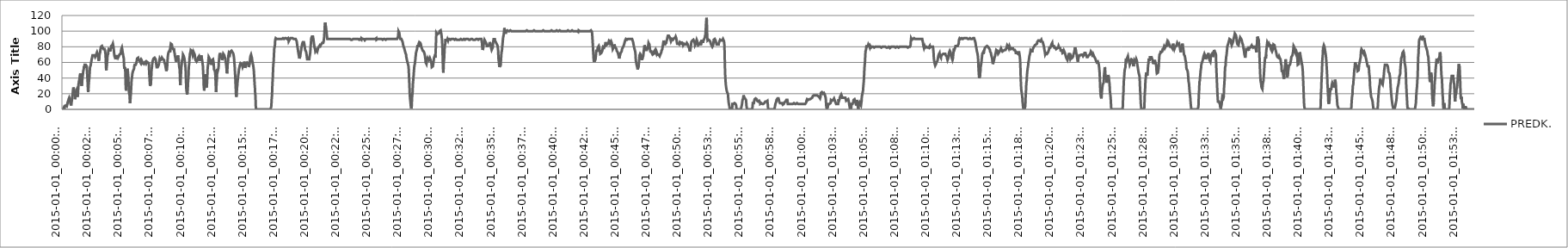
| Category | PREDK. |
|---|---|
| 2015-01-01_00:00:09 | 0 |
| 2015-01-01_00:00:10 | 0 |
| 2015-01-01_00:00:11 | 0 |
| 2015-01-01_00:00:12 | 0 |
| 2015-01-01_00:00:13 | 2 |
| 2015-01-01_00:00:14 | 2 |
| 2015-01-01_00:00:15 | 0 |
| 2015-01-01_00:00:16 | 0 |
| 2015-01-01_00:00:17 | 2 |
| 2015-01-01_00:00:18 | 4 |
| 2015-01-01_00:00:19 | 5 |
| 2015-01-01_00:00:20 | 5 |
| 2015-01-01_00:00:21 | 5 |
| 2015-01-01_00:00:22 | 5 |
| 2015-01-01_00:00:23 | 5 |
| 2015-01-01_00:00:24 | 6 |
| 2015-01-01_00:00:25 | 5 |
| 2015-01-01_00:00:26 | 6 |
| 2015-01-01_00:00:27 | 4 |
| 2015-01-01_00:00:28 | 4 |
| 2015-01-01_00:00:29 | 4 |
| 2015-01-01_00:00:30 | 4 |
| 2015-01-01_00:00:31 | 7 |
| 2015-01-01_00:00:32 | 9 |
| 2015-01-01_00:00:33 | 9 |
| 2015-01-01_00:00:34 | 10 |
| 2015-01-01_00:00:35 | 11 |
| 2015-01-01_00:00:36 | 11 |
| 2015-01-01_00:00:37 | 13 |
| 2015-01-01_00:00:38 | 13 |
| 2015-01-01_00:00:39 | 14 |
| 2015-01-01_00:00:40 | 15 |
| 2015-01-01_00:00:41 | 15 |
| 2015-01-01_00:00:42 | 14 |
| 2015-01-01_00:00:43 | 13 |
| 2015-01-01_00:00:44 | 10 |
| 2015-01-01_00:00:45 | 8 |
| 2015-01-01_00:00:46 | 9 |
| 2015-01-01_00:00:47 | 7 |
| 2015-01-01_00:00:48 | 7 |
| 2015-01-01_00:00:49 | 5 |
| 2015-01-01_00:00:50 | 7 |
| 2015-01-01_00:00:51 | 7 |
| 2015-01-01_00:00:52 | 8 |
| 2015-01-01_00:00:53 | 12 |
| 2015-01-01_00:00:54 | 15 |
| 2015-01-01_00:00:55 | 15 |
| 2015-01-01_00:00:56 | 16 |
| 2015-01-01_00:00:57 | 21 |
| 2015-01-01_00:00:58 | 24 |
| 2015-01-01_00:00:59 | 26 |
| 2015-01-01_00:01:00 | 28 |
| 2015-01-01_00:01:01 | 28 |
| 2015-01-01_00:01:02 | 27 |
| 2015-01-01_00:01:03 | 25 |
| 2015-01-01_00:01:04 | 24 |
| 2015-01-01_00:01:05 | 23 |
| 2015-01-01_00:01:06 | 19 |
| 2015-01-01_00:01:07 | 15 |
| 2015-01-01_00:01:08 | 13 |
| 2015-01-01_00:01:09 | 13 |
| 2015-01-01_00:01:10 | 16 |
| 2015-01-01_00:01:11 | 20 |
| 2015-01-01_00:01:12 | 21 |
| 2015-01-01_00:01:13 | 23 |
| 2015-01-01_00:01:14 | 23 |
| 2015-01-01_00:01:15 | 24 |
| 2015-01-01_00:01:16 | 25 |
| 2015-01-01_00:01:17 | 25 |
| 2015-01-01_00:01:18 | 24 |
| 2015-01-01_00:01:19 | 22 |
| 2015-01-01_00:01:20 | 18 |
| 2015-01-01_00:01:21 | 16 |
| 2015-01-01_00:01:22 | 20 |
| 2015-01-01_00:01:23 | 24 |
| 2015-01-01_00:01:24 | 28 |
| 2015-01-01_00:01:25 | 32 |
| 2015-01-01_00:01:26 | 33 |
| 2015-01-01_00:01:27 | 33 |
| 2015-01-01_00:01:28 | 37 |
| 2015-01-01_00:01:29 | 37 |
| 2015-01-01_00:01:30 | 39 |
| 2015-01-01_00:01:31 | 42 |
| 2015-01-01_00:01:32 | 44 |
| 2015-01-01_00:01:33 | 45 |
| 2015-01-01_00:01:34 | 46 |
| 2015-01-01_00:01:35 | 45 |
| 2015-01-01_00:01:36 | 42 |
| 2015-01-01_00:01:37 | 40 |
| 2015-01-01_00:01:38 | 37 |
| 2015-01-01_00:01:39 | 32 |
| 2015-01-01_00:01:40 | 30 |
| 2015-01-01_00:01:41 | 30 |
| 2015-01-01_00:01:42 | 33 |
| 2015-01-01_00:01:43 | 37 |
| 2015-01-01_00:01:44 | 39 |
| 2015-01-01_00:01:45 | 42 |
| 2015-01-01_00:01:46 | 44 |
| 2015-01-01_00:01:47 | 46 |
| 2015-01-01_00:01:48 | 49 |
| 2015-01-01_00:01:49 | 50 |
| 2015-01-01_00:01:50 | 51 |
| 2015-01-01_00:01:51 | 53 |
| 2015-01-01_00:01:52 | 55 |
| 2015-01-01_00:01:53 | 53 |
| 2015-01-01_00:01:54 | 54 |
| 2015-01-01_00:01:55 | 57 |
| 2015-01-01_00:01:56 | 56 |
| 2015-01-01_00:01:57 | 57 |
| 2015-01-01_00:01:58 | 56 |
| 2015-01-01_00:01:59 | 57 |
| 2015-01-01_00:02:00 | 57 |
| 2015-01-01_00:02:01 | 57 |
| 2015-01-01_00:02:02 | 57 |
| 2015-01-01_00:02:03 | 58 |
| 2015-01-01_00:02:04 | 56 |
| 2015-01-01_00:02:05 | 55 |
| 2015-01-01_00:02:06 | 51 |
| 2015-01-01_00:02:07 | 46 |
| 2015-01-01_00:02:08 | 41 |
| 2015-01-01_00:02:09 | 37 |
| 2015-01-01_00:02:10 | 30 |
| 2015-01-01_00:02:11 | 25 |
| 2015-01-01_00:02:12 | 22 |
| 2015-01-01_00:02:13 | 25 |
| 2015-01-01_00:02:14 | 29 |
| 2015-01-01_00:02:15 | 34 |
| 2015-01-01_00:02:16 | 34 |
| 2015-01-01_00:02:17 | 39 |
| 2015-01-01_00:02:18 | 42 |
| 2015-01-01_00:02:19 | 47 |
| 2015-01-01_00:02:20 | 51 |
| 2015-01-01_00:02:21 | 54 |
| 2015-01-01_00:02:22 | 54 |
| 2015-01-01_00:02:23 | 54 |
| 2015-01-01_00:02:24 | 56 |
| 2015-01-01_00:02:25 | 58 |
| 2015-01-01_00:02:26 | 58 |
| 2015-01-01_00:02:27 | 61 |
| 2015-01-01_00:02:28 | 61 |
| 2015-01-01_00:02:29 | 64 |
| 2015-01-01_00:02:30 | 65 |
| 2015-01-01_00:02:31 | 66 |
| 2015-01-01_00:02:32 | 67 |
| 2015-01-01_00:02:33 | 69 |
| 2015-01-01_00:02:34 | 69 |
| 2015-01-01_00:02:35 | 70 |
| 2015-01-01_00:02:36 | 70 |
| 2015-01-01_00:02:37 | 70 |
| 2015-01-01_00:02:38 | 69 |
| 2015-01-01_00:02:39 | 69 |
| 2015-01-01_00:02:40 | 69 |
| 2015-01-01_00:02:41 | 70 |
| 2015-01-01_00:02:42 | 69 |
| 2015-01-01_00:02:43 | 69 |
| 2015-01-01_00:02:44 | 68 |
| 2015-01-01_00:02:45 | 68 |
| 2015-01-01_00:02:46 | 67 |
| 2015-01-01_00:02:47 | 68 |
| 2015-01-01_00:02:48 | 68 |
| 2015-01-01_00:02:49 | 68 |
| 2015-01-01_00:02:50 | 69 |
| 2015-01-01_00:02:51 | 69 |
| 2015-01-01_00:02:52 | 71 |
| 2015-01-01_00:02:53 | 71 |
| 2015-01-01_00:02:54 | 72 |
| 2015-01-01_00:02:55 | 73 |
| 2015-01-01_00:02:56 | 73 |
| 2015-01-01_00:02:57 | 73 |
| 2015-01-01_00:02:58 | 72 |
| 2015-01-01_00:02:59 | 70 |
| 2015-01-01_00:03:00 | 68 |
| 2015-01-01_00:03:01 | 66 |
| 2015-01-01_00:03:02 | 65 |
| 2015-01-01_00:03:03 | 62 |
| 2015-01-01_00:03:04 | 61 |
| 2015-01-01_00:03:05 | 63 |
| 2015-01-01_00:03:06 | 66 |
| 2015-01-01_00:03:07 | 70 |
| 2015-01-01_00:03:08 | 71 |
| 2015-01-01_00:03:09 | 71 |
| 2015-01-01_00:03:10 | 73 |
| 2015-01-01_00:03:11 | 74 |
| 2015-01-01_00:03:12 | 77 |
| 2015-01-01_00:03:13 | 78 |
| 2015-01-01_00:03:14 | 80 |
| 2015-01-01_00:03:15 | 80 |
| 2015-01-01_00:03:16 | 81 |
| 2015-01-01_00:03:17 | 81 |
| 2015-01-01_00:03:18 | 80 |
| 2015-01-01_00:03:19 | 81 |
| 2015-01-01_00:03:20 | 80 |
| 2015-01-01_00:03:21 | 80 |
| 2015-01-01_00:03:22 | 79 |
| 2015-01-01_00:03:23 | 78 |
| 2015-01-01_00:03:24 | 78 |
| 2015-01-01_00:03:25 | 78 |
| 2015-01-01_00:03:26 | 78 |
| 2015-01-01_00:03:27 | 77 |
| 2015-01-01_00:03:28 | 77 |
| 2015-01-01_00:03:29 | 77 |
| 2015-01-01_00:03:30 | 76 |
| 2015-01-01_00:03:31 | 77 |
| 2015-01-01_00:03:32 | 77 |
| 2015-01-01_00:03:33 | 76 |
| 2015-01-01_00:03:34 | 75 |
| 2015-01-01_00:03:35 | 73 |
| 2015-01-01_00:03:36 | 71 |
| 2015-01-01_00:03:37 | 67 |
| 2015-01-01_00:03:38 | 59 |
| 2015-01-01_00:03:39 | 53 |
| 2015-01-01_00:03:40 | 50 |
| 2015-01-01_00:03:41 | 52 |
| 2015-01-01_00:03:42 | 54 |
| 2015-01-01_00:03:43 | 58 |
| 2015-01-01_00:03:44 | 60 |
| 2015-01-01_00:03:45 | 65 |
| 2015-01-01_00:03:46 | 69 |
| 2015-01-01_00:03:47 | 69 |
| 2015-01-01_00:03:48 | 70 |
| 2015-01-01_00:03:49 | 71 |
| 2015-01-01_00:03:50 | 75 |
| 2015-01-01_00:03:51 | 75 |
| 2015-01-01_00:03:52 | 77 |
| 2015-01-01_00:03:53 | 78 |
| 2015-01-01_00:03:54 | 77 |
| 2015-01-01_00:03:55 | 76 |
| 2015-01-01_00:03:56 | 76 |
| 2015-01-01_00:03:57 | 76 |
| 2015-01-01_00:03:58 | 74 |
| 2015-01-01_00:03:59 | 75 |
| 2015-01-01_00:04:00 | 75 |
| 2015-01-01_00:04:01 | 77 |
| 2015-01-01_00:04:02 | 78 |
| 2015-01-01_00:04:03 | 79 |
| 2015-01-01_00:04:04 | 81 |
| 2015-01-01_00:04:05 | 81 |
| 2015-01-01_00:04:06 | 82 |
| 2015-01-01_00:04:07 | 82 |
| 2015-01-01_00:04:08 | 81 |
| 2015-01-01_00:04:09 | 82 |
| 2015-01-01_00:04:10 | 83 |
| 2015-01-01_00:04:11 | 83 |
| 2015-01-01_00:04:12 | 84 |
| 2015-01-01_00:04:13 | 85 |
| 2015-01-01_00:04:14 | 83 |
| 2015-01-01_00:04:15 | 80 |
| 2015-01-01_00:04:16 | 77 |
| 2015-01-01_00:04:17 | 75 |
| 2015-01-01_00:04:18 | 72 |
| 2015-01-01_00:04:19 | 70 |
| 2015-01-01_00:04:20 | 68 |
| 2015-01-01_00:04:21 | 68 |
| 2015-01-01_00:04:22 | 67 |
| 2015-01-01_00:04:23 | 66 |
| 2015-01-01_00:04:24 | 65 |
| 2015-01-01_00:04:25 | 64 |
| 2015-01-01_00:04:26 | 65 |
| 2015-01-01_00:04:27 | 66 |
| 2015-01-01_00:04:28 | 67 |
| 2015-01-01_00:04:29 | 68 |
| 2015-01-01_00:04:30 | 68 |
| 2015-01-01_00:04:31 | 68 |
| 2015-01-01_00:04:32 | 69 |
| 2015-01-01_00:04:33 | 69 |
| 2015-01-01_00:04:34 | 68 |
| 2015-01-01_00:04:35 | 68 |
| 2015-01-01_00:04:36 | 67 |
| 2015-01-01_00:04:37 | 66 |
| 2015-01-01_00:04:38 | 66 |
| 2015-01-01_00:04:39 | 66 |
| 2015-01-01_00:04:40 | 67 |
| 2015-01-01_00:04:41 | 68 |
| 2015-01-01_00:04:42 | 68 |
| 2015-01-01_00:04:43 | 69 |
| 2015-01-01_00:04:44 | 70 |
| 2015-01-01_00:04:45 | 70 |
| 2015-01-01_00:04:46 | 71 |
| 2015-01-01_00:04:47 | 71 |
| 2015-01-01_00:04:48 | 71 |
| 2015-01-01_00:04:49 | 71 |
| 2015-01-01_00:04:50 | 72 |
| 2015-01-01_00:04:51 | 73 |
| 2015-01-01_00:04:52 | 74 |
| 2015-01-01_00:04:53 | 77 |
| 2015-01-01_00:04:54 | 78 |
| 2015-01-01_00:04:55 | 78 |
| 2015-01-01_00:04:56 | 79 |
| 2015-01-01_00:04:57 | 78 |
| 2015-01-01_00:04:58 | 76 |
| 2015-01-01_00:04:59 | 74 |
| 2015-01-01_00:05:00 | 73 |
| 2015-01-01_00:05:01 | 71 |
| 2015-01-01_00:05:02 | 71 |
| 2015-01-01_00:05:03 | 68 |
| 2015-01-01_00:05:04 | 68 |
| 2015-01-01_00:05:05 | 65 |
| 2015-01-01_00:05:06 | 60 |
| 2015-01-01_00:05:07 | 55 |
| 2015-01-01_00:05:08 | 52 |
| 2015-01-01_00:05:09 | 52 |
| 2015-01-01_00:05:10 | 54 |
| 2015-01-01_00:05:11 | 52 |
| 2015-01-01_00:05:12 | 50 |
| 2015-01-01_00:05:13 | 45 |
| 2015-01-01_00:05:14 | 33 |
| 2015-01-01_00:05:15 | 27 |
| 2015-01-01_00:05:16 | 24 |
| 2015-01-01_00:05:17 | 27 |
| 2015-01-01_00:05:18 | 34 |
| 2015-01-01_00:05:19 | 39 |
| 2015-01-01_00:05:20 | 42 |
| 2015-01-01_00:05:21 | 48 |
| 2015-01-01_00:05:22 | 52 |
| 2015-01-01_00:05:23 | 52 |
| 2015-01-01_00:05:24 | 51 |
| 2015-01-01_00:05:25 | 48 |
| 2015-01-01_00:05:26 | 45 |
| 2015-01-01_00:05:27 | 42 |
| 2015-01-01_00:05:28 | 35 |
| 2015-01-01_00:05:29 | 29 |
| 2015-01-01_00:05:30 | 23 |
| 2015-01-01_00:05:31 | 21 |
| 2015-01-01_00:05:32 | 20 |
| 2015-01-01_00:05:33 | 19 |
| 2015-01-01_00:05:34 | 14 |
| 2015-01-01_00:05:35 | 8 |
| 2015-01-01_00:05:36 | 7 |
| 2015-01-01_00:05:37 | 11 |
| 2015-01-01_00:05:38 | 16 |
| 2015-01-01_00:05:39 | 17 |
| 2015-01-01_00:05:40 | 21 |
| 2015-01-01_00:05:41 | 28 |
| 2015-01-01_00:05:42 | 32 |
| 2015-01-01_00:05:43 | 38 |
| 2015-01-01_00:05:44 | 38 |
| 2015-01-01_00:05:45 | 40 |
| 2015-01-01_00:05:46 | 44 |
| 2015-01-01_00:05:47 | 46 |
| 2015-01-01_00:05:48 | 45 |
| 2015-01-01_00:05:49 | 47 |
| 2015-01-01_00:05:50 | 49 |
| 2015-01-01_00:05:51 | 49 |
| 2015-01-01_00:05:52 | 49 |
| 2015-01-01_00:05:53 | 48 |
| 2015-01-01_00:05:54 | 50 |
| 2015-01-01_00:05:55 | 52 |
| 2015-01-01_00:05:56 | 55 |
| 2015-01-01_00:05:57 | 56 |
| 2015-01-01_00:05:58 | 57 |
| 2015-01-01_00:05:59 | 57 |
| 2015-01-01_00:06:00 | 58 |
| 2015-01-01_00:06:01 | 57 |
| 2015-01-01_00:06:02 | 56 |
| 2015-01-01_00:06:03 | 57 |
| 2015-01-01_00:06:04 | 57 |
| 2015-01-01_00:06:05 | 58 |
| 2015-01-01_00:06:06 | 59 |
| 2015-01-01_00:06:07 | 60 |
| 2015-01-01_00:06:08 | 62 |
| 2015-01-01_00:06:09 | 63 |
| 2015-01-01_00:06:10 | 65 |
| 2015-01-01_00:06:11 | 64 |
| 2015-01-01_00:06:12 | 65 |
| 2015-01-01_00:06:13 | 65 |
| 2015-01-01_00:06:14 | 66 |
| 2015-01-01_00:06:15 | 66 |
| 2015-01-01_00:06:16 | 67 |
| 2015-01-01_00:06:17 | 64 |
| 2015-01-01_00:06:18 | 65 |
| 2015-01-01_00:06:19 | 63 |
| 2015-01-01_00:06:20 | 63 |
| 2015-01-01_00:06:21 | 63 |
| 2015-01-01_00:06:22 | 62 |
| 2015-01-01_00:06:23 | 62 |
| 2015-01-01_00:06:24 | 62 |
| 2015-01-01_00:06:25 | 62 |
| 2015-01-01_00:06:26 | 60 |
| 2015-01-01_00:06:27 | 61 |
| 2015-01-01_00:06:28 | 62 |
| 2015-01-01_00:06:29 | 62 |
| 2015-01-01_00:06:30 | 62 |
| 2015-01-01_00:06:31 | 60 |
| 2015-01-01_00:06:32 | 61 |
| 2015-01-01_00:06:33 | 62 |
| 2015-01-01_00:06:34 | 61 |
| 2015-01-01_00:06:35 | 62 |
| 2015-01-01_00:06:36 | 61 |
| 2015-01-01_00:06:37 | 61 |
| 2015-01-01_00:06:38 | 59 |
| 2015-01-01_00:06:39 | 60 |
| 2015-01-01_00:06:40 | 59 |
| 2015-01-01_00:06:41 | 59 |
| 2015-01-01_00:06:42 | 59 |
| 2015-01-01_00:06:43 | 58 |
| 2015-01-01_00:06:44 | 58 |
| 2015-01-01_00:06:45 | 59 |
| 2015-01-01_00:06:46 | 60 |
| 2015-01-01_00:06:47 | 59 |
| 2015-01-01_00:06:48 | 59 |
| 2015-01-01_00:06:49 | 61 |
| 2015-01-01_00:06:50 | 60 |
| 2015-01-01_00:06:51 | 61 |
| 2015-01-01_00:06:52 | 60 |
| 2015-01-01_00:06:53 | 60 |
| 2015-01-01_00:06:54 | 59 |
| 2015-01-01_00:06:55 | 60 |
| 2015-01-01_00:06:56 | 60 |
| 2015-01-01_00:06:57 | 61 |
| 2015-01-01_00:06:58 | 61 |
| 2015-01-01_00:06:59 | 62 |
| 2015-01-01_00:07:00 | 62 |
| 2015-01-01_00:07:01 | 62 |
| 2015-01-01_00:07:02 | 60 |
| 2015-01-01_00:07:03 | 60 |
| 2015-01-01_00:07:04 | 61 |
| 2015-01-01_00:07:05 | 61 |
| 2015-01-01_00:07:06 | 60 |
| 2015-01-01_00:07:07 | 59 |
| 2015-01-01_00:07:08 | 53 |
| 2015-01-01_00:07:09 | 45 |
| 2015-01-01_00:07:10 | 43 |
| 2015-01-01_00:07:11 | 38 |
| 2015-01-01_00:07:12 | 33 |
| 2015-01-01_00:07:13 | 30 |
| 2015-01-01_00:07:14 | 30 |
| 2015-01-01_00:07:15 | 31 |
| 2015-01-01_00:07:16 | 30 |
| 2015-01-01_00:07:17 | 33 |
| 2015-01-01_00:07:18 | 38 |
| 2015-01-01_00:07:19 | 44 |
| 2015-01-01_00:07:20 | 50 |
| 2015-01-01_00:07:21 | 51 |
| 2015-01-01_00:07:22 | 54 |
| 2015-01-01_00:07:23 | 57 |
| 2015-01-01_00:07:24 | 59 |
| 2015-01-01_00:07:25 | 61 |
| 2015-01-01_00:07:26 | 62 |
| 2015-01-01_00:07:27 | 63 |
| 2015-01-01_00:07:28 | 63 |
| 2015-01-01_00:07:29 | 64 |
| 2015-01-01_00:07:30 | 65 |
| 2015-01-01_00:07:31 | 66 |
| 2015-01-01_00:07:32 | 65 |
| 2015-01-01_00:07:33 | 66 |
| 2015-01-01_00:07:34 | 66 |
| 2015-01-01_00:07:35 | 66 |
| 2015-01-01_00:07:36 | 67 |
| 2015-01-01_00:07:37 | 65 |
| 2015-01-01_00:07:38 | 66 |
| 2015-01-01_00:07:39 | 66 |
| 2015-01-01_00:07:40 | 64 |
| 2015-01-01_00:07:41 | 63 |
| 2015-01-01_00:07:42 | 60 |
| 2015-01-01_00:07:43 | 58 |
| 2015-01-01_00:07:44 | 56 |
| 2015-01-01_00:07:45 | 54 |
| 2015-01-01_00:07:46 | 53 |
| 2015-01-01_00:07:47 | 53 |
| 2015-01-01_00:07:48 | 53 |
| 2015-01-01_00:07:49 | 53 |
| 2015-01-01_00:07:50 | 54 |
| 2015-01-01_00:07:51 | 55 |
| 2015-01-01_00:07:52 | 55 |
| 2015-01-01_00:07:53 | 55 |
| 2015-01-01_00:07:54 | 56 |
| 2015-01-01_00:07:55 | 56 |
| 2015-01-01_00:07:56 | 58 |
| 2015-01-01_00:07:57 | 59 |
| 2015-01-01_00:07:58 | 62 |
| 2015-01-01_00:07:59 | 63 |
| 2015-01-01_00:08:00 | 65 |
| 2015-01-01_00:08:01 | 65 |
| 2015-01-01_00:08:02 | 65 |
| 2015-01-01_00:08:03 | 64 |
| 2015-01-01_00:08:04 | 63 |
| 2015-01-01_00:08:05 | 63 |
| 2015-01-01_00:08:06 | 62 |
| 2015-01-01_00:08:07 | 63 |
| 2015-01-01_00:08:08 | 63 |
| 2015-01-01_00:08:09 | 64 |
| 2015-01-01_00:08:10 | 64 |
| 2015-01-01_00:08:11 | 66 |
| 2015-01-01_00:08:12 | 66 |
| 2015-01-01_00:08:13 | 67 |
| 2015-01-01_00:08:14 | 66 |
| 2015-01-01_00:08:15 | 65 |
| 2015-01-01_00:08:16 | 64 |
| 2015-01-01_00:08:17 | 64 |
| 2015-01-01_00:08:18 | 63 |
| 2015-01-01_00:08:19 | 63 |
| 2015-01-01_00:08:20 | 63 |
| 2015-01-01_00:08:21 | 63 |
| 2015-01-01_00:08:22 | 61 |
| 2015-01-01_00:08:23 | 61 |
| 2015-01-01_00:08:24 | 59 |
| 2015-01-01_00:08:25 | 58 |
| 2015-01-01_00:08:26 | 58 |
| 2015-01-01_00:08:27 | 57 |
| 2015-01-01_00:08:28 | 55 |
| 2015-01-01_00:08:29 | 54 |
| 2015-01-01_00:08:30 | 52 |
| 2015-01-01_00:08:31 | 51 |
| 2015-01-01_00:08:32 | 49 |
| 2015-01-01_00:08:33 | 49 |
| 2015-01-01_00:08:34 | 50 |
| 2015-01-01_00:08:35 | 52 |
| 2015-01-01_00:08:36 | 54 |
| 2015-01-01_00:08:37 | 59 |
| 2015-01-01_00:08:38 | 63 |
| 2015-01-01_00:08:39 | 67 |
| 2015-01-01_00:08:40 | 69 |
| 2015-01-01_00:08:41 | 71 |
| 2015-01-01_00:08:42 | 71 |
| 2015-01-01_00:08:43 | 73 |
| 2015-01-01_00:08:44 | 72 |
| 2015-01-01_00:08:45 | 73 |
| 2015-01-01_00:08:46 | 73 |
| 2015-01-01_00:08:47 | 75 |
| 2015-01-01_00:08:48 | 74 |
| 2015-01-01_00:08:49 | 74 |
| 2015-01-01_00:08:50 | 73 |
| 2015-01-01_00:08:51 | 76 |
| 2015-01-01_00:08:52 | 80 |
| 2015-01-01_00:08:53 | 82 |
| 2015-01-01_00:08:54 | 84 |
| 2015-01-01_00:08:55 | 83 |
| 2015-01-01_00:08:56 | 83 |
| 2015-01-01_00:08:57 | 84 |
| 2015-01-01_00:08:58 | 83 |
| 2015-01-01_00:08:59 | 83 |
| 2015-01-01_00:09:00 | 80 |
| 2015-01-01_00:09:01 | 80 |
| 2015-01-01_00:09:02 | 79 |
| 2015-01-01_00:09:03 | 78 |
| 2015-01-01_00:09:04 | 78 |
| 2015-01-01_00:09:05 | 77 |
| 2015-01-01_00:09:06 | 76 |
| 2015-01-01_00:09:07 | 78 |
| 2015-01-01_00:09:08 | 77 |
| 2015-01-01_00:09:09 | 77 |
| 2015-01-01_00:09:10 | 76 |
| 2015-01-01_00:09:11 | 73 |
| 2015-01-01_00:09:12 | 72 |
| 2015-01-01_00:09:13 | 71 |
| 2015-01-01_00:09:14 | 68 |
| 2015-01-01_00:09:15 | 67 |
| 2015-01-01_00:09:16 | 66 |
| 2015-01-01_00:09:17 | 64 |
| 2015-01-01_00:09:18 | 63 |
| 2015-01-01_00:09:19 | 61 |
| 2015-01-01_00:09:20 | 61 |
| 2015-01-01_00:09:21 | 63 |
| 2015-01-01_00:09:22 | 64 |
| 2015-01-01_00:09:23 | 63 |
| 2015-01-01_00:09:24 | 64 |
| 2015-01-01_00:09:25 | 63 |
| 2015-01-01_00:09:26 | 65 |
| 2015-01-01_00:09:27 | 67 |
| 2015-01-01_00:09:28 | 68 |
| 2015-01-01_00:09:29 | 69 |
| 2015-01-01_00:09:30 | 67 |
| 2015-01-01_00:09:31 | 65 |
| 2015-01-01_00:09:32 | 63 |
| 2015-01-01_00:09:33 | 59 |
| 2015-01-01_00:09:34 | 58 |
| 2015-01-01_00:09:35 | 54 |
| 2015-01-01_00:09:36 | 53 |
| 2015-01-01_00:09:37 | 51 |
| 2015-01-01_00:09:38 | 45 |
| 2015-01-01_00:09:39 | 35 |
| 2015-01-01_00:09:40 | 31 |
| 2015-01-01_00:09:41 | 34 |
| 2015-01-01_00:09:42 | 39 |
| 2015-01-01_00:09:43 | 45 |
| 2015-01-01_00:09:44 | 50 |
| 2015-01-01_00:09:45 | 54 |
| 2015-01-01_00:09:46 | 54 |
| 2015-01-01_00:09:47 | 58 |
| 2015-01-01_00:09:48 | 62 |
| 2015-01-01_00:09:49 | 63 |
| 2015-01-01_00:09:50 | 64 |
| 2015-01-01_00:09:51 | 65 |
| 2015-01-01_00:09:52 | 67 |
| 2015-01-01_00:09:53 | 70 |
| 2015-01-01_00:09:54 | 70 |
| 2015-01-01_00:09:55 | 69 |
| 2015-01-01_00:09:56 | 70 |
| 2015-01-01_00:09:57 | 68 |
| 2015-01-01_00:09:58 | 69 |
| 2015-01-01_00:09:59 | 67 |
| 2015-01-01_00:10:00 | 65 |
| 2015-01-01_00:10:01 | 63 |
| 2015-01-01_00:10:02 | 61 |
| 2015-01-01_00:10:03 | 59 |
| 2015-01-01_00:10:04 | 57 |
| 2015-01-01_00:10:05 | 54 |
| 2015-01-01_00:10:06 | 50 |
| 2015-01-01_00:10:07 | 42 |
| 2015-01-01_00:10:08 | 35 |
| 2015-01-01_00:10:09 | 27 |
| 2015-01-01_00:10:10 | 24 |
| 2015-01-01_00:10:11 | 23 |
| 2015-01-01_00:10:12 | 21 |
| 2015-01-01_00:10:13 | 19 |
| 2015-01-01_00:10:14 | 20 |
| 2015-01-01_00:10:15 | 22 |
| 2015-01-01_00:10:16 | 25 |
| 2015-01-01_00:10:17 | 31 |
| 2015-01-01_00:10:18 | 37 |
| 2015-01-01_00:10:19 | 39 |
| 2015-01-01_00:10:20 | 45 |
| 2015-01-01_00:10:21 | 53 |
| 2015-01-01_00:10:22 | 56 |
| 2015-01-01_00:10:23 | 58 |
| 2015-01-01_00:10:24 | 62 |
| 2015-01-01_00:10:25 | 66 |
| 2015-01-01_00:10:26 | 68 |
| 2015-01-01_00:10:27 | 71 |
| 2015-01-01_00:10:28 | 71 |
| 2015-01-01_00:10:29 | 72 |
| 2015-01-01_00:10:30 | 74 |
| 2015-01-01_00:10:31 | 76 |
| 2015-01-01_00:10:32 | 77 |
| 2015-01-01_00:10:33 | 77 |
| 2015-01-01_00:10:34 | 77 |
| 2015-01-01_00:10:35 | 75 |
| 2015-01-01_00:10:36 | 75 |
| 2015-01-01_00:10:37 | 74 |
| 2015-01-01_00:10:38 | 74 |
| 2015-01-01_00:10:39 | 72 |
| 2015-01-01_00:10:40 | 71 |
| 2015-01-01_00:10:41 | 69 |
| 2015-01-01_00:10:42 | 69 |
| 2015-01-01_00:10:43 | 70 |
| 2015-01-01_00:10:44 | 71 |
| 2015-01-01_00:10:45 | 73 |
| 2015-01-01_00:10:46 | 74 |
| 2015-01-01_00:10:47 | 73 |
| 2015-01-01_00:10:48 | 73 |
| 2015-01-01_00:10:49 | 72 |
| 2015-01-01_00:10:50 | 70 |
| 2015-01-01_00:10:51 | 68 |
| 2015-01-01_00:10:52 | 65 |
| 2015-01-01_00:10:53 | 65 |
| 2015-01-01_00:10:54 | 63 |
| 2015-01-01_00:10:55 | 64 |
| 2015-01-01_00:10:56 | 63 |
| 2015-01-01_00:10:57 | 62 |
| 2015-01-01_00:10:58 | 62 |
| 2015-01-01_00:10:59 | 61 |
| 2015-01-01_00:11:00 | 60 |
| 2015-01-01_00:11:01 | 60 |
| 2015-01-01_00:11:02 | 61 |
| 2015-01-01_00:11:03 | 60 |
| 2015-01-01_00:11:04 | 63 |
| 2015-01-01_00:11:05 | 64 |
| 2015-01-01_00:11:06 | 66 |
| 2015-01-01_00:11:07 | 67 |
| 2015-01-01_00:11:08 | 67 |
| 2015-01-01_00:11:09 | 67 |
| 2015-01-01_00:11:10 | 66 |
| 2015-01-01_00:11:11 | 68 |
| 2015-01-01_00:11:12 | 67 |
| 2015-01-01_00:11:13 | 66 |
| 2015-01-01_00:11:14 | 64 |
| 2015-01-01_00:11:15 | 63 |
| 2015-01-01_00:11:16 | 63 |
| 2015-01-01_00:11:17 | 62 |
| 2015-01-01_00:11:18 | 64 |
| 2015-01-01_00:11:19 | 64 |
| 2015-01-01_00:11:20 | 67 |
| 2015-01-01_00:11:21 | 68 |
| 2015-01-01_00:11:22 | 69 |
| 2015-01-01_00:11:23 | 68 |
| 2015-01-01_00:11:24 | 66 |
| 2015-01-01_00:11:25 | 65 |
| 2015-01-01_00:11:26 | 63 |
| 2015-01-01_00:11:27 | 61 |
| 2015-01-01_00:11:28 | 61 |
| 2015-01-01_00:11:29 | 60 |
| 2015-01-01_00:11:30 | 55 |
| 2015-01-01_00:11:31 | 49 |
| 2015-01-01_00:11:32 | 44 |
| 2015-01-01_00:11:33 | 38 |
| 2015-01-01_00:11:34 | 30 |
| 2015-01-01_00:11:35 | 27 |
| 2015-01-01_00:11:36 | 24 |
| 2015-01-01_00:11:37 | 25 |
| 2015-01-01_00:11:38 | 29 |
| 2015-01-01_00:11:39 | 36 |
| 2015-01-01_00:11:40 | 37 |
| 2015-01-01_00:11:41 | 38 |
| 2015-01-01_00:11:42 | 43 |
| 2015-01-01_00:11:43 | 45 |
| 2015-01-01_00:11:44 | 44 |
| 2015-01-01_00:11:45 | 41 |
| 2015-01-01_00:11:46 | 34 |
| 2015-01-01_00:11:47 | 28 |
| 2015-01-01_00:11:48 | 27 |
| 2015-01-01_00:11:49 | 30 |
| 2015-01-01_00:11:50 | 34 |
| 2015-01-01_00:11:51 | 40 |
| 2015-01-01_00:11:52 | 46 |
| 2015-01-01_00:11:53 | 53 |
| 2015-01-01_00:11:54 | 55 |
| 2015-01-01_00:11:55 | 56 |
| 2015-01-01_00:11:56 | 60 |
| 2015-01-01_00:11:57 | 64 |
| 2015-01-01_00:11:58 | 67 |
| 2015-01-01_00:11:59 | 67 |
| 2015-01-01_00:12:00 | 67 |
| 2015-01-01_00:12:01 | 66 |
| 2015-01-01_00:12:02 | 65 |
| 2015-01-01_00:12:03 | 63 |
| 2015-01-01_00:12:04 | 62 |
| 2015-01-01_00:12:05 | 62 |
| 2015-01-01_00:12:06 | 62 |
| 2015-01-01_00:12:07 | 60 |
| 2015-01-01_00:12:08 | 60 |
| 2015-01-01_00:12:09 | 59 |
| 2015-01-01_00:12:10 | 57 |
| 2015-01-01_00:12:11 | 58 |
| 2015-01-01_00:12:12 | 59 |
| 2015-01-01_00:12:13 | 61 |
| 2015-01-01_00:12:14 | 63 |
| 2015-01-01_00:12:15 | 64 |
| 2015-01-01_00:12:16 | 64 |
| 2015-01-01_00:12:17 | 64 |
| 2015-01-01_00:12:18 | 63 |
| 2015-01-01_00:12:19 | 64 |
| 2015-01-01_00:12:20 | 63 |
| 2015-01-01_00:12:21 | 61 |
| 2015-01-01_00:12:22 | 59 |
| 2015-01-01_00:12:23 | 55 |
| 2015-01-01_00:12:24 | 51 |
| 2015-01-01_00:12:25 | 51 |
| 2015-01-01_00:12:26 | 51 |
| 2015-01-01_00:12:27 | 51 |
| 2015-01-01_00:12:28 | 49 |
| 2015-01-01_00:12:29 | 48 |
| 2015-01-01_00:12:30 | 46 |
| 2015-01-01_00:12:31 | 41 |
| 2015-01-01_00:12:32 | 33 |
| 2015-01-01_00:12:33 | 27 |
| 2015-01-01_00:12:34 | 22 |
| 2015-01-01_00:12:35 | 25 |
| 2015-01-01_00:12:36 | 33 |
| 2015-01-01_00:12:37 | 36 |
| 2015-01-01_00:12:38 | 39 |
| 2015-01-01_00:12:39 | 47 |
| 2015-01-01_00:12:40 | 52 |
| 2015-01-01_00:12:41 | 53 |
| 2015-01-01_00:12:42 | 52 |
| 2015-01-01_00:12:43 | 50 |
| 2015-01-01_00:12:44 | 51 |
| 2015-01-01_00:12:45 | 52 |
| 2015-01-01_00:12:46 | 54 |
| 2015-01-01_00:12:47 | 60 |
| 2015-01-01_00:12:48 | 61 |
| 2015-01-01_00:12:49 | 65 |
| 2015-01-01_00:12:50 | 68 |
| 2015-01-01_00:12:51 | 70 |
| 2015-01-01_00:12:52 | 71 |
| 2015-01-01_00:12:53 | 72 |
| 2015-01-01_00:12:54 | 72 |
| 2015-01-01_00:12:55 | 70 |
| 2015-01-01_00:12:56 | 69 |
| 2015-01-01_00:12:57 | 69 |
| 2015-01-01_00:12:58 | 68 |
| 2015-01-01_00:12:59 | 68 |
| 2015-01-01_00:13:00 | 65 |
| 2015-01-01_00:13:01 | 67 |
| 2015-01-01_00:13:02 | 65 |
| 2015-01-01_00:13:03 | 63 |
| 2015-01-01_00:13:04 | 62 |
| 2015-01-01_00:13:05 | 63 |
| 2015-01-01_00:13:06 | 65 |
| 2015-01-01_00:13:07 | 68 |
| 2015-01-01_00:13:08 | 69 |
| 2015-01-01_00:13:09 | 71 |
| 2015-01-01_00:13:10 | 71 |
| 2015-01-01_00:13:11 | 72 |
| 2015-01-01_00:13:12 | 70 |
| 2015-01-01_00:13:13 | 70 |
| 2015-01-01_00:13:14 | 69 |
| 2015-01-01_00:13:15 | 68 |
| 2015-01-01_00:13:16 | 67 |
| 2015-01-01_00:13:17 | 67 |
| 2015-01-01_00:13:18 | 66 |
| 2015-01-01_00:13:19 | 65 |
| 2015-01-01_00:13:20 | 62 |
| 2015-01-01_00:13:21 | 61 |
| 2015-01-01_00:13:22 | 59 |
| 2015-01-01_00:13:23 | 58 |
| 2015-01-01_00:13:24 | 55 |
| 2015-01-01_00:13:25 | 52 |
| 2015-01-01_00:13:26 | 48 |
| 2015-01-01_00:13:27 | 46 |
| 2015-01-01_00:13:28 | 48 |
| 2015-01-01_00:13:29 | 52 |
| 2015-01-01_00:13:30 | 57 |
| 2015-01-01_00:13:31 | 59 |
| 2015-01-01_00:13:32 | 61 |
| 2015-01-01_00:13:33 | 65 |
| 2015-01-01_00:13:34 | 69 |
| 2015-01-01_00:13:35 | 70 |
| 2015-01-01_00:13:36 | 72 |
| 2015-01-01_00:13:37 | 71 |
| 2015-01-01_00:13:38 | 71 |
| 2015-01-01_00:13:39 | 71 |
| 2015-01-01_00:13:40 | 71 |
| 2015-01-01_00:13:41 | 70 |
| 2015-01-01_00:13:42 | 72 |
| 2015-01-01_00:13:43 | 72 |
| 2015-01-01_00:13:44 | 74 |
| 2015-01-01_00:13:45 | 75 |
| 2015-01-01_00:13:46 | 75 |
| 2015-01-01_00:13:47 | 74 |
| 2015-01-01_00:13:48 | 74 |
| 2015-01-01_00:13:49 | 75 |
| 2015-01-01_00:13:50 | 74 |
| 2015-01-01_00:13:51 | 75 |
| 2015-01-01_00:13:52 | 74 |
| 2015-01-01_00:13:53 | 74 |
| 2015-01-01_00:13:54 | 73 |
| 2015-01-01_00:13:55 | 73 |
| 2015-01-01_00:13:56 | 72 |
| 2015-01-01_00:13:57 | 72 |
| 2015-01-01_00:13:58 | 71 |
| 2015-01-01_00:13:59 | 70 |
| 2015-01-01_00:14:00 | 68 |
| 2015-01-01_00:14:01 | 66 |
| 2015-01-01_00:14:02 | 63 |
| 2015-01-01_00:14:03 | 59 |
| 2015-01-01_00:14:04 | 57 |
| 2015-01-01_00:14:05 | 52 |
| 2015-01-01_00:14:06 | 47 |
| 2015-01-01_00:14:07 | 43 |
| 2015-01-01_00:14:08 | 37 |
| 2015-01-01_00:14:09 | 31 |
| 2015-01-01_00:14:10 | 25 |
| 2015-01-01_00:14:11 | 18 |
| 2015-01-01_00:14:12 | 16 |
| 2015-01-01_00:14:13 | 16 |
| 2015-01-01_00:14:14 | 19 |
| 2015-01-01_00:14:15 | 24 |
| 2015-01-01_00:14:16 | 28 |
| 2015-01-01_00:14:17 | 30 |
| 2015-01-01_00:14:18 | 34 |
| 2015-01-01_00:14:19 | 37 |
| 2015-01-01_00:14:20 | 39 |
| 2015-01-01_00:14:21 | 42 |
| 2015-01-01_00:14:22 | 43 |
| 2015-01-01_00:14:23 | 46 |
| 2015-01-01_00:14:24 | 48 |
| 2015-01-01_00:14:25 | 51 |
| 2015-01-01_00:14:26 | 50 |
| 2015-01-01_00:14:27 | 53 |
| 2015-01-01_00:14:28 | 53 |
| 2015-01-01_00:14:29 | 56 |
| 2015-01-01_00:14:30 | 55 |
| 2015-01-01_00:14:31 | 55 |
| 2015-01-01_00:14:32 | 57 |
| 2015-01-01_00:14:33 | 59 |
| 2015-01-01_00:14:34 | 59 |
| 2015-01-01_00:14:35 | 58 |
| 2015-01-01_00:14:36 | 59 |
| 2015-01-01_00:14:37 | 58 |
| 2015-01-01_00:14:38 | 58 |
| 2015-01-01_00:14:39 | 57 |
| 2015-01-01_00:14:40 | 57 |
| 2015-01-01_00:14:41 | 56 |
| 2015-01-01_00:14:42 | 56 |
| 2015-01-01_00:14:43 | 54 |
| 2015-01-01_00:14:44 | 55 |
| 2015-01-01_00:14:45 | 55 |
| 2015-01-01_00:14:46 | 56 |
| 2015-01-01_00:14:47 | 55 |
| 2015-01-01_00:14:48 | 56 |
| 2015-01-01_00:14:49 | 56 |
| 2015-01-01_00:14:50 | 58 |
| 2015-01-01_00:14:51 | 61 |
| 2015-01-01_00:14:52 | 61 |
| 2015-01-01_00:14:53 | 58 |
| 2015-01-01_00:14:54 | 56 |
| 2015-01-01_00:14:55 | 53 |
| 2015-01-01_00:14:56 | 52 |
| 2015-01-01_00:14:57 | 52 |
| 2015-01-01_00:14:58 | 53 |
| 2015-01-01_00:14:59 | 57 |
| 2015-01-01_00:15:00 | 59 |
| 2015-01-01_00:15:01 | 60 |
| 2015-01-01_00:15:02 | 60 |
| 2015-01-01_00:15:03 | 59 |
| 2015-01-01_00:15:04 | 60 |
| 2015-01-01_00:15:05 | 60 |
| 2015-01-01_00:15:06 | 59 |
| 2015-01-01_00:15:07 | 60 |
| 2015-01-01_00:15:08 | 60 |
| 2015-01-01_00:15:09 | 60 |
| 2015-01-01_00:15:10 | 59 |
| 2015-01-01_00:15:11 | 58 |
| 2015-01-01_00:15:12 | 56 |
| 2015-01-01_00:15:13 | 54 |
| 2015-01-01_00:15:14 | 54 |
| 2015-01-01_00:15:15 | 55 |
| 2015-01-01_00:15:16 | 55 |
| 2015-01-01_00:15:17 | 59 |
| 2015-01-01_00:15:18 | 61 |
| 2015-01-01_00:15:19 | 64 |
| 2015-01-01_00:15:20 | 66 |
| 2015-01-01_00:15:21 | 68 |
| 2015-01-01_00:15:22 | 69 |
| 2015-01-01_00:15:23 | 68 |
| 2015-01-01_00:15:24 | 70 |
| 2015-01-01_00:15:25 | 69 |
| 2015-01-01_00:15:26 | 68 |
| 2015-01-01_00:15:27 | 68 |
| 2015-01-01_00:15:28 | 66 |
| 2015-01-01_00:15:29 | 65 |
| 2015-01-01_00:15:30 | 62 |
| 2015-01-01_00:15:31 | 62 |
| 2015-01-01_00:15:32 | 59 |
| 2015-01-01_00:15:33 | 59 |
| 2015-01-01_00:15:34 | 57 |
| 2015-01-01_00:15:35 | 56 |
| 2015-01-01_00:15:36 | 53 |
| 2015-01-01_00:15:37 | 51 |
| 2015-01-01_00:15:38 | 48 |
| 2015-01-01_00:15:39 | 43 |
| 2015-01-01_00:15:40 | 39 |
| 2015-01-01_00:15:41 | 34 |
| 2015-01-01_00:15:42 | 30 |
| 2015-01-01_00:15:43 | 27 |
| 2015-01-01_00:15:44 | 21 |
| 2015-01-01_00:15:45 | 18 |
| 2015-01-01_00:15:46 | 12 |
| 2015-01-01_00:15:47 | 4 |
| 2015-01-01_00:15:48 | 1 |
| 2015-01-01_00:15:49 | 0 |
| 2015-01-01_00:15:50 | 0 |
| 2015-01-01_00:15:51 | 0 |
| 2015-01-01_00:15:52 | 0 |
| 2015-01-01_00:15:53 | 0 |
| 2015-01-01_00:15:54 | 0 |
| 2015-01-01_00:15:55 | 0 |
| 2015-01-01_00:15:56 | 0 |
| 2015-01-01_00:15:57 | 0 |
| 2015-01-01_00:15:58 | 0 |
| 2015-01-01_00:15:59 | 0 |
| 2015-01-01_00:16:00 | 0 |
| 2015-01-01_00:16:01 | 0 |
| 2015-01-01_00:16:02 | 0 |
| 2015-01-01_00:16:03 | 0 |
| 2015-01-01_00:16:04 | 0 |
| 2015-01-01_00:16:05 | 0 |
| 2015-01-01_00:16:06 | 0 |
| 2015-01-01_00:16:07 | 0 |
| 2015-01-01_00:16:08 | 0 |
| 2015-01-01_00:16:09 | 0 |
| 2015-01-01_00:16:10 | 0 |
| 2015-01-01_00:16:11 | 0 |
| 2015-01-01_00:16:12 | 0 |
| 2015-01-01_00:16:13 | 0 |
| 2015-01-01_00:16:14 | 0 |
| 2015-01-01_00:16:15 | 0 |
| 2015-01-01_00:16:16 | 0 |
| 2015-01-01_00:16:17 | 0 |
| 2015-01-01_00:16:18 | 0 |
| 2015-01-01_00:16:19 | 0 |
| 2015-01-01_00:16:20 | 0 |
| 2015-01-01_00:16:21 | 0 |
| 2015-01-01_00:16:22 | 0 |
| 2015-01-01_00:16:23 | 0 |
| 2015-01-01_00:16:24 | 0 |
| 2015-01-01_00:16:25 | 0 |
| 2015-01-01_00:16:26 | 0 |
| 2015-01-01_00:16:27 | 0 |
| 2015-01-01_00:16:28 | 0 |
| 2015-01-01_00:16:29 | 0 |
| 2015-01-01_00:16:30 | 0 |
| 2015-01-01_00:16:31 | 0 |
| 2015-01-01_00:16:32 | 0 |
| 2015-01-01_00:16:33 | 0 |
| 2015-01-01_00:16:34 | 0 |
| 2015-01-01_00:16:35 | 0 |
| 2015-01-01_00:16:36 | 0 |
| 2015-01-01_00:16:37 | 0 |
| 2015-01-01_00:16:38 | 0 |
| 2015-01-01_00:16:39 | 0 |
| 2015-01-01_00:16:40 | 0 |
| 2015-01-01_00:16:41 | 0 |
| 2015-01-01_00:16:42 | 0 |
| 2015-01-01_00:16:43 | 0 |
| 2015-01-01_00:16:44 | 0 |
| 2015-01-01_00:16:45 | 0 |
| 2015-01-01_00:16:46 | 0 |
| 2015-01-01_00:16:47 | 0 |
| 2015-01-01_00:16:48 | 0 |
| 2015-01-01_00:16:49 | 0 |
| 2015-01-01_00:16:50 | 0 |
| 2015-01-01_00:16:51 | 0 |
| 2015-01-01_00:16:52 | 0 |
| 2015-01-01_00:16:53 | 0 |
| 2015-01-01_00:16:54 | 0 |
| 2015-01-01_00:16:55 | 0 |
| 2015-01-01_00:16:56 | 0 |
| 2015-01-01_00:16:57 | 0 |
| 2015-01-01_00:16:58 | 0 |
| 2015-01-01_00:16:59 | 0 |
| 2015-01-01_00:17:00 | 0 |
| 2015-01-01_00:17:01 | 0 |
| 2015-01-01_00:17:02 | 3 |
| 2015-01-01_00:17:03 | 6 |
| 2015-01-01_00:17:04 | 12 |
| 2015-01-01_00:17:05 | 15 |
| 2015-01-01_00:17:06 | 18 |
| 2015-01-01_00:17:07 | 26 |
| 2015-01-01_00:17:08 | 33 |
| 2015-01-01_00:17:09 | 37 |
| 2015-01-01_00:17:10 | 42 |
| 2015-01-01_00:17:11 | 50 |
| 2015-01-01_00:17:12 | 56 |
| 2015-01-01_00:17:13 | 59 |
| 2015-01-01_00:17:14 | 62 |
| 2015-01-01_00:17:15 | 67 |
| 2015-01-01_00:17:16 | 73 |
| 2015-01-01_00:17:17 | 78 |
| 2015-01-01_00:17:18 | 78 |
| 2015-01-01_00:17:19 | 80 |
| 2015-01-01_00:17:20 | 82 |
| 2015-01-01_00:17:21 | 87 |
| 2015-01-01_00:17:22 | 89 |
| 2015-01-01_00:17:23 | 90 |
| 2015-01-01_00:17:24 | 91 |
| 2015-01-01_00:17:25 | 92 |
| 2015-01-01_00:17:26 | 92 |
| 2015-01-01_00:17:27 | 90 |
| 2015-01-01_00:17:28 | 90 |
| 2015-01-01_00:17:29 | 90 |
| 2015-01-01_00:17:30 | 90 |
| 2015-01-01_00:17:31 | 90 |
| 2015-01-01_00:17:32 | 91 |
| 2015-01-01_00:17:33 | 91 |
| 2015-01-01_00:17:34 | 90 |
| 2015-01-01_00:17:35 | 90 |
| 2015-01-01_00:17:36 | 90 |
| 2015-01-01_00:17:37 | 90 |
| 2015-01-01_00:17:38 | 91 |
| 2015-01-01_00:17:39 | 90 |
| 2015-01-01_00:17:40 | 90 |
| 2015-01-01_00:17:41 | 91 |
| 2015-01-01_00:17:42 | 90 |
| 2015-01-01_00:17:43 | 90 |
| 2015-01-01_00:17:44 | 90 |
| 2015-01-01_00:17:45 | 91 |
| 2015-01-01_00:17:46 | 90 |
| 2015-01-01_00:17:47 | 91 |
| 2015-01-01_00:17:48 | 90 |
| 2015-01-01_00:17:49 | 90 |
| 2015-01-01_00:17:50 | 91 |
| 2015-01-01_00:17:51 | 90 |
| 2015-01-01_00:17:52 | 90 |
| 2015-01-01_00:17:53 | 91 |
| 2015-01-01_00:17:54 | 90 |
| 2015-01-01_00:17:55 | 90 |
| 2015-01-01_00:17:56 | 91 |
| 2015-01-01_00:17:57 | 90 |
| 2015-01-01_00:17:58 | 90 |
| 2015-01-01_00:17:59 | 91 |
| 2015-01-01_00:18:00 | 90 |
| 2015-01-01_00:18:01 | 91 |
| 2015-01-01_00:18:02 | 90 |
| 2015-01-01_00:18:03 | 90 |
| 2015-01-01_00:18:04 | 90 |
| 2015-01-01_00:18:05 | 91 |
| 2015-01-01_00:18:06 | 90 |
| 2015-01-01_00:18:07 | 90 |
| 2015-01-01_00:18:08 | 90 |
| 2015-01-01_00:18:09 | 91 |
| 2015-01-01_00:18:10 | 90 |
| 2015-01-01_00:18:11 | 91 |
| 2015-01-01_00:18:12 | 90 |
| 2015-01-01_00:18:13 | 90 |
| 2015-01-01_00:18:14 | 91 |
| 2015-01-01_00:18:15 | 90 |
| 2015-01-01_00:18:16 | 90 |
| 2015-01-01_00:18:17 | 91 |
| 2015-01-01_00:18:18 | 90 |
| 2015-01-01_00:18:19 | 90 |
| 2015-01-01_00:18:20 | 90 |
| 2015-01-01_00:18:21 | 91 |
| 2015-01-01_00:18:22 | 90 |
| 2015-01-01_00:18:23 | 90 |
| 2015-01-01_00:18:24 | 91 |
| 2015-01-01_00:18:25 | 90 |
| 2015-01-01_00:18:26 | 89 |
| 2015-01-01_00:18:27 | 87 |
| 2015-01-01_00:18:28 | 88 |
| 2015-01-01_00:18:29 | 87 |
| 2015-01-01_00:18:30 | 88 |
| 2015-01-01_00:18:31 | 89 |
| 2015-01-01_00:18:32 | 90 |
| 2015-01-01_00:18:33 | 90 |
| 2015-01-01_00:18:34 | 89 |
| 2015-01-01_00:18:35 | 90 |
| 2015-01-01_00:18:36 | 91 |
| 2015-01-01_00:18:37 | 90 |
| 2015-01-01_00:18:38 | 91 |
| 2015-01-01_00:18:39 | 91 |
| 2015-01-01_00:18:40 | 90 |
| 2015-01-01_00:18:41 | 91 |
| 2015-01-01_00:18:42 | 90 |
| 2015-01-01_00:18:43 | 91 |
| 2015-01-01_00:18:44 | 90 |
| 2015-01-01_00:18:45 | 90 |
| 2015-01-01_00:18:46 | 91 |
| 2015-01-01_00:18:47 | 90 |
| 2015-01-01_00:18:48 | 91 |
| 2015-01-01_00:18:49 | 90 |
| 2015-01-01_00:18:50 | 91 |
| 2015-01-01_00:18:51 | 90 |
| 2015-01-01_00:18:52 | 91 |
| 2015-01-01_00:18:53 | 90 |
| 2015-01-01_00:18:54 | 91 |
| 2015-01-01_00:18:55 | 90 |
| 2015-01-01_00:18:56 | 90 |
| 2015-01-01_00:18:57 | 91 |
| 2015-01-01_00:18:58 | 90 |
| 2015-01-01_00:18:59 | 91 |
| 2015-01-01_00:19:00 | 90 |
| 2015-01-01_00:19:01 | 90 |
| 2015-01-01_00:19:02 | 90 |
| 2015-01-01_00:19:03 | 91 |
| 2015-01-01_00:19:04 | 90 |
| 2015-01-01_00:19:05 | 89 |
| 2015-01-01_00:19:06 | 87 |
| 2015-01-01_00:19:07 | 85 |
| 2015-01-01_00:19:08 | 83 |
| 2015-01-01_00:19:09 | 81 |
| 2015-01-01_00:19:10 | 80 |
| 2015-01-01_00:19:11 | 78 |
| 2015-01-01_00:19:12 | 76 |
| 2015-01-01_00:19:13 | 74 |
| 2015-01-01_00:19:14 | 73 |
| 2015-01-01_00:19:15 | 71 |
| 2015-01-01_00:19:16 | 70 |
| 2015-01-01_00:19:17 | 68 |
| 2015-01-01_00:19:18 | 67 |
| 2015-01-01_00:19:19 | 65 |
| 2015-01-01_00:19:20 | 64 |
| 2015-01-01_00:19:21 | 64 |
| 2015-01-01_00:19:22 | 65 |
| 2015-01-01_00:19:23 | 68 |
| 2015-01-01_00:19:24 | 69 |
| 2015-01-01_00:19:25 | 72 |
| 2015-01-01_00:19:26 | 74 |
| 2015-01-01_00:19:27 | 75 |
| 2015-01-01_00:19:28 | 76 |
| 2015-01-01_00:19:29 | 79 |
| 2015-01-01_00:19:30 | 79 |
| 2015-01-01_00:19:31 | 81 |
| 2015-01-01_00:19:32 | 82 |
| 2015-01-01_00:19:33 | 84 |
| 2015-01-01_00:19:34 | 84 |
| 2015-01-01_00:19:35 | 85 |
| 2015-01-01_00:19:36 | 86 |
| 2015-01-01_00:19:37 | 86 |
| 2015-01-01_00:19:38 | 86 |
| 2015-01-01_00:19:39 | 86 |
| 2015-01-01_00:19:40 | 86 |
| 2015-01-01_00:19:41 | 86 |
| 2015-01-01_00:19:42 | 86 |
| 2015-01-01_00:19:43 | 85 |
| 2015-01-01_00:19:44 | 82 |
| 2015-01-01_00:19:45 | 80 |
| 2015-01-01_00:19:46 | 78 |
| 2015-01-01_00:19:47 | 76 |
| 2015-01-01_00:19:48 | 76 |
| 2015-01-01_00:19:49 | 76 |
| 2015-01-01_00:19:50 | 75 |
| 2015-01-01_00:19:51 | 74 |
| 2015-01-01_00:19:52 | 73 |
| 2015-01-01_00:19:53 | 72 |
| 2015-01-01_00:19:54 | 70 |
| 2015-01-01_00:19:55 | 69 |
| 2015-01-01_00:19:56 | 66 |
| 2015-01-01_00:19:57 | 64 |
| 2015-01-01_00:19:58 | 64 |
| 2015-01-01_00:19:59 | 64 |
| 2015-01-01_00:20:00 | 64 |
| 2015-01-01_00:20:01 | 64 |
| 2015-01-01_00:20:02 | 64 |
| 2015-01-01_00:20:03 | 64 |
| 2015-01-01_00:20:04 | 64 |
| 2015-01-01_00:20:05 | 65 |
| 2015-01-01_00:20:06 | 65 |
| 2015-01-01_00:20:07 | 64 |
| 2015-01-01_00:20:08 | 66 |
| 2015-01-01_00:20:09 | 68 |
| 2015-01-01_00:20:10 | 69 |
| 2015-01-01_00:20:11 | 71 |
| 2015-01-01_00:20:12 | 73 |
| 2015-01-01_00:20:13 | 77 |
| 2015-01-01_00:20:14 | 81 |
| 2015-01-01_00:20:15 | 84 |
| 2015-01-01_00:20:16 | 88 |
| 2015-01-01_00:20:17 | 91 |
| 2015-01-01_00:20:18 | 91 |
| 2015-01-01_00:20:19 | 92 |
| 2015-01-01_00:20:20 | 93 |
| 2015-01-01_00:20:21 | 93 |
| 2015-01-01_00:20:22 | 92 |
| 2015-01-01_00:20:23 | 92 |
| 2015-01-01_00:20:24 | 92 |
| 2015-01-01_00:20:25 | 93 |
| 2015-01-01_00:20:26 | 92 |
| 2015-01-01_00:20:27 | 90 |
| 2015-01-01_00:20:28 | 89 |
| 2015-01-01_00:20:29 | 86 |
| 2015-01-01_00:20:30 | 85 |
| 2015-01-01_00:20:31 | 82 |
| 2015-01-01_00:20:32 | 81 |
| 2015-01-01_00:20:33 | 79 |
| 2015-01-01_00:20:34 | 78 |
| 2015-01-01_00:20:35 | 78 |
| 2015-01-01_00:20:36 | 76 |
| 2015-01-01_00:20:37 | 74 |
| 2015-01-01_00:20:38 | 74 |
| 2015-01-01_00:20:39 | 74 |
| 2015-01-01_00:20:40 | 74 |
| 2015-01-01_00:20:41 | 75 |
| 2015-01-01_00:20:42 | 76 |
| 2015-01-01_00:20:43 | 76 |
| 2015-01-01_00:20:44 | 75 |
| 2015-01-01_00:20:45 | 75 |
| 2015-01-01_00:20:46 | 74 |
| 2015-01-01_00:20:47 | 74 |
| 2015-01-01_00:20:48 | 75 |
| 2015-01-01_00:20:49 | 77 |
| 2015-01-01_00:20:50 | 77 |
| 2015-01-01_00:20:51 | 79 |
| 2015-01-01_00:20:52 | 78 |
| 2015-01-01_00:20:53 | 78 |
| 2015-01-01_00:20:54 | 78 |
| 2015-01-01_00:20:55 | 80 |
| 2015-01-01_00:20:56 | 81 |
| 2015-01-01_00:20:57 | 80 |
| 2015-01-01_00:20:58 | 79 |
| 2015-01-01_00:20:59 | 80 |
| 2015-01-01_00:21:00 | 81 |
| 2015-01-01_00:21:01 | 80 |
| 2015-01-01_00:21:02 | 81 |
| 2015-01-01_00:21:03 | 82 |
| 2015-01-01_00:21:04 | 82 |
| 2015-01-01_00:21:05 | 83 |
| 2015-01-01_00:21:06 | 84 |
| 2015-01-01_00:21:07 | 83 |
| 2015-01-01_00:21:08 | 84 |
| 2015-01-01_00:21:09 | 84 |
| 2015-01-01_00:21:10 | 85 |
| 2015-01-01_00:21:11 | 85 |
| 2015-01-01_00:21:12 | 84 |
| 2015-01-01_00:21:13 | 84 |
| 2015-01-01_00:21:14 | 84 |
| 2015-01-01_00:21:15 | 85 |
| 2015-01-01_00:21:16 | 86 |
| 2015-01-01_00:21:17 | 87 |
| 2015-01-01_00:21:18 | 89 |
| 2015-01-01_00:21:19 | 91 |
| 2015-01-01_00:21:20 | 93 |
| 2015-01-01_00:21:21 | 99 |
| 2015-01-01_00:21:22 | 102 |
| 2015-01-01_00:21:23 | 109 |
| 2015-01-01_00:21:24 | 110 |
| 2015-01-01_00:21:25 | 111 |
| 2015-01-01_00:21:26 | 108 |
| 2015-01-01_00:21:27 | 108 |
| 2015-01-01_00:21:28 | 106 |
| 2015-01-01_00:21:29 | 105 |
| 2015-01-01_00:21:30 | 101 |
| 2015-01-01_00:21:31 | 99 |
| 2015-01-01_00:21:32 | 96 |
| 2015-01-01_00:21:33 | 95 |
| 2015-01-01_00:21:34 | 92 |
| 2015-01-01_00:21:35 | 90 |
| 2015-01-01_00:21:36 | 89 |
| 2015-01-01_00:21:37 | 89 |
| 2015-01-01_00:21:38 | 90 |
| 2015-01-01_00:21:39 | 90 |
| 2015-01-01_00:21:40 | 90 |
| 2015-01-01_00:21:41 | 90 |
| 2015-01-01_00:21:42 | 90 |
| 2015-01-01_00:21:43 | 89 |
| 2015-01-01_00:21:44 | 90 |
| 2015-01-01_00:21:45 | 90 |
| 2015-01-01_00:21:46 | 90 |
| 2015-01-01_00:21:47 | 90 |
| 2015-01-01_00:21:48 | 90 |
| 2015-01-01_00:21:49 | 90 |
| 2015-01-01_00:21:50 | 90 |
| 2015-01-01_00:21:51 | 90 |
| 2015-01-01_00:21:52 | 90 |
| 2015-01-01_00:21:53 | 90 |
| 2015-01-01_00:21:54 | 90 |
| 2015-01-01_00:21:55 | 90 |
| 2015-01-01_00:21:56 | 90 |
| 2015-01-01_00:21:57 | 90 |
| 2015-01-01_00:21:58 | 90 |
| 2015-01-01_00:21:59 | 90 |
| 2015-01-01_00:22:00 | 90 |
| 2015-01-01_00:22:01 | 90 |
| 2015-01-01_00:22:02 | 90 |
| 2015-01-01_00:22:03 | 90 |
| 2015-01-01_00:22:04 | 89 |
| 2015-01-01_00:22:05 | 90 |
| 2015-01-01_00:22:06 | 90 |
| 2015-01-01_00:22:07 | 90 |
| 2015-01-01_00:22:08 | 90 |
| 2015-01-01_00:22:09 | 90 |
| 2015-01-01_00:22:10 | 90 |
| 2015-01-01_00:22:11 | 89 |
| 2015-01-01_00:22:12 | 90 |
| 2015-01-01_00:22:13 | 90 |
| 2015-01-01_00:22:14 | 90 |
| 2015-01-01_00:22:15 | 90 |
| 2015-01-01_00:22:16 | 91 |
| 2015-01-01_00:22:17 | 90 |
| 2015-01-01_00:22:18 | 90 |
| 2015-01-01_00:22:19 | 90 |
| 2015-01-01_00:22:20 | 90 |
| 2015-01-01_00:22:21 | 90 |
| 2015-01-01_00:22:22 | 89 |
| 2015-01-01_00:22:23 | 90 |
| 2015-01-01_00:22:24 | 89 |
| 2015-01-01_00:22:25 | 90 |
| 2015-01-01_00:22:26 | 90 |
| 2015-01-01_00:22:27 | 90 |
| 2015-01-01_00:22:28 | 90 |
| 2015-01-01_00:22:29 | 90 |
| 2015-01-01_00:22:30 | 90 |
| 2015-01-01_00:22:31 | 90 |
| 2015-01-01_00:22:32 | 90 |
| 2015-01-01_00:22:33 | 90 |
| 2015-01-01_00:22:34 | 90 |
| 2015-01-01_00:22:35 | 90 |
| 2015-01-01_00:22:36 | 90 |
| 2015-01-01_00:22:37 | 91 |
| 2015-01-01_00:22:38 | 90 |
| 2015-01-01_00:22:39 | 90 |
| 2015-01-01_00:22:40 | 90 |
| 2015-01-01_00:22:41 | 90 |
| 2015-01-01_00:22:42 | 90 |
| 2015-01-01_00:22:43 | 90 |
| 2015-01-01_00:22:44 | 89 |
| 2015-01-01_00:22:45 | 90 |
| 2015-01-01_00:22:46 | 90 |
| 2015-01-01_00:22:47 | 90 |
| 2015-01-01_00:22:48 | 89 |
| 2015-01-01_00:22:49 | 90 |
| 2015-01-01_00:22:50 | 90 |
| 2015-01-01_00:22:51 | 91 |
| 2015-01-01_00:22:52 | 89 |
| 2015-01-01_00:22:53 | 90 |
| 2015-01-01_00:22:54 | 90 |
| 2015-01-01_00:22:55 | 90 |
| 2015-01-01_00:22:56 | 90 |
| 2015-01-01_00:22:57 | 90 |
| 2015-01-01_00:22:58 | 90 |
| 2015-01-01_00:22:59 | 89 |
| 2015-01-01_00:23:00 | 90 |
| 2015-01-01_00:23:01 | 90 |
| 2015-01-01_00:23:02 | 90 |
| 2015-01-01_00:23:03 | 90 |
| 2015-01-01_00:23:04 | 90 |
| 2015-01-01_00:23:05 | 90 |
| 2015-01-01_00:23:06 | 90 |
| 2015-01-01_00:23:07 | 89 |
| 2015-01-01_00:23:08 | 90 |
| 2015-01-01_00:23:09 | 90 |
| 2015-01-01_00:23:10 | 90 |
| 2015-01-01_00:23:11 | 90 |
| 2015-01-01_00:23:12 | 90 |
| 2015-01-01_00:23:13 | 90 |
| 2015-01-01_00:23:14 | 90 |
| 2015-01-01_00:23:15 | 90 |
| 2015-01-01_00:23:16 | 90 |
| 2015-01-01_00:23:17 | 90 |
| 2015-01-01_00:23:18 | 90 |
| 2015-01-01_00:23:19 | 90 |
| 2015-01-01_00:23:20 | 90 |
| 2015-01-01_00:23:21 | 90 |
| 2015-01-01_00:23:22 | 90 |
| 2015-01-01_00:23:23 | 90 |
| 2015-01-01_00:23:24 | 90 |
| 2015-01-01_00:23:25 | 90 |
| 2015-01-01_00:23:26 | 90 |
| 2015-01-01_00:23:27 | 90 |
| 2015-01-01_00:23:28 | 90 |
| 2015-01-01_00:23:29 | 91 |
| 2015-01-01_00:23:30 | 89 |
| 2015-01-01_00:23:31 | 90 |
| 2015-01-01_00:23:32 | 90 |
| 2015-01-01_00:23:33 | 90 |
| 2015-01-01_00:23:34 | 90 |
| 2015-01-01_00:23:35 | 89 |
| 2015-01-01_00:23:36 | 90 |
| 2015-01-01_00:23:37 | 90 |
| 2015-01-01_00:23:38 | 90 |
| 2015-01-01_00:23:39 | 90 |
| 2015-01-01_00:23:40 | 90 |
| 2015-01-01_00:23:41 | 90 |
| 2015-01-01_00:23:42 | 90 |
| 2015-01-01_00:23:43 | 90 |
| 2015-01-01_00:23:44 | 90 |
| 2015-01-01_00:23:45 | 90 |
| 2015-01-01_00:23:46 | 90 |
| 2015-01-01_00:23:47 | 90 |
| 2015-01-01_00:23:48 | 90 |
| 2015-01-01_00:23:49 | 90 |
| 2015-01-01_00:23:50 | 90 |
| 2015-01-01_00:23:51 | 89 |
| 2015-01-01_00:23:52 | 90 |
| 2015-01-01_00:23:53 | 91 |
| 2015-01-01_00:23:54 | 90 |
| 2015-01-01_00:23:55 | 90 |
| 2015-01-01_00:23:56 | 90 |
| 2015-01-01_00:23:57 | 90 |
| 2015-01-01_00:23:58 | 90 |
| 2015-01-01_00:23:59 | 89 |
| 2015-01-01_00:24:00 | 90 |
| 2015-01-01_00:24:01 | 91 |
| 2015-01-01_00:24:02 | 89 |
| 2015-01-01_00:24:03 | 90 |
| 2015-01-01_00:24:04 | 90 |
| 2015-01-01_00:24:05 | 90 |
| 2015-01-01_00:24:06 | 90 |
| 2015-01-01_00:24:07 | 90 |
| 2015-01-01_00:24:08 | 90 |
| 2015-01-01_00:24:09 | 90 |
| 2015-01-01_00:24:10 | 89 |
| 2015-01-01_00:24:11 | 90 |
| 2015-01-01_00:24:12 | 90 |
| 2015-01-01_00:24:13 | 90 |
| 2015-01-01_00:24:14 | 90 |
| 2015-01-01_00:24:15 | 90 |
| 2015-01-01_00:24:16 | 90 |
| 2015-01-01_00:24:17 | 90 |
| 2015-01-01_00:24:18 | 90 |
| 2015-01-01_00:24:19 | 90 |
| 2015-01-01_00:24:20 | 89 |
| 2015-01-01_00:24:21 | 91 |
| 2015-01-01_00:24:22 | 90 |
| 2015-01-01_00:24:23 | 90 |
| 2015-01-01_00:24:24 | 90 |
| 2015-01-01_00:24:25 | 90 |
| 2015-01-01_00:24:26 | 90 |
| 2015-01-01_00:24:27 | 90 |
| 2015-01-01_00:24:28 | 90 |
| 2015-01-01_00:24:29 | 90 |
| 2015-01-01_00:24:30 | 89 |
| 2015-01-01_00:24:31 | 90 |
| 2015-01-01_00:24:32 | 90 |
| 2015-01-01_00:24:33 | 90 |
| 2015-01-01_00:24:34 | 90 |
| 2015-01-01_00:24:35 | 90 |
| 2015-01-01_00:24:36 | 89 |
| 2015-01-01_00:24:37 | 91 |
| 2015-01-01_00:24:38 | 89 |
| 2015-01-01_00:24:39 | 90 |
| 2015-01-01_00:24:40 | 90 |
| 2015-01-01_00:24:41 | 90 |
| 2015-01-01_00:24:42 | 90 |
| 2015-01-01_00:24:43 | 90 |
| 2015-01-01_00:24:44 | 90 |
| 2015-01-01_00:24:45 | 90 |
| 2015-01-01_00:24:46 | 90 |
| 2015-01-01_00:24:47 | 90 |
| 2015-01-01_00:24:48 | 90 |
| 2015-01-01_00:24:49 | 90 |
| 2015-01-01_00:24:50 | 90 |
| 2015-01-01_00:24:51 | 90 |
| 2015-01-01_00:24:52 | 90 |
| 2015-01-01_00:24:53 | 90 |
| 2015-01-01_00:24:54 | 90 |
| 2015-01-01_00:24:55 | 90 |
| 2015-01-01_00:24:56 | 90 |
| 2015-01-01_00:24:57 | 90 |
| 2015-01-01_00:24:58 | 90 |
| 2015-01-01_00:24:59 | 90 |
| 2015-01-01_00:25:00 | 89 |
| 2015-01-01_00:25:01 | 90 |
| 2015-01-01_00:25:02 | 90 |
| 2015-01-01_00:25:03 | 90 |
| 2015-01-01_00:25:04 | 90 |
| 2015-01-01_00:25:05 | 90 |
| 2015-01-01_00:25:06 | 90 |
| 2015-01-01_00:25:07 | 89 |
| 2015-01-01_00:25:08 | 90 |
| 2015-01-01_00:25:09 | 91 |
| 2015-01-01_00:25:10 | 90 |
| 2015-01-01_00:25:11 | 90 |
| 2015-01-01_00:25:12 | 90 |
| 2015-01-01_00:25:13 | 90 |
| 2015-01-01_00:25:14 | 90 |
| 2015-01-01_00:25:15 | 89 |
| 2015-01-01_00:25:16 | 90 |
| 2015-01-01_00:25:17 | 90 |
| 2015-01-01_00:25:18 | 90 |
| 2015-01-01_00:25:19 | 89 |
| 2015-01-01_00:25:20 | 90 |
| 2015-01-01_00:25:21 | 90 |
| 2015-01-01_00:25:22 | 90 |
| 2015-01-01_00:25:23 | 90 |
| 2015-01-01_00:25:24 | 90 |
| 2015-01-01_00:25:25 | 90 |
| 2015-01-01_00:25:26 | 90 |
| 2015-01-01_00:25:27 | 89 |
| 2015-01-01_00:25:28 | 90 |
| 2015-01-01_00:25:29 | 90 |
| 2015-01-01_00:25:30 | 90 |
| 2015-01-01_00:25:31 | 90 |
| 2015-01-01_00:25:32 | 90 |
| 2015-01-01_00:25:33 | 91 |
| 2015-01-01_00:25:34 | 89 |
| 2015-01-01_00:25:35 | 90 |
| 2015-01-01_00:25:36 | 90 |
| 2015-01-01_00:25:37 | 90 |
| 2015-01-01_00:25:38 | 90 |
| 2015-01-01_00:25:39 | 90 |
| 2015-01-01_00:25:40 | 90 |
| 2015-01-01_00:25:41 | 90 |
| 2015-01-01_00:25:42 | 90 |
| 2015-01-01_00:25:43 | 90 |
| 2015-01-01_00:25:44 | 90 |
| 2015-01-01_00:25:45 | 90 |
| 2015-01-01_00:25:46 | 90 |
| 2015-01-01_00:25:47 | 90 |
| 2015-01-01_00:25:48 | 90 |
| 2015-01-01_00:25:49 | 90 |
| 2015-01-01_00:25:50 | 90 |
| 2015-01-01_00:25:51 | 90 |
| 2015-01-01_00:25:52 | 90 |
| 2015-01-01_00:25:53 | 90 |
| 2015-01-01_00:25:54 | 90 |
| 2015-01-01_00:25:55 | 89 |
| 2015-01-01_00:25:56 | 90 |
| 2015-01-01_00:25:57 | 90 |
| 2015-01-01_00:25:58 | 90 |
| 2015-01-01_00:25:59 | 90 |
| 2015-01-01_00:26:00 | 90 |
| 2015-01-01_00:26:01 | 90 |
| 2015-01-01_00:26:02 | 90 |
| 2015-01-01_00:26:03 | 90 |
| 2015-01-01_00:26:04 | 89 |
| 2015-01-01_00:26:05 | 90 |
| 2015-01-01_00:26:06 | 90 |
| 2015-01-01_00:26:07 | 90 |
| 2015-01-01_00:26:08 | 90 |
| 2015-01-01_00:26:09 | 90 |
| 2015-01-01_00:26:10 | 90 |
| 2015-01-01_00:26:11 | 90 |
| 2015-01-01_00:26:12 | 90 |
| 2015-01-01_00:26:13 | 90 |
| 2015-01-01_00:26:14 | 90 |
| 2015-01-01_00:26:15 | 90 |
| 2015-01-01_00:26:16 | 90 |
| 2015-01-01_00:26:17 | 90 |
| 2015-01-01_00:26:18 | 90 |
| 2015-01-01_00:26:19 | 89 |
| 2015-01-01_00:26:20 | 90 |
| 2015-01-01_00:26:21 | 90 |
| 2015-01-01_00:26:22 | 90 |
| 2015-01-01_00:26:23 | 90 |
| 2015-01-01_00:26:24 | 90 |
| 2015-01-01_00:26:25 | 90 |
| 2015-01-01_00:26:26 | 90 |
| 2015-01-01_00:26:27 | 90 |
| 2015-01-01_00:26:28 | 90 |
| 2015-01-01_00:26:29 | 90 |
| 2015-01-01_00:26:30 | 90 |
| 2015-01-01_00:26:31 | 90 |
| 2015-01-01_00:26:32 | 90 |
| 2015-01-01_00:26:33 | 91 |
| 2015-01-01_00:26:34 | 90 |
| 2015-01-01_00:26:35 | 89 |
| 2015-01-01_00:26:36 | 90 |
| 2015-01-01_00:26:37 | 90 |
| 2015-01-01_00:26:38 | 90 |
| 2015-01-01_00:26:39 | 90 |
| 2015-01-01_00:26:40 | 90 |
| 2015-01-01_00:26:41 | 90 |
| 2015-01-01_00:26:42 | 90 |
| 2015-01-01_00:26:43 | 89 |
| 2015-01-01_00:26:44 | 90 |
| 2015-01-01_00:26:45 | 90 |
| 2015-01-01_00:26:46 | 90 |
| 2015-01-01_00:26:47 | 90 |
| 2015-01-01_00:26:48 | 90 |
| 2015-01-01_00:26:49 | 90 |
| 2015-01-01_00:26:50 | 90 |
| 2015-01-01_00:26:51 | 90 |
| 2015-01-01_00:26:52 | 90 |
| 2015-01-01_00:26:53 | 90 |
| 2015-01-01_00:26:54 | 90 |
| 2015-01-01_00:26:55 | 90 |
| 2015-01-01_00:26:56 | 90 |
| 2015-01-01_00:26:57 | 90 |
| 2015-01-01_00:26:58 | 90 |
| 2015-01-01_00:26:59 | 90 |
| 2015-01-01_00:27:00 | 90 |
| 2015-01-01_00:27:01 | 90 |
| 2015-01-01_00:27:02 | 89 |
| 2015-01-01_00:27:03 | 90 |
| 2015-01-01_00:27:04 | 90 |
| 2015-01-01_00:27:05 | 90 |
| 2015-01-01_00:27:06 | 89 |
| 2015-01-01_00:27:07 | 90 |
| 2015-01-01_00:27:08 | 90 |
| 2015-01-01_00:27:09 | 90 |
| 2015-01-01_00:27:10 | 90 |
| 2015-01-01_00:27:11 | 90 |
| 2015-01-01_00:27:12 | 90 |
| 2015-01-01_00:27:13 | 90 |
| 2015-01-01_00:27:14 | 90 |
| 2015-01-01_00:27:15 | 90 |
| 2015-01-01_00:27:16 | 90 |
| 2015-01-01_00:27:17 | 90 |
| 2015-01-01_00:27:18 | 91 |
| 2015-01-01_00:27:19 | 93 |
| 2015-01-01_00:27:20 | 96 |
| 2015-01-01_00:27:21 | 100 |
| 2015-01-01_00:27:22 | 101 |
| 2015-01-01_00:27:23 | 101 |
| 2015-01-01_00:27:24 | 99 |
| 2015-01-01_00:27:25 | 98 |
| 2015-01-01_00:27:26 | 95 |
| 2015-01-01_00:27:27 | 94 |
| 2015-01-01_00:27:28 | 92 |
| 2015-01-01_00:27:29 | 91 |
| 2015-01-01_00:27:30 | 90 |
| 2015-01-01_00:27:31 | 90 |
| 2015-01-01_00:27:32 | 89 |
| 2015-01-01_00:27:33 | 91 |
| 2015-01-01_00:27:34 | 89 |
| 2015-01-01_00:27:35 | 90 |
| 2015-01-01_00:27:36 | 90 |
| 2015-01-01_00:27:37 | 90 |
| 2015-01-01_00:27:38 | 90 |
| 2015-01-01_00:27:39 | 89 |
| 2015-01-01_00:27:40 | 87 |
| 2015-01-01_00:27:41 | 86 |
| 2015-01-01_00:27:42 | 85 |
| 2015-01-01_00:27:43 | 83 |
| 2015-01-01_00:27:44 | 83 |
| 2015-01-01_00:27:45 | 82 |
| 2015-01-01_00:27:46 | 80 |
| 2015-01-01_00:27:47 | 81 |
| 2015-01-01_00:27:48 | 79 |
| 2015-01-01_00:27:49 | 78 |
| 2015-01-01_00:27:50 | 77 |
| 2015-01-01_00:27:51 | 77 |
| 2015-01-01_00:27:52 | 75 |
| 2015-01-01_00:27:53 | 75 |
| 2015-01-01_00:27:54 | 74 |
| 2015-01-01_00:27:55 | 72 |
| 2015-01-01_00:27:56 | 72 |
| 2015-01-01_00:27:57 | 71 |
| 2015-01-01_00:27:58 | 70 |
| 2015-01-01_00:27:59 | 67 |
| 2015-01-01_00:28:00 | 67 |
| 2015-01-01_00:28:01 | 66 |
| 2015-01-01_00:28:02 | 63 |
| 2015-01-01_00:28:03 | 63 |
| 2015-01-01_00:28:04 | 62 |
| 2015-01-01_00:28:05 | 60 |
| 2015-01-01_00:28:06 | 60 |
| 2015-01-01_00:28:07 | 58 |
| 2015-01-01_00:28:08 | 57 |
| 2015-01-01_00:28:09 | 56 |
| 2015-01-01_00:28:10 | 54 |
| 2015-01-01_00:28:11 | 50 |
| 2015-01-01_00:28:12 | 43 |
| 2015-01-01_00:28:13 | 37 |
| 2015-01-01_00:28:14 | 32 |
| 2015-01-01_00:28:15 | 25 |
| 2015-01-01_00:28:16 | 19 |
| 2015-01-01_00:28:17 | 15 |
| 2015-01-01_00:28:18 | 12 |
| 2015-01-01_00:28:19 | 10 |
| 2015-01-01_00:28:20 | 7 |
| 2015-01-01_00:28:21 | 4 |
| 2015-01-01_00:28:22 | 3 |
| 2015-01-01_00:28:23 | 1 |
| 2015-01-01_00:28:24 | 0 |
| 2015-01-01_00:28:25 | 3 |
| 2015-01-01_00:28:26 | 9 |
| 2015-01-01_00:28:27 | 15 |
| 2015-01-01_00:28:28 | 18 |
| 2015-01-01_00:28:29 | 20 |
| 2015-01-01_00:28:30 | 25 |
| 2015-01-01_00:28:31 | 32 |
| 2015-01-01_00:28:32 | 35 |
| 2015-01-01_00:28:33 | 36 |
| 2015-01-01_00:28:34 | 41 |
| 2015-01-01_00:28:35 | 45 |
| 2015-01-01_00:28:36 | 49 |
| 2015-01-01_00:28:37 | 52 |
| 2015-01-01_00:28:38 | 55 |
| 2015-01-01_00:28:39 | 54 |
| 2015-01-01_00:28:40 | 56 |
| 2015-01-01_00:28:41 | 59 |
| 2015-01-01_00:28:42 | 62 |
| 2015-01-01_00:28:43 | 64 |
| 2015-01-01_00:28:44 | 67 |
| 2015-01-01_00:28:45 | 69 |
| 2015-01-01_00:28:46 | 72 |
| 2015-01-01_00:28:47 | 73 |
| 2015-01-01_00:28:48 | 74 |
| 2015-01-01_00:28:49 | 73 |
| 2015-01-01_00:28:50 | 75 |
| 2015-01-01_00:28:51 | 77 |
| 2015-01-01_00:28:52 | 79 |
| 2015-01-01_00:28:53 | 81 |
| 2015-01-01_00:28:54 | 81 |
| 2015-01-01_00:28:55 | 80 |
| 2015-01-01_00:28:56 | 80 |
| 2015-01-01_00:28:57 | 80 |
| 2015-01-01_00:28:58 | 81 |
| 2015-01-01_00:28:59 | 84 |
| 2015-01-01_00:29:00 | 85 |
| 2015-01-01_00:29:01 | 85 |
| 2015-01-01_00:29:02 | 86 |
| 2015-01-01_00:29:03 | 86 |
| 2015-01-01_00:29:04 | 86 |
| 2015-01-01_00:29:05 | 86 |
| 2015-01-01_00:29:06 | 85 |
| 2015-01-01_00:29:07 | 85 |
| 2015-01-01_00:29:08 | 84 |
| 2015-01-01_00:29:09 | 84 |
| 2015-01-01_00:29:10 | 83 |
| 2015-01-01_00:29:11 | 81 |
| 2015-01-01_00:29:12 | 80 |
| 2015-01-01_00:29:13 | 79 |
| 2015-01-01_00:29:14 | 79 |
| 2015-01-01_00:29:15 | 78 |
| 2015-01-01_00:29:16 | 77 |
| 2015-01-01_00:29:17 | 77 |
| 2015-01-01_00:29:18 | 77 |
| 2015-01-01_00:29:19 | 75 |
| 2015-01-01_00:29:20 | 74 |
| 2015-01-01_00:29:21 | 74 |
| 2015-01-01_00:29:22 | 75 |
| 2015-01-01_00:29:23 | 74 |
| 2015-01-01_00:29:24 | 74 |
| 2015-01-01_00:29:25 | 75 |
| 2015-01-01_00:29:26 | 73 |
| 2015-01-01_00:29:27 | 73 |
| 2015-01-01_00:29:28 | 71 |
| 2015-01-01_00:29:29 | 70 |
| 2015-01-01_00:29:30 | 68 |
| 2015-01-01_00:29:31 | 66 |
| 2015-01-01_00:29:32 | 64 |
| 2015-01-01_00:29:33 | 60 |
| 2015-01-01_00:29:34 | 59 |
| 2015-01-01_00:29:35 | 59 |
| 2015-01-01_00:29:36 | 59 |
| 2015-01-01_00:29:37 | 58 |
| 2015-01-01_00:29:38 | 60 |
| 2015-01-01_00:29:39 | 63 |
| 2015-01-01_00:29:40 | 63 |
| 2015-01-01_00:29:41 | 63 |
| 2015-01-01_00:29:42 | 65 |
| 2015-01-01_00:29:43 | 65 |
| 2015-01-01_00:29:44 | 63 |
| 2015-01-01_00:29:45 | 64 |
| 2015-01-01_00:29:46 | 64 |
| 2015-01-01_00:29:47 | 66 |
| 2015-01-01_00:29:48 | 65 |
| 2015-01-01_00:29:49 | 64 |
| 2015-01-01_00:29:50 | 64 |
| 2015-01-01_00:29:51 | 64 |
| 2015-01-01_00:29:52 | 64 |
| 2015-01-01_00:29:53 | 66 |
| 2015-01-01_00:29:54 | 65 |
| 2015-01-01_00:29:55 | 66 |
| 2015-01-01_00:29:56 | 64 |
| 2015-01-01_00:29:57 | 64 |
| 2015-01-01_00:29:58 | 63 |
| 2015-01-01_00:29:59 | 61 |
| 2015-01-01_00:30:00 | 60 |
| 2015-01-01_00:30:01 | 59 |
| 2015-01-01_00:30:02 | 57 |
| 2015-01-01_00:30:03 | 54 |
| 2015-01-01_00:30:04 | 54 |
| 2015-01-01_00:30:05 | 54 |
| 2015-01-01_00:30:06 | 54 |
| 2015-01-01_00:30:07 | 55 |
| 2015-01-01_00:30:08 | 55 |
| 2015-01-01_00:30:09 | 56 |
| 2015-01-01_00:30:10 | 58 |
| 2015-01-01_00:30:11 | 60 |
| 2015-01-01_00:30:12 | 62 |
| 2015-01-01_00:30:13 | 64 |
| 2015-01-01_00:30:14 | 66 |
| 2015-01-01_00:30:15 | 67 |
| 2015-01-01_00:30:16 | 67 |
| 2015-01-01_00:30:17 | 68 |
| 2015-01-01_00:30:18 | 67 |
| 2015-01-01_00:30:19 | 67 |
| 2015-01-01_00:30:20 | 66 |
| 2015-01-01_00:30:21 | 70 |
| 2015-01-01_00:30:22 | 76 |
| 2015-01-01_00:30:23 | 83 |
| 2015-01-01_00:30:24 | 91 |
| 2015-01-01_00:30:25 | 98 |
| 2015-01-01_00:30:26 | 98 |
| 2015-01-01_00:30:27 | 98 |
| 2015-01-01_00:30:28 | 99 |
| 2015-01-01_00:30:29 | 97 |
| 2015-01-01_00:30:30 | 96 |
| 2015-01-01_00:30:31 | 96 |
| 2015-01-01_00:30:32 | 96 |
| 2015-01-01_00:30:33 | 97 |
| 2015-01-01_00:30:34 | 97 |
| 2015-01-01_00:30:35 | 97 |
| 2015-01-01_00:30:36 | 97 |
| 2015-01-01_00:30:37 | 97 |
| 2015-01-01_00:30:38 | 98 |
| 2015-01-01_00:30:39 | 98 |
| 2015-01-01_00:30:40 | 98 |
| 2015-01-01_00:30:41 | 100 |
| 2015-01-01_00:30:42 | 99 |
| 2015-01-01_00:30:43 | 100 |
| 2015-01-01_00:30:44 | 100 |
| 2015-01-01_00:30:45 | 101 |
| 2015-01-01_00:30:46 | 101 |
| 2015-01-01_00:30:47 | 100 |
| 2015-01-01_00:30:48 | 100 |
| 2015-01-01_00:30:49 | 97 |
| 2015-01-01_00:30:50 | 95 |
| 2015-01-01_00:30:51 | 93 |
| 2015-01-01_00:30:52 | 90 |
| 2015-01-01_00:30:53 | 88 |
| 2015-01-01_00:30:54 | 82 |
| 2015-01-01_00:30:55 | 76 |
| 2015-01-01_00:30:56 | 66 |
| 2015-01-01_00:30:57 | 56 |
| 2015-01-01_00:30:58 | 50 |
| 2015-01-01_00:30:59 | 47 |
| 2015-01-01_00:31:00 | 52 |
| 2015-01-01_00:31:01 | 59 |
| 2015-01-01_00:31:02 | 62 |
| 2015-01-01_00:31:03 | 65 |
| 2015-01-01_00:31:04 | 71 |
| 2015-01-01_00:31:05 | 77 |
| 2015-01-01_00:31:06 | 81 |
| 2015-01-01_00:31:07 | 81 |
| 2015-01-01_00:31:08 | 83 |
| 2015-01-01_00:31:09 | 86 |
| 2015-01-01_00:31:10 | 90 |
| 2015-01-01_00:31:11 | 88 |
| 2015-01-01_00:31:12 | 89 |
| 2015-01-01_00:31:13 | 88 |
| 2015-01-01_00:31:14 | 89 |
| 2015-01-01_00:31:15 | 88 |
| 2015-01-01_00:31:16 | 88 |
| 2015-01-01_00:31:17 | 89 |
| 2015-01-01_00:31:18 | 89 |
| 2015-01-01_00:31:19 | 90 |
| 2015-01-01_00:31:20 | 89 |
| 2015-01-01_00:31:21 | 89 |
| 2015-01-01_00:31:22 | 88 |
| 2015-01-01_00:31:23 | 89 |
| 2015-01-01_00:31:24 | 90 |
| 2015-01-01_00:31:25 | 90 |
| 2015-01-01_00:31:26 | 89 |
| 2015-01-01_00:31:27 | 90 |
| 2015-01-01_00:31:28 | 89 |
| 2015-01-01_00:31:29 | 90 |
| 2015-01-01_00:31:30 | 89 |
| 2015-01-01_00:31:31 | 90 |
| 2015-01-01_00:31:32 | 89 |
| 2015-01-01_00:31:33 | 90 |
| 2015-01-01_00:31:34 | 89 |
| 2015-01-01_00:31:35 | 90 |
| 2015-01-01_00:31:36 | 89 |
| 2015-01-01_00:31:37 | 90 |
| 2015-01-01_00:31:38 | 89 |
| 2015-01-01_00:31:39 | 90 |
| 2015-01-01_00:31:40 | 89 |
| 2015-01-01_00:31:41 | 90 |
| 2015-01-01_00:31:42 | 89 |
| 2015-01-01_00:31:43 | 89 |
| 2015-01-01_00:31:44 | 90 |
| 2015-01-01_00:31:45 | 90 |
| 2015-01-01_00:31:46 | 89 |
| 2015-01-01_00:31:47 | 90 |
| 2015-01-01_00:31:48 | 89 |
| 2015-01-01_00:31:49 | 90 |
| 2015-01-01_00:31:50 | 89 |
| 2015-01-01_00:31:51 | 89 |
| 2015-01-01_00:31:52 | 90 |
| 2015-01-01_00:31:53 | 90 |
| 2015-01-01_00:31:54 | 89 |
| 2015-01-01_00:31:55 | 89 |
| 2015-01-01_00:31:56 | 90 |
| 2015-01-01_00:31:57 | 89 |
| 2015-01-01_00:31:58 | 90 |
| 2015-01-01_00:31:59 | 90 |
| 2015-01-01_00:32:00 | 89 |
| 2015-01-01_00:32:01 | 90 |
| 2015-01-01_00:32:02 | 89 |
| 2015-01-01_00:32:03 | 90 |
| 2015-01-01_00:32:04 | 89 |
| 2015-01-01_00:32:05 | 90 |
| 2015-01-01_00:32:06 | 89 |
| 2015-01-01_00:32:07 | 89 |
| 2015-01-01_00:32:08 | 90 |
| 2015-01-01_00:32:09 | 89 |
| 2015-01-01_00:32:10 | 90 |
| 2015-01-01_00:32:11 | 89 |
| 2015-01-01_00:32:12 | 90 |
| 2015-01-01_00:32:13 | 89 |
| 2015-01-01_00:32:14 | 89 |
| 2015-01-01_00:32:15 | 89 |
| 2015-01-01_00:32:16 | 90 |
| 2015-01-01_00:32:17 | 89 |
| 2015-01-01_00:32:18 | 90 |
| 2015-01-01_00:32:19 | 89 |
| 2015-01-01_00:32:20 | 90 |
| 2015-01-01_00:32:21 | 89 |
| 2015-01-01_00:32:22 | 90 |
| 2015-01-01_00:32:23 | 89 |
| 2015-01-01_00:32:24 | 90 |
| 2015-01-01_00:32:25 | 89 |
| 2015-01-01_00:32:26 | 90 |
| 2015-01-01_00:32:27 | 89 |
| 2015-01-01_00:32:28 | 90 |
| 2015-01-01_00:32:29 | 89 |
| 2015-01-01_00:32:30 | 90 |
| 2015-01-01_00:32:31 | 89 |
| 2015-01-01_00:32:32 | 89 |
| 2015-01-01_00:32:33 | 90 |
| 2015-01-01_00:32:34 | 89 |
| 2015-01-01_00:32:35 | 90 |
| 2015-01-01_00:32:36 | 89 |
| 2015-01-01_00:32:37 | 90 |
| 2015-01-01_00:32:38 | 89 |
| 2015-01-01_00:32:39 | 90 |
| 2015-01-01_00:32:40 | 89 |
| 2015-01-01_00:32:41 | 90 |
| 2015-01-01_00:32:42 | 89 |
| 2015-01-01_00:32:43 | 90 |
| 2015-01-01_00:32:44 | 89 |
| 2015-01-01_00:32:45 | 90 |
| 2015-01-01_00:32:46 | 90 |
| 2015-01-01_00:32:47 | 89 |
| 2015-01-01_00:32:48 | 89 |
| 2015-01-01_00:32:49 | 90 |
| 2015-01-01_00:32:50 | 90 |
| 2015-01-01_00:32:51 | 89 |
| 2015-01-01_00:32:52 | 89 |
| 2015-01-01_00:32:53 | 90 |
| 2015-01-01_00:32:54 | 90 |
| 2015-01-01_00:32:55 | 89 |
| 2015-01-01_00:32:56 | 89 |
| 2015-01-01_00:32:57 | 90 |
| 2015-01-01_00:32:58 | 89 |
| 2015-01-01_00:32:59 | 90 |
| 2015-01-01_00:33:00 | 89 |
| 2015-01-01_00:33:01 | 90 |
| 2015-01-01_00:33:02 | 90 |
| 2015-01-01_00:33:03 | 89 |
| 2015-01-01_00:33:04 | 89 |
| 2015-01-01_00:33:05 | 90 |
| 2015-01-01_00:33:06 | 90 |
| 2015-01-01_00:33:07 | 89 |
| 2015-01-01_00:33:08 | 90 |
| 2015-01-01_00:33:09 | 89 |
| 2015-01-01_00:33:10 | 90 |
| 2015-01-01_00:33:11 | 89 |
| 2015-01-01_00:33:12 | 89 |
| 2015-01-01_00:33:13 | 90 |
| 2015-01-01_00:33:14 | 90 |
| 2015-01-01_00:33:15 | 89 |
| 2015-01-01_00:33:16 | 89 |
| 2015-01-01_00:33:17 | 90 |
| 2015-01-01_00:33:18 | 89 |
| 2015-01-01_00:33:19 | 90 |
| 2015-01-01_00:33:20 | 89 |
| 2015-01-01_00:33:21 | 90 |
| 2015-01-01_00:33:22 | 89 |
| 2015-01-01_00:33:23 | 90 |
| 2015-01-01_00:33:24 | 89 |
| 2015-01-01_00:33:25 | 90 |
| 2015-01-01_00:33:26 | 89 |
| 2015-01-01_00:33:27 | 89 |
| 2015-01-01_00:33:28 | 90 |
| 2015-01-01_00:33:29 | 89 |
| 2015-01-01_00:33:30 | 90 |
| 2015-01-01_00:33:31 | 89 |
| 2015-01-01_00:33:32 | 89 |
| 2015-01-01_00:33:33 | 90 |
| 2015-01-01_00:33:34 | 89 |
| 2015-01-01_00:33:35 | 90 |
| 2015-01-01_00:33:36 | 89 |
| 2015-01-01_00:33:37 | 90 |
| 2015-01-01_00:33:38 | 89 |
| 2015-01-01_00:33:39 | 90 |
| 2015-01-01_00:33:40 | 89 |
| 2015-01-01_00:33:41 | 90 |
| 2015-01-01_00:33:42 | 89 |
| 2015-01-01_00:33:43 | 89 |
| 2015-01-01_00:33:44 | 90 |
| 2015-01-01_00:33:45 | 89 |
| 2015-01-01_00:33:46 | 90 |
| 2015-01-01_00:33:47 | 89 |
| 2015-01-01_00:33:48 | 90 |
| 2015-01-01_00:33:49 | 89 |
| 2015-01-01_00:33:50 | 90 |
| 2015-01-01_00:33:51 | 89 |
| 2015-01-01_00:33:52 | 90 |
| 2015-01-01_00:33:53 | 89 |
| 2015-01-01_00:33:54 | 90 |
| 2015-01-01_00:33:55 | 89 |
| 2015-01-01_00:33:56 | 90 |
| 2015-01-01_00:33:57 | 89 |
| 2015-01-01_00:33:58 | 89 |
| 2015-01-01_00:33:59 | 90 |
| 2015-01-01_00:34:00 | 89 |
| 2015-01-01_00:34:01 | 90 |
| 2015-01-01_00:34:02 | 90 |
| 2015-01-01_00:34:03 | 89 |
| 2015-01-01_00:34:04 | 90 |
| 2015-01-01_00:34:05 | 89 |
| 2015-01-01_00:34:06 | 89 |
| 2015-01-01_00:34:07 | 85 |
| 2015-01-01_00:34:08 | 81 |
| 2015-01-01_00:34:09 | 78 |
| 2015-01-01_00:34:10 | 76 |
| 2015-01-01_00:34:11 | 76 |
| 2015-01-01_00:34:12 | 77 |
| 2015-01-01_00:34:13 | 78 |
| 2015-01-01_00:34:14 | 81 |
| 2015-01-01_00:34:15 | 82 |
| 2015-01-01_00:34:16 | 84 |
| 2015-01-01_00:34:17 | 87 |
| 2015-01-01_00:34:18 | 87 |
| 2015-01-01_00:34:19 | 89 |
| 2015-01-01_00:34:20 | 89 |
| 2015-01-01_00:34:21 | 89 |
| 2015-01-01_00:34:22 | 88 |
| 2015-01-01_00:34:23 | 87 |
| 2015-01-01_00:34:24 | 87 |
| 2015-01-01_00:34:25 | 87 |
| 2015-01-01_00:34:26 | 86 |
| 2015-01-01_00:34:27 | 85 |
| 2015-01-01_00:34:28 | 85 |
| 2015-01-01_00:34:29 | 83 |
| 2015-01-01_00:34:30 | 82 |
| 2015-01-01_00:34:31 | 81 |
| 2015-01-01_00:34:32 | 80 |
| 2015-01-01_00:34:33 | 80 |
| 2015-01-01_00:34:34 | 80 |
| 2015-01-01_00:34:35 | 80 |
| 2015-01-01_00:34:36 | 81 |
| 2015-01-01_00:34:37 | 81 |
| 2015-01-01_00:34:38 | 80 |
| 2015-01-01_00:34:39 | 81 |
| 2015-01-01_00:34:40 | 80 |
| 2015-01-01_00:34:41 | 82 |
| 2015-01-01_00:34:42 | 82 |
| 2015-01-01_00:34:43 | 84 |
| 2015-01-01_00:34:44 | 85 |
| 2015-01-01_00:34:45 | 86 |
| 2015-01-01_00:34:46 | 85 |
| 2015-01-01_00:34:47 | 86 |
| 2015-01-01_00:34:48 | 83 |
| 2015-01-01_00:34:49 | 83 |
| 2015-01-01_00:34:50 | 81 |
| 2015-01-01_00:34:51 | 80 |
| 2015-01-01_00:34:52 | 78 |
| 2015-01-01_00:34:53 | 78 |
| 2015-01-01_00:34:54 | 76 |
| 2015-01-01_00:34:55 | 75 |
| 2015-01-01_00:34:56 | 76 |
| 2015-01-01_00:34:57 | 75 |
| 2015-01-01_00:34:58 | 75 |
| 2015-01-01_00:34:59 | 79 |
| 2015-01-01_00:35:00 | 82 |
| 2015-01-01_00:35:01 | 85 |
| 2015-01-01_00:35:02 | 87 |
| 2015-01-01_00:35:03 | 87 |
| 2015-01-01_00:35:04 | 88 |
| 2015-01-01_00:35:05 | 91 |
| 2015-01-01_00:35:06 | 89 |
| 2015-01-01_00:35:07 | 90 |
| 2015-01-01_00:35:08 | 91 |
| 2015-01-01_00:35:09 | 89 |
| 2015-01-01_00:35:10 | 89 |
| 2015-01-01_00:35:11 | 88 |
| 2015-01-01_00:35:12 | 87 |
| 2015-01-01_00:35:13 | 87 |
| 2015-01-01_00:35:14 | 86 |
| 2015-01-01_00:35:15 | 86 |
| 2015-01-01_00:35:16 | 85 |
| 2015-01-01_00:35:17 | 85 |
| 2015-01-01_00:35:18 | 86 |
| 2015-01-01_00:35:19 | 85 |
| 2015-01-01_00:35:20 | 83 |
| 2015-01-01_00:35:21 | 83 |
| 2015-01-01_00:35:22 | 82 |
| 2015-01-01_00:35:23 | 81 |
| 2015-01-01_00:35:24 | 79 |
| 2015-01-01_00:35:25 | 77 |
| 2015-01-01_00:35:26 | 74 |
| 2015-01-01_00:35:27 | 66 |
| 2015-01-01_00:35:28 | 63 |
| 2015-01-01_00:35:29 | 61 |
| 2015-01-01_00:35:30 | 59 |
| 2015-01-01_00:35:31 | 56 |
| 2015-01-01_00:35:32 | 54 |
| 2015-01-01_00:35:33 | 53 |
| 2015-01-01_00:35:34 | 55 |
| 2015-01-01_00:35:35 | 57 |
| 2015-01-01_00:35:36 | 55 |
| 2015-01-01_00:35:37 | 56 |
| 2015-01-01_00:35:38 | 59 |
| 2015-01-01_00:35:39 | 62 |
| 2015-01-01_00:35:40 | 66 |
| 2015-01-01_00:35:41 | 70 |
| 2015-01-01_00:35:42 | 73 |
| 2015-01-01_00:35:43 | 74 |
| 2015-01-01_00:35:44 | 75 |
| 2015-01-01_00:35:45 | 79 |
| 2015-01-01_00:35:46 | 81 |
| 2015-01-01_00:35:47 | 84 |
| 2015-01-01_00:35:48 | 87 |
| 2015-01-01_00:35:49 | 90 |
| 2015-01-01_00:35:50 | 92 |
| 2015-01-01_00:35:51 | 92 |
| 2015-01-01_00:35:52 | 93 |
| 2015-01-01_00:35:53 | 96 |
| 2015-01-01_00:35:54 | 99 |
| 2015-01-01_00:35:55 | 101 |
| 2015-01-01_00:35:56 | 104 |
| 2015-01-01_00:35:57 | 102 |
| 2015-01-01_00:35:58 | 101 |
| 2015-01-01_00:35:59 | 98 |
| 2015-01-01_00:36:00 | 97 |
| 2015-01-01_00:36:01 | 98 |
| 2015-01-01_00:36:02 | 97 |
| 2015-01-01_00:36:03 | 98 |
| 2015-01-01_00:36:04 | 98 |
| 2015-01-01_00:36:05 | 100 |
| 2015-01-01_00:36:06 | 99 |
| 2015-01-01_00:36:07 | 100 |
| 2015-01-01_00:36:08 | 100 |
| 2015-01-01_00:36:09 | 100 |
| 2015-01-01_00:36:10 | 101 |
| 2015-01-01_00:36:11 | 100 |
| 2015-01-01_00:36:12 | 100 |
| 2015-01-01_00:36:13 | 100 |
| 2015-01-01_00:36:14 | 100 |
| 2015-01-01_00:36:15 | 100 |
| 2015-01-01_00:36:16 | 100 |
| 2015-01-01_00:36:17 | 101 |
| 2015-01-01_00:36:18 | 100 |
| 2015-01-01_00:36:19 | 100 |
| 2015-01-01_00:36:20 | 100 |
| 2015-01-01_00:36:21 | 100 |
| 2015-01-01_00:36:22 | 100 |
| 2015-01-01_00:36:23 | 100 |
| 2015-01-01_00:36:24 | 100 |
| 2015-01-01_00:36:25 | 101 |
| 2015-01-01_00:36:26 | 100 |
| 2015-01-01_00:36:27 | 100 |
| 2015-01-01_00:36:28 | 100 |
| 2015-01-01_00:36:29 | 100 |
| 2015-01-01_00:36:30 | 100 |
| 2015-01-01_00:36:31 | 100 |
| 2015-01-01_00:36:32 | 100 |
| 2015-01-01_00:36:33 | 101 |
| 2015-01-01_00:36:34 | 100 |
| 2015-01-01_00:36:35 | 100 |
| 2015-01-01_00:36:36 | 100 |
| 2015-01-01_00:36:37 | 100 |
| 2015-01-01_00:36:38 | 100 |
| 2015-01-01_00:36:39 | 100 |
| 2015-01-01_00:36:40 | 100 |
| 2015-01-01_00:36:41 | 101 |
| 2015-01-01_00:36:42 | 100 |
| 2015-01-01_00:36:43 | 100 |
| 2015-01-01_00:36:44 | 100 |
| 2015-01-01_00:36:45 | 100 |
| 2015-01-01_00:36:46 | 100 |
| 2015-01-01_00:36:47 | 100 |
| 2015-01-01_00:36:48 | 100 |
| 2015-01-01_00:36:49 | 101 |
| 2015-01-01_00:36:50 | 100 |
| 2015-01-01_00:36:51 | 100 |
| 2015-01-01_00:36:52 | 100 |
| 2015-01-01_00:36:53 | 100 |
| 2015-01-01_00:36:54 | 100 |
| 2015-01-01_00:36:55 | 100 |
| 2015-01-01_00:36:56 | 100 |
| 2015-01-01_00:36:57 | 101 |
| 2015-01-01_00:36:58 | 100 |
| 2015-01-01_00:36:59 | 100 |
| 2015-01-01_00:37:00 | 100 |
| 2015-01-01_00:37:01 | 101 |
| 2015-01-01_00:37:02 | 100 |
| 2015-01-01_00:37:03 | 100 |
| 2015-01-01_00:37:04 | 100 |
| 2015-01-01_00:37:05 | 100 |
| 2015-01-01_00:37:06 | 100 |
| 2015-01-01_00:37:07 | 100 |
| 2015-01-01_00:37:08 | 100 |
| 2015-01-01_00:37:09 | 101 |
| 2015-01-01_00:37:10 | 100 |
| 2015-01-01_00:37:11 | 99 |
| 2015-01-01_00:37:12 | 100 |
| 2015-01-01_00:37:13 | 101 |
| 2015-01-01_00:37:14 | 100 |
| 2015-01-01_00:37:15 | 100 |
| 2015-01-01_00:37:16 | 100 |
| 2015-01-01_00:37:17 | 100 |
| 2015-01-01_00:37:18 | 100 |
| 2015-01-01_00:37:19 | 100 |
| 2015-01-01_00:37:20 | 100 |
| 2015-01-01_00:37:21 | 101 |
| 2015-01-01_00:37:22 | 100 |
| 2015-01-01_00:37:23 | 100 |
| 2015-01-01_00:37:24 | 100 |
| 2015-01-01_00:37:25 | 100 |
| 2015-01-01_00:37:26 | 100 |
| 2015-01-01_00:37:27 | 100 |
| 2015-01-01_00:37:28 | 100 |
| 2015-01-01_00:37:29 | 101 |
| 2015-01-01_00:37:30 | 100 |
| 2015-01-01_00:37:31 | 100 |
| 2015-01-01_00:37:32 | 100 |
| 2015-01-01_00:37:33 | 100 |
| 2015-01-01_00:37:34 | 100 |
| 2015-01-01_00:37:35 | 100 |
| 2015-01-01_00:37:36 | 100 |
| 2015-01-01_00:37:37 | 101 |
| 2015-01-01_00:37:38 | 100 |
| 2015-01-01_00:37:39 | 100 |
| 2015-01-01_00:37:40 | 100 |
| 2015-01-01_00:37:41 | 100 |
| 2015-01-01_00:37:42 | 100 |
| 2015-01-01_00:37:43 | 100 |
| 2015-01-01_00:37:44 | 100 |
| 2015-01-01_00:37:45 | 101 |
| 2015-01-01_00:37:46 | 100 |
| 2015-01-01_00:37:47 | 100 |
| 2015-01-01_00:37:48 | 100 |
| 2015-01-01_00:37:49 | 100 |
| 2015-01-01_00:37:50 | 100 |
| 2015-01-01_00:37:51 | 100 |
| 2015-01-01_00:37:52 | 100 |
| 2015-01-01_00:37:53 | 101 |
| 2015-01-01_00:37:54 | 100 |
| 2015-01-01_00:37:55 | 100 |
| 2015-01-01_00:37:56 | 100 |
| 2015-01-01_00:37:57 | 100 |
| 2015-01-01_00:37:58 | 100 |
| 2015-01-01_00:37:59 | 100 |
| 2015-01-01_00:38:00 | 100 |
| 2015-01-01_00:38:01 | 101 |
| 2015-01-01_00:38:02 | 100 |
| 2015-01-01_00:38:03 | 100 |
| 2015-01-01_00:38:04 | 100 |
| 2015-01-01_00:38:05 | 100 |
| 2015-01-01_00:38:06 | 100 |
| 2015-01-01_00:38:07 | 100 |
| 2015-01-01_00:38:08 | 100 |
| 2015-01-01_00:38:09 | 101 |
| 2015-01-01_00:38:10 | 100 |
| 2015-01-01_00:38:11 | 100 |
| 2015-01-01_00:38:12 | 100 |
| 2015-01-01_00:38:13 | 100 |
| 2015-01-01_00:38:14 | 100 |
| 2015-01-01_00:38:15 | 100 |
| 2015-01-01_00:38:16 | 100 |
| 2015-01-01_00:38:17 | 100 |
| 2015-01-01_00:38:18 | 100 |
| 2015-01-01_00:38:19 | 100 |
| 2015-01-01_00:38:20 | 101 |
| 2015-01-01_00:38:21 | 100 |
| 2015-01-01_00:38:22 | 100 |
| 2015-01-01_00:38:23 | 101 |
| 2015-01-01_00:38:24 | 100 |
| 2015-01-01_00:38:25 | 100 |
| 2015-01-01_00:38:26 | 101 |
| 2015-01-01_00:38:27 | 100 |
| 2015-01-01_00:38:28 | 100 |
| 2015-01-01_00:38:29 | 100 |
| 2015-01-01_00:38:30 | 100 |
| 2015-01-01_00:38:31 | 100 |
| 2015-01-01_00:38:32 | 100 |
| 2015-01-01_00:38:33 | 100 |
| 2015-01-01_00:38:34 | 100 |
| 2015-01-01_00:38:35 | 100 |
| 2015-01-01_00:38:36 | 100 |
| 2015-01-01_00:38:37 | 101 |
| 2015-01-01_00:38:38 | 100 |
| 2015-01-01_00:38:39 | 100 |
| 2015-01-01_00:38:40 | 100 |
| 2015-01-01_00:38:41 | 100 |
| 2015-01-01_00:38:42 | 100 |
| 2015-01-01_00:38:43 | 100 |
| 2015-01-01_00:38:44 | 100 |
| 2015-01-01_00:38:45 | 100 |
| 2015-01-01_00:38:46 | 100 |
| 2015-01-01_00:38:47 | 101 |
| 2015-01-01_00:38:48 | 100 |
| 2015-01-01_00:38:49 | 100 |
| 2015-01-01_00:38:50 | 100 |
| 2015-01-01_00:38:51 | 100 |
| 2015-01-01_00:38:52 | 100 |
| 2015-01-01_00:38:53 | 100 |
| 2015-01-01_00:38:54 | 100 |
| 2015-01-01_00:38:55 | 100 |
| 2015-01-01_00:38:56 | 100 |
| 2015-01-01_00:38:57 | 100 |
| 2015-01-01_00:38:58 | 100 |
| 2015-01-01_00:38:59 | 100 |
| 2015-01-01_00:39:00 | 100 |
| 2015-01-01_00:39:01 | 101 |
| 2015-01-01_00:39:02 | 100 |
| 2015-01-01_00:39:03 | 100 |
| 2015-01-01_00:39:04 | 100 |
| 2015-01-01_00:39:05 | 101 |
| 2015-01-01_00:39:06 | 100 |
| 2015-01-01_00:39:07 | 100 |
| 2015-01-01_00:39:08 | 100 |
| 2015-01-01_00:39:09 | 101 |
| 2015-01-01_00:39:10 | 100 |
| 2015-01-01_00:39:11 | 100 |
| 2015-01-01_00:39:12 | 100 |
| 2015-01-01_00:39:13 | 100 |
| 2015-01-01_00:39:14 | 100 |
| 2015-01-01_00:39:15 | 100 |
| 2015-01-01_00:39:16 | 100 |
| 2015-01-01_00:39:17 | 101 |
| 2015-01-01_00:39:18 | 100 |
| 2015-01-01_00:39:19 | 99 |
| 2015-01-01_00:39:20 | 100 |
| 2015-01-01_00:39:21 | 101 |
| 2015-01-01_00:39:22 | 100 |
| 2015-01-01_00:39:23 | 100 |
| 2015-01-01_00:39:24 | 100 |
| 2015-01-01_00:39:25 | 100 |
| 2015-01-01_00:39:26 | 100 |
| 2015-01-01_00:39:27 | 100 |
| 2015-01-01_00:39:28 | 100 |
| 2015-01-01_00:39:29 | 101 |
| 2015-01-01_00:39:30 | 100 |
| 2015-01-01_00:39:31 | 100 |
| 2015-01-01_00:39:32 | 100 |
| 2015-01-01_00:39:33 | 100 |
| 2015-01-01_00:39:34 | 100 |
| 2015-01-01_00:39:35 | 100 |
| 2015-01-01_00:39:36 | 100 |
| 2015-01-01_00:39:37 | 101 |
| 2015-01-01_00:39:38 | 100 |
| 2015-01-01_00:39:39 | 100 |
| 2015-01-01_00:39:40 | 100 |
| 2015-01-01_00:39:41 | 100 |
| 2015-01-01_00:39:42 | 100 |
| 2015-01-01_00:39:43 | 100 |
| 2015-01-01_00:39:44 | 100 |
| 2015-01-01_00:39:45 | 101 |
| 2015-01-01_00:39:46 | 100 |
| 2015-01-01_00:39:47 | 100 |
| 2015-01-01_00:39:48 | 100 |
| 2015-01-01_00:39:49 | 100 |
| 2015-01-01_00:39:50 | 100 |
| 2015-01-01_00:39:51 | 100 |
| 2015-01-01_00:39:52 | 100 |
| 2015-01-01_00:39:53 | 101 |
| 2015-01-01_00:39:54 | 100 |
| 2015-01-01_00:39:55 | 100 |
| 2015-01-01_00:39:56 | 100 |
| 2015-01-01_00:39:57 | 100 |
| 2015-01-01_00:39:58 | 100 |
| 2015-01-01_00:39:59 | 100 |
| 2015-01-01_00:40:00 | 100 |
| 2015-01-01_00:40:01 | 101 |
| 2015-01-01_00:40:02 | 100 |
| 2015-01-01_00:40:03 | 100 |
| 2015-01-01_00:40:04 | 100 |
| 2015-01-01_00:40:05 | 100 |
| 2015-01-01_00:40:06 | 100 |
| 2015-01-01_00:40:07 | 100 |
| 2015-01-01_00:40:08 | 100 |
| 2015-01-01_00:40:09 | 100 |
| 2015-01-01_00:40:10 | 101 |
| 2015-01-01_00:40:11 | 100 |
| 2015-01-01_00:40:12 | 100 |
| 2015-01-01_00:40:13 | 100 |
| 2015-01-01_00:40:14 | 100 |
| 2015-01-01_00:40:15 | 100 |
| 2015-01-01_00:40:16 | 100 |
| 2015-01-01_00:40:17 | 101 |
| 2015-01-01_00:40:18 | 100 |
| 2015-01-01_00:40:19 | 100 |
| 2015-01-01_00:40:20 | 100 |
| 2015-01-01_00:40:21 | 100 |
| 2015-01-01_00:40:22 | 100 |
| 2015-01-01_00:40:23 | 100 |
| 2015-01-01_00:40:24 | 100 |
| 2015-01-01_00:40:25 | 101 |
| 2015-01-01_00:40:26 | 100 |
| 2015-01-01_00:40:27 | 100 |
| 2015-01-01_00:40:28 | 100 |
| 2015-01-01_00:40:29 | 100 |
| 2015-01-01_00:40:30 | 100 |
| 2015-01-01_00:40:31 | 100 |
| 2015-01-01_00:40:32 | 100 |
| 2015-01-01_00:40:33 | 101 |
| 2015-01-01_00:40:34 | 100 |
| 2015-01-01_00:40:35 | 100 |
| 2015-01-01_00:40:36 | 100 |
| 2015-01-01_00:40:37 | 100 |
| 2015-01-01_00:40:38 | 100 |
| 2015-01-01_00:40:39 | 100 |
| 2015-01-01_00:40:40 | 100 |
| 2015-01-01_00:40:41 | 101 |
| 2015-01-01_00:40:42 | 100 |
| 2015-01-01_00:40:43 | 100 |
| 2015-01-01_00:40:44 | 100 |
| 2015-01-01_00:40:45 | 100 |
| 2015-01-01_00:40:46 | 100 |
| 2015-01-01_00:40:47 | 100 |
| 2015-01-01_00:40:48 | 100 |
| 2015-01-01_00:40:49 | 101 |
| 2015-01-01_00:40:50 | 100 |
| 2015-01-01_00:40:51 | 100 |
| 2015-01-01_00:40:52 | 100 |
| 2015-01-01_00:40:53 | 100 |
| 2015-01-01_00:40:54 | 100 |
| 2015-01-01_00:40:55 | 100 |
| 2015-01-01_00:40:56 | 100 |
| 2015-01-01_00:40:57 | 101 |
| 2015-01-01_00:40:58 | 100 |
| 2015-01-01_00:40:59 | 100 |
| 2015-01-01_00:41:00 | 100 |
| 2015-01-01_00:41:01 | 100 |
| 2015-01-01_00:41:02 | 100 |
| 2015-01-01_00:41:03 | 100 |
| 2015-01-01_00:41:04 | 100 |
| 2015-01-01_00:41:05 | 101 |
| 2015-01-01_00:41:06 | 100 |
| 2015-01-01_00:41:07 | 100 |
| 2015-01-01_00:41:08 | 100 |
| 2015-01-01_00:41:09 | 100 |
| 2015-01-01_00:41:10 | 100 |
| 2015-01-01_00:41:11 | 100 |
| 2015-01-01_00:41:12 | 100 |
| 2015-01-01_00:41:13 | 101 |
| 2015-01-01_00:41:14 | 100 |
| 2015-01-01_00:41:15 | 100 |
| 2015-01-01_00:41:16 | 100 |
| 2015-01-01_00:41:17 | 100 |
| 2015-01-01_00:41:18 | 100 |
| 2015-01-01_00:41:19 | 100 |
| 2015-01-01_00:41:20 | 100 |
| 2015-01-01_00:41:21 | 101 |
| 2015-01-01_00:41:22 | 100 |
| 2015-01-01_00:41:23 | 100 |
| 2015-01-01_00:41:24 | 100 |
| 2015-01-01_00:41:25 | 101 |
| 2015-01-01_00:41:26 | 100 |
| 2015-01-01_00:41:27 | 100 |
| 2015-01-01_00:41:28 | 100 |
| 2015-01-01_00:41:29 | 100 |
| 2015-01-01_00:41:30 | 100 |
| 2015-01-01_00:41:31 | 100 |
| 2015-01-01_00:41:32 | 100 |
| 2015-01-01_00:41:33 | 101 |
| 2015-01-01_00:41:34 | 100 |
| 2015-01-01_00:41:35 | 100 |
| 2015-01-01_00:41:36 | 100 |
| 2015-01-01_00:41:37 | 100 |
| 2015-01-01_00:41:38 | 100 |
| 2015-01-01_00:41:39 | 100 |
| 2015-01-01_00:41:40 | 100 |
| 2015-01-01_00:41:41 | 101 |
| 2015-01-01_00:41:42 | 100 |
| 2015-01-01_00:41:43 | 100 |
| 2015-01-01_00:41:44 | 100 |
| 2015-01-01_00:41:45 | 100 |
| 2015-01-01_00:41:46 | 100 |
| 2015-01-01_00:41:47 | 101 |
| 2015-01-01_00:41:48 | 100 |
| 2015-01-01_00:41:49 | 100 |
| 2015-01-01_00:41:50 | 100 |
| 2015-01-01_00:41:51 | 100 |
| 2015-01-01_00:41:52 | 100 |
| 2015-01-01_00:41:53 | 100 |
| 2015-01-01_00:41:54 | 101 |
| 2015-01-01_00:41:55 | 99 |
| 2015-01-01_00:41:56 | 100 |
| 2015-01-01_00:41:57 | 101 |
| 2015-01-01_00:41:58 | 100 |
| 2015-01-01_00:41:59 | 100 |
| 2015-01-01_00:42:00 | 100 |
| 2015-01-01_00:42:01 | 100 |
| 2015-01-01_00:42:02 | 100 |
| 2015-01-01_00:42:03 | 100 |
| 2015-01-01_00:42:04 | 100 |
| 2015-01-01_00:42:05 | 101 |
| 2015-01-01_00:42:06 | 100 |
| 2015-01-01_00:42:07 | 100 |
| 2015-01-01_00:42:08 | 100 |
| 2015-01-01_00:42:09 | 100 |
| 2015-01-01_00:42:10 | 100 |
| 2015-01-01_00:42:11 | 100 |
| 2015-01-01_00:42:12 | 100 |
| 2015-01-01_00:42:13 | 101 |
| 2015-01-01_00:42:14 | 100 |
| 2015-01-01_00:42:15 | 100 |
| 2015-01-01_00:42:16 | 100 |
| 2015-01-01_00:42:17 | 100 |
| 2015-01-01_00:42:18 | 100 |
| 2015-01-01_00:42:19 | 100 |
| 2015-01-01_00:42:20 | 100 |
| 2015-01-01_00:42:21 | 100 |
| 2015-01-01_00:42:22 | 100 |
| 2015-01-01_00:42:23 | 100 |
| 2015-01-01_00:42:24 | 100 |
| 2015-01-01_00:42:25 | 100 |
| 2015-01-01_00:42:26 | 100 |
| 2015-01-01_00:42:27 | 100 |
| 2015-01-01_00:42:28 | 100 |
| 2015-01-01_00:42:29 | 101 |
| 2015-01-01_00:42:30 | 100 |
| 2015-01-01_00:42:31 | 100 |
| 2015-01-01_00:42:32 | 100 |
| 2015-01-01_00:42:33 | 101 |
| 2015-01-01_00:42:34 | 100 |
| 2015-01-01_00:42:35 | 100 |
| 2015-01-01_00:42:36 | 101 |
| 2015-01-01_00:42:37 | 100 |
| 2015-01-01_00:42:38 | 100 |
| 2015-01-01_00:42:39 | 101 |
| 2015-01-01_00:42:40 | 100 |
| 2015-01-01_00:42:41 | 100 |
| 2015-01-01_00:42:42 | 100 |
| 2015-01-01_00:42:43 | 101 |
| 2015-01-01_00:42:44 | 100 |
| 2015-01-01_00:42:45 | 100 |
| 2015-01-01_00:42:46 | 100 |
| 2015-01-01_00:42:47 | 100 |
| 2015-01-01_00:42:48 | 100 |
| 2015-01-01_00:42:49 | 100 |
| 2015-01-01_00:42:50 | 100 |
| 2015-01-01_00:42:51 | 100 |
| 2015-01-01_00:42:52 | 100 |
| 2015-01-01_00:42:53 | 100 |
| 2015-01-01_00:42:54 | 100 |
| 2015-01-01_00:42:55 | 100 |
| 2015-01-01_00:42:56 | 100 |
| 2015-01-01_00:42:57 | 101 |
| 2015-01-01_00:42:58 | 100 |
| 2015-01-01_00:42:59 | 100 |
| 2015-01-01_00:43:00 | 100 |
| 2015-01-01_00:43:01 | 100 |
| 2015-01-01_00:43:02 | 99 |
| 2015-01-01_00:43:03 | 98 |
| 2015-01-01_00:43:04 | 92 |
| 2015-01-01_00:43:05 | 87 |
| 2015-01-01_00:43:06 | 83 |
| 2015-01-01_00:43:07 | 77 |
| 2015-01-01_00:43:08 | 73 |
| 2015-01-01_00:43:09 | 69 |
| 2015-01-01_00:43:10 | 64 |
| 2015-01-01_00:43:11 | 62 |
| 2015-01-01_00:43:12 | 61 |
| 2015-01-01_00:43:13 | 61 |
| 2015-01-01_00:43:14 | 61 |
| 2015-01-01_00:43:15 | 61 |
| 2015-01-01_00:43:16 | 62 |
| 2015-01-01_00:43:17 | 62 |
| 2015-01-01_00:43:18 | 63 |
| 2015-01-01_00:43:19 | 64 |
| 2015-01-01_00:43:20 | 65 |
| 2015-01-01_00:43:21 | 69 |
| 2015-01-01_00:43:22 | 70 |
| 2015-01-01_00:43:23 | 75 |
| 2015-01-01_00:43:24 | 76 |
| 2015-01-01_00:43:25 | 75 |
| 2015-01-01_00:43:26 | 75 |
| 2015-01-01_00:43:27 | 75 |
| 2015-01-01_00:43:28 | 75 |
| 2015-01-01_00:43:29 | 77 |
| 2015-01-01_00:43:30 | 79 |
| 2015-01-01_00:43:31 | 78 |
| 2015-01-01_00:43:32 | 79 |
| 2015-01-01_00:43:33 | 79 |
| 2015-01-01_00:43:34 | 79 |
| 2015-01-01_00:43:35 | 81 |
| 2015-01-01_00:43:36 | 80 |
| 2015-01-01_00:43:37 | 80 |
| 2015-01-01_00:43:38 | 78 |
| 2015-01-01_00:43:39 | 76 |
| 2015-01-01_00:43:40 | 75 |
| 2015-01-01_00:43:41 | 73 |
| 2015-01-01_00:43:42 | 71 |
| 2015-01-01_00:43:43 | 70 |
| 2015-01-01_00:43:44 | 70 |
| 2015-01-01_00:43:45 | 70 |
| 2015-01-01_00:43:46 | 70 |
| 2015-01-01_00:43:47 | 72 |
| 2015-01-01_00:43:48 | 72 |
| 2015-01-01_00:43:49 | 73 |
| 2015-01-01_00:43:50 | 73 |
| 2015-01-01_00:43:51 | 74 |
| 2015-01-01_00:43:52 | 75 |
| 2015-01-01_00:43:53 | 76 |
| 2015-01-01_00:43:54 | 78 |
| 2015-01-01_00:43:55 | 79 |
| 2015-01-01_00:43:56 | 80 |
| 2015-01-01_00:43:57 | 81 |
| 2015-01-01_00:43:58 | 80 |
| 2015-01-01_00:43:59 | 80 |
| 2015-01-01_00:44:00 | 79 |
| 2015-01-01_00:44:01 | 79 |
| 2015-01-01_00:44:02 | 80 |
| 2015-01-01_00:44:03 | 80 |
| 2015-01-01_00:44:04 | 81 |
| 2015-01-01_00:44:05 | 81 |
| 2015-01-01_00:44:06 | 83 |
| 2015-01-01_00:44:07 | 84 |
| 2015-01-01_00:44:08 | 84 |
| 2015-01-01_00:44:09 | 86 |
| 2015-01-01_00:44:10 | 84 |
| 2015-01-01_00:44:11 | 82 |
| 2015-01-01_00:44:12 | 81 |
| 2015-01-01_00:44:13 | 82 |
| 2015-01-01_00:44:14 | 81 |
| 2015-01-01_00:44:15 | 82 |
| 2015-01-01_00:44:16 | 83 |
| 2015-01-01_00:44:17 | 83 |
| 2015-01-01_00:44:18 | 83 |
| 2015-01-01_00:44:19 | 83 |
| 2015-01-01_00:44:20 | 83 |
| 2015-01-01_00:44:21 | 84 |
| 2015-01-01_00:44:22 | 84 |
| 2015-01-01_00:44:23 | 86 |
| 2015-01-01_00:44:24 | 87 |
| 2015-01-01_00:44:25 | 88 |
| 2015-01-01_00:44:26 | 89 |
| 2015-01-01_00:44:27 | 89 |
| 2015-01-01_00:44:28 | 88 |
| 2015-01-01_00:44:29 | 88 |
| 2015-01-01_00:44:30 | 87 |
| 2015-01-01_00:44:31 | 85 |
| 2015-01-01_00:44:32 | 86 |
| 2015-01-01_00:44:33 | 86 |
| 2015-01-01_00:44:34 | 86 |
| 2015-01-01_00:44:35 | 87 |
| 2015-01-01_00:44:36 | 86 |
| 2015-01-01_00:44:37 | 87 |
| 2015-01-01_00:44:38 | 85 |
| 2015-01-01_00:44:39 | 83 |
| 2015-01-01_00:44:40 | 81 |
| 2015-01-01_00:44:41 | 81 |
| 2015-01-01_00:44:42 | 79 |
| 2015-01-01_00:44:43 | 77 |
| 2015-01-01_00:44:44 | 77 |
| 2015-01-01_00:44:45 | 78 |
| 2015-01-01_00:44:46 | 77 |
| 2015-01-01_00:44:47 | 79 |
| 2015-01-01_00:44:48 | 80 |
| 2015-01-01_00:44:49 | 81 |
| 2015-01-01_00:44:50 | 83 |
| 2015-01-01_00:44:51 | 82 |
| 2015-01-01_00:44:52 | 82 |
| 2015-01-01_00:44:53 | 81 |
| 2015-01-01_00:44:54 | 82 |
| 2015-01-01_00:44:55 | 80 |
| 2015-01-01_00:44:56 | 79 |
| 2015-01-01_00:44:57 | 79 |
| 2015-01-01_00:44:58 | 78 |
| 2015-01-01_00:44:59 | 79 |
| 2015-01-01_00:45:00 | 78 |
| 2015-01-01_00:45:01 | 77 |
| 2015-01-01_00:45:02 | 75 |
| 2015-01-01_00:45:03 | 75 |
| 2015-01-01_00:45:04 | 75 |
| 2015-01-01_00:45:05 | 75 |
| 2015-01-01_00:45:06 | 75 |
| 2015-01-01_00:45:07 | 73 |
| 2015-01-01_00:45:08 | 72 |
| 2015-01-01_00:45:09 | 71 |
| 2015-01-01_00:45:10 | 70 |
| 2015-01-01_00:45:11 | 69 |
| 2015-01-01_00:45:12 | 68 |
| 2015-01-01_00:45:13 | 67 |
| 2015-01-01_00:45:14 | 65 |
| 2015-01-01_00:45:15 | 66 |
| 2015-01-01_00:45:16 | 66 |
| 2015-01-01_00:45:17 | 68 |
| 2015-01-01_00:45:18 | 68 |
| 2015-01-01_00:45:19 | 70 |
| 2015-01-01_00:45:20 | 71 |
| 2015-01-01_00:45:21 | 72 |
| 2015-01-01_00:45:22 | 72 |
| 2015-01-01_00:45:23 | 72 |
| 2015-01-01_00:45:24 | 72 |
| 2015-01-01_00:45:25 | 73 |
| 2015-01-01_00:45:26 | 74 |
| 2015-01-01_00:45:27 | 75 |
| 2015-01-01_00:45:28 | 77 |
| 2015-01-01_00:45:29 | 76 |
| 2015-01-01_00:45:30 | 77 |
| 2015-01-01_00:45:31 | 78 |
| 2015-01-01_00:45:32 | 79 |
| 2015-01-01_00:45:33 | 79 |
| 2015-01-01_00:45:34 | 80 |
| 2015-01-01_00:45:35 | 80 |
| 2015-01-01_00:45:36 | 80 |
| 2015-01-01_00:45:37 | 82 |
| 2015-01-01_00:45:38 | 83 |
| 2015-01-01_00:45:39 | 84 |
| 2015-01-01_00:45:40 | 85 |
| 2015-01-01_00:45:41 | 86 |
| 2015-01-01_00:45:42 | 87 |
| 2015-01-01_00:45:43 | 88 |
| 2015-01-01_00:45:44 | 88 |
| 2015-01-01_00:45:45 | 89 |
| 2015-01-01_00:45:46 | 89 |
| 2015-01-01_00:45:47 | 90 |
| 2015-01-01_00:45:48 | 90 |
| 2015-01-01_00:45:49 | 90 |
| 2015-01-01_00:45:50 | 90 |
| 2015-01-01_00:45:51 | 89 |
| 2015-01-01_00:45:52 | 89 |
| 2015-01-01_00:45:53 | 90 |
| 2015-01-01_00:45:54 | 90 |
| 2015-01-01_00:45:55 | 90 |
| 2015-01-01_00:45:56 | 89 |
| 2015-01-01_00:45:57 | 90 |
| 2015-01-01_00:45:58 | 90 |
| 2015-01-01_00:45:59 | 90 |
| 2015-01-01_00:46:00 | 89 |
| 2015-01-01_00:46:01 | 90 |
| 2015-01-01_00:46:02 | 90 |
| 2015-01-01_00:46:03 | 90 |
| 2015-01-01_00:46:04 | 90 |
| 2015-01-01_00:46:05 | 90 |
| 2015-01-01_00:46:06 | 89 |
| 2015-01-01_00:46:07 | 90 |
| 2015-01-01_00:46:08 | 90 |
| 2015-01-01_00:46:09 | 90 |
| 2015-01-01_00:46:10 | 90 |
| 2015-01-01_00:46:11 | 89 |
| 2015-01-01_00:46:12 | 90 |
| 2015-01-01_00:46:13 | 90 |
| 2015-01-01_00:46:14 | 89 |
| 2015-01-01_00:46:15 | 90 |
| 2015-01-01_00:46:16 | 90 |
| 2015-01-01_00:46:17 | 90 |
| 2015-01-01_00:46:18 | 90 |
| 2015-01-01_00:46:19 | 90 |
| 2015-01-01_00:46:20 | 89 |
| 2015-01-01_00:46:21 | 89 |
| 2015-01-01_00:46:22 | 86 |
| 2015-01-01_00:46:23 | 85 |
| 2015-01-01_00:46:24 | 83 |
| 2015-01-01_00:46:25 | 82 |
| 2015-01-01_00:46:26 | 80 |
| 2015-01-01_00:46:27 | 80 |
| 2015-01-01_00:46:28 | 78 |
| 2015-01-01_00:46:29 | 77 |
| 2015-01-01_00:46:30 | 76 |
| 2015-01-01_00:46:31 | 75 |
| 2015-01-01_00:46:32 | 74 |
| 2015-01-01_00:46:33 | 72 |
| 2015-01-01_00:46:34 | 69 |
| 2015-01-01_00:46:35 | 63 |
| 2015-01-01_00:46:36 | 61 |
| 2015-01-01_00:46:37 | 60 |
| 2015-01-01_00:46:38 | 59 |
| 2015-01-01_00:46:39 | 57 |
| 2015-01-01_00:46:40 | 57 |
| 2015-01-01_00:46:41 | 56 |
| 2015-01-01_00:46:42 | 54 |
| 2015-01-01_00:46:43 | 53 |
| 2015-01-01_00:46:44 | 51 |
| 2015-01-01_00:46:45 | 50 |
| 2015-01-01_00:46:46 | 50 |
| 2015-01-01_00:46:47 | 50 |
| 2015-01-01_00:46:48 | 52 |
| 2015-01-01_00:46:49 | 56 |
| 2015-01-01_00:46:50 | 59 |
| 2015-01-01_00:46:51 | 62 |
| 2015-01-01_00:46:52 | 65 |
| 2015-01-01_00:46:53 | 69 |
| 2015-01-01_00:46:54 | 70 |
| 2015-01-01_00:46:55 | 70 |
| 2015-01-01_00:46:56 | 71 |
| 2015-01-01_00:46:57 | 72 |
| 2015-01-01_00:46:58 | 71 |
| 2015-01-01_00:46:59 | 72 |
| 2015-01-01_00:47:00 | 70 |
| 2015-01-01_00:47:01 | 69 |
| 2015-01-01_00:47:02 | 68 |
| 2015-01-01_00:47:03 | 65 |
| 2015-01-01_00:47:04 | 64 |
| 2015-01-01_00:47:05 | 63 |
| 2015-01-01_00:47:06 | 63 |
| 2015-01-01_00:47:07 | 64 |
| 2015-01-01_00:47:08 | 66 |
| 2015-01-01_00:47:09 | 67 |
| 2015-01-01_00:47:10 | 67 |
| 2015-01-01_00:47:11 | 68 |
| 2015-01-01_00:47:12 | 69 |
| 2015-01-01_00:47:13 | 73 |
| 2015-01-01_00:47:14 | 75 |
| 2015-01-01_00:47:15 | 76 |
| 2015-01-01_00:47:16 | 79 |
| 2015-01-01_00:47:17 | 82 |
| 2015-01-01_00:47:18 | 82 |
| 2015-01-01_00:47:19 | 81 |
| 2015-01-01_00:47:20 | 80 |
| 2015-01-01_00:47:21 | 79 |
| 2015-01-01_00:47:22 | 78 |
| 2015-01-01_00:47:23 | 78 |
| 2015-01-01_00:47:24 | 76 |
| 2015-01-01_00:47:25 | 76 |
| 2015-01-01_00:47:26 | 76 |
| 2015-01-01_00:47:27 | 76 |
| 2015-01-01_00:47:28 | 76 |
| 2015-01-01_00:47:29 | 76 |
| 2015-01-01_00:47:30 | 76 |
| 2015-01-01_00:47:31 | 76 |
| 2015-01-01_00:47:32 | 77 |
| 2015-01-01_00:47:33 | 79 |
| 2015-01-01_00:47:34 | 80 |
| 2015-01-01_00:47:35 | 81 |
| 2015-01-01_00:47:36 | 83 |
| 2015-01-01_00:47:37 | 85 |
| 2015-01-01_00:47:38 | 84 |
| 2015-01-01_00:47:39 | 85 |
| 2015-01-01_00:47:40 | 84 |
| 2015-01-01_00:47:41 | 83 |
| 2015-01-01_00:47:42 | 81 |
| 2015-01-01_00:47:43 | 79 |
| 2015-01-01_00:47:44 | 77 |
| 2015-01-01_00:47:45 | 76 |
| 2015-01-01_00:47:46 | 74 |
| 2015-01-01_00:47:47 | 74 |
| 2015-01-01_00:47:48 | 74 |
| 2015-01-01_00:47:49 | 74 |
| 2015-01-01_00:47:50 | 75 |
| 2015-01-01_00:47:51 | 74 |
| 2015-01-01_00:47:52 | 73 |
| 2015-01-01_00:47:53 | 72 |
| 2015-01-01_00:47:54 | 71 |
| 2015-01-01_00:47:55 | 71 |
| 2015-01-01_00:47:56 | 71 |
| 2015-01-01_00:47:57 | 70 |
| 2015-01-01_00:47:58 | 70 |
| 2015-01-01_00:47:59 | 70 |
| 2015-01-01_00:48:00 | 69 |
| 2015-01-01_00:48:01 | 70 |
| 2015-01-01_00:48:02 | 71 |
| 2015-01-01_00:48:03 | 71 |
| 2015-01-01_00:48:04 | 74 |
| 2015-01-01_00:48:05 | 75 |
| 2015-01-01_00:48:06 | 74 |
| 2015-01-01_00:48:07 | 74 |
| 2015-01-01_00:48:08 | 75 |
| 2015-01-01_00:48:09 | 76 |
| 2015-01-01_00:48:10 | 74 |
| 2015-01-01_00:48:11 | 73 |
| 2015-01-01_00:48:12 | 73 |
| 2015-01-01_00:48:13 | 73 |
| 2015-01-01_00:48:14 | 73 |
| 2015-01-01_00:48:15 | 71 |
| 2015-01-01_00:48:16 | 71 |
| 2015-01-01_00:48:17 | 73 |
| 2015-01-01_00:48:18 | 73 |
| 2015-01-01_00:48:19 | 72 |
| 2015-01-01_00:48:20 | 72 |
| 2015-01-01_00:48:21 | 70 |
| 2015-01-01_00:48:22 | 70 |
| 2015-01-01_00:48:23 | 70 |
| 2015-01-01_00:48:24 | 70 |
| 2015-01-01_00:48:25 | 70 |
| 2015-01-01_00:48:26 | 70 |
| 2015-01-01_00:48:27 | 71 |
| 2015-01-01_00:48:28 | 70 |
| 2015-01-01_00:48:29 | 70 |
| 2015-01-01_00:48:30 | 69 |
| 2015-01-01_00:48:31 | 68 |
| 2015-01-01_00:48:32 | 68 |
| 2015-01-01_00:48:33 | 69 |
| 2015-01-01_00:48:34 | 70 |
| 2015-01-01_00:48:35 | 71 |
| 2015-01-01_00:48:36 | 69 |
| 2015-01-01_00:48:37 | 69 |
| 2015-01-01_00:48:38 | 70 |
| 2015-01-01_00:48:39 | 73 |
| 2015-01-01_00:48:40 | 75 |
| 2015-01-01_00:48:41 | 76 |
| 2015-01-01_00:48:42 | 75 |
| 2015-01-01_00:48:43 | 75 |
| 2015-01-01_00:48:44 | 77 |
| 2015-01-01_00:48:45 | 80 |
| 2015-01-01_00:48:46 | 81 |
| 2015-01-01_00:48:47 | 82 |
| 2015-01-01_00:48:48 | 84 |
| 2015-01-01_00:48:49 | 86 |
| 2015-01-01_00:48:50 | 86 |
| 2015-01-01_00:48:51 | 88 |
| 2015-01-01_00:48:52 | 87 |
| 2015-01-01_00:48:53 | 86 |
| 2015-01-01_00:48:54 | 84 |
| 2015-01-01_00:48:55 | 82 |
| 2015-01-01_00:48:56 | 83 |
| 2015-01-01_00:48:57 | 83 |
| 2015-01-01_00:48:58 | 84 |
| 2015-01-01_00:48:59 | 83 |
| 2015-01-01_00:49:00 | 84 |
| 2015-01-01_00:49:01 | 84 |
| 2015-01-01_00:49:02 | 85 |
| 2015-01-01_00:49:03 | 85 |
| 2015-01-01_00:49:04 | 87 |
| 2015-01-01_00:49:05 | 87 |
| 2015-01-01_00:49:06 | 88 |
| 2015-01-01_00:49:07 | 89 |
| 2015-01-01_00:49:08 | 91 |
| 2015-01-01_00:49:09 | 92 |
| 2015-01-01_00:49:10 | 92 |
| 2015-01-01_00:49:11 | 94 |
| 2015-01-01_00:49:12 | 94 |
| 2015-01-01_00:49:13 | 93 |
| 2015-01-01_00:49:14 | 93 |
| 2015-01-01_00:49:15 | 93 |
| 2015-01-01_00:49:16 | 94 |
| 2015-01-01_00:49:17 | 94 |
| 2015-01-01_00:49:18 | 94 |
| 2015-01-01_00:49:19 | 93 |
| 2015-01-01_00:49:20 | 92 |
| 2015-01-01_00:49:21 | 92 |
| 2015-01-01_00:49:22 | 91 |
| 2015-01-01_00:49:23 | 91 |
| 2015-01-01_00:49:24 | 89 |
| 2015-01-01_00:49:25 | 88 |
| 2015-01-01_00:49:26 | 87 |
| 2015-01-01_00:49:27 | 88 |
| 2015-01-01_00:49:28 | 87 |
| 2015-01-01_00:49:29 | 88 |
| 2015-01-01_00:49:30 | 88 |
| 2015-01-01_00:49:31 | 90 |
| 2015-01-01_00:49:32 | 89 |
| 2015-01-01_00:49:33 | 90 |
| 2015-01-01_00:49:34 | 90 |
| 2015-01-01_00:49:35 | 89 |
| 2015-01-01_00:49:36 | 89 |
| 2015-01-01_00:49:37 | 90 |
| 2015-01-01_00:49:38 | 89 |
| 2015-01-01_00:49:39 | 90 |
| 2015-01-01_00:49:40 | 90 |
| 2015-01-01_00:49:41 | 91 |
| 2015-01-01_00:49:42 | 91 |
| 2015-01-01_00:49:43 | 91 |
| 2015-01-01_00:49:44 | 91 |
| 2015-01-01_00:49:45 | 92 |
| 2015-01-01_00:49:46 | 91 |
| 2015-01-01_00:49:47 | 92 |
| 2015-01-01_00:49:48 | 92 |
| 2015-01-01_00:49:49 | 93 |
| 2015-01-01_00:49:50 | 93 |
| 2015-01-01_00:49:51 | 92 |
| 2015-01-01_00:49:52 | 91 |
| 2015-01-01_00:49:53 | 89 |
| 2015-01-01_00:49:54 | 87 |
| 2015-01-01_00:49:55 | 86 |
| 2015-01-01_00:49:56 | 84 |
| 2015-01-01_00:49:57 | 85 |
| 2015-01-01_00:49:58 | 84 |
| 2015-01-01_00:49:59 | 84 |
| 2015-01-01_00:50:00 | 84 |
| 2015-01-01_00:50:01 | 84 |
| 2015-01-01_00:50:02 | 84 |
| 2015-01-01_00:50:03 | 85 |
| 2015-01-01_00:50:04 | 85 |
| 2015-01-01_00:50:05 | 84 |
| 2015-01-01_00:50:06 | 83 |
| 2015-01-01_00:50:07 | 83 |
| 2015-01-01_00:50:08 | 84 |
| 2015-01-01_00:50:09 | 86 |
| 2015-01-01_00:50:10 | 86 |
| 2015-01-01_00:50:11 | 86 |
| 2015-01-01_00:50:12 | 86 |
| 2015-01-01_00:50:13 | 85 |
| 2015-01-01_00:50:14 | 85 |
| 2015-01-01_00:50:15 | 86 |
| 2015-01-01_00:50:16 | 85 |
| 2015-01-01_00:50:17 | 87 |
| 2015-01-01_00:50:18 | 84 |
| 2015-01-01_00:50:19 | 84 |
| 2015-01-01_00:50:20 | 83 |
| 2015-01-01_00:50:21 | 84 |
| 2015-01-01_00:50:22 | 83 |
| 2015-01-01_00:50:23 | 84 |
| 2015-01-01_00:50:24 | 84 |
| 2015-01-01_00:50:25 | 82 |
| 2015-01-01_00:50:26 | 81 |
| 2015-01-01_00:50:27 | 82 |
| 2015-01-01_00:50:28 | 82 |
| 2015-01-01_00:50:29 | 84 |
| 2015-01-01_00:50:30 | 85 |
| 2015-01-01_00:50:31 | 84 |
| 2015-01-01_00:50:32 | 85 |
| 2015-01-01_00:50:33 | 84 |
| 2015-01-01_00:50:34 | 83 |
| 2015-01-01_00:50:35 | 84 |
| 2015-01-01_00:50:36 | 83 |
| 2015-01-01_00:50:37 | 84 |
| 2015-01-01_00:50:38 | 83 |
| 2015-01-01_00:50:39 | 83 |
| 2015-01-01_00:50:40 | 83 |
| 2015-01-01_00:50:41 | 83 |
| 2015-01-01_00:50:42 | 84 |
| 2015-01-01_00:50:43 | 85 |
| 2015-01-01_00:50:44 | 85 |
| 2015-01-01_00:50:45 | 85 |
| 2015-01-01_00:50:46 | 84 |
| 2015-01-01_00:50:47 | 84 |
| 2015-01-01_00:50:48 | 83 |
| 2015-01-01_00:50:49 | 82 |
| 2015-01-01_00:50:50 | 82 |
| 2015-01-01_00:50:51 | 80 |
| 2015-01-01_00:50:52 | 79 |
| 2015-01-01_00:50:53 | 80 |
| 2015-01-01_00:50:54 | 80 |
| 2015-01-01_00:50:55 | 78 |
| 2015-01-01_00:50:56 | 76 |
| 2015-01-01_00:50:57 | 75 |
| 2015-01-01_00:50:58 | 74 |
| 2015-01-01_00:50:59 | 74 |
| 2015-01-01_00:51:00 | 76 |
| 2015-01-01_00:51:01 | 77 |
| 2015-01-01_00:51:02 | 79 |
| 2015-01-01_00:51:03 | 81 |
| 2015-01-01_00:51:04 | 83 |
| 2015-01-01_00:51:05 | 86 |
| 2015-01-01_00:51:06 | 86 |
| 2015-01-01_00:51:07 | 86 |
| 2015-01-01_00:51:08 | 87 |
| 2015-01-01_00:51:09 | 87 |
| 2015-01-01_00:51:10 | 88 |
| 2015-01-01_00:51:11 | 89 |
| 2015-01-01_00:51:12 | 89 |
| 2015-01-01_00:51:13 | 89 |
| 2015-01-01_00:51:14 | 89 |
| 2015-01-01_00:51:15 | 89 |
| 2015-01-01_00:51:16 | 90 |
| 2015-01-01_00:51:17 | 90 |
| 2015-01-01_00:51:18 | 89 |
| 2015-01-01_00:51:19 | 88 |
| 2015-01-01_00:51:20 | 86 |
| 2015-01-01_00:51:21 | 86 |
| 2015-01-01_00:51:22 | 84 |
| 2015-01-01_00:51:23 | 82 |
| 2015-01-01_00:51:24 | 81 |
| 2015-01-01_00:51:25 | 82 |
| 2015-01-01_00:51:26 | 82 |
| 2015-01-01_00:51:27 | 84 |
| 2015-01-01_00:51:28 | 85 |
| 2015-01-01_00:51:29 | 87 |
| 2015-01-01_00:51:30 | 87 |
| 2015-01-01_00:51:31 | 89 |
| 2015-01-01_00:51:32 | 88 |
| 2015-01-01_00:51:33 | 88 |
| 2015-01-01_00:51:34 | 87 |
| 2015-01-01_00:51:35 | 86 |
| 2015-01-01_00:51:36 | 84 |
| 2015-01-01_00:51:37 | 83 |
| 2015-01-01_00:51:38 | 82 |
| 2015-01-01_00:51:39 | 82 |
| 2015-01-01_00:51:40 | 83 |
| 2015-01-01_00:51:41 | 82 |
| 2015-01-01_00:51:42 | 82 |
| 2015-01-01_00:51:43 | 83 |
| 2015-01-01_00:51:44 | 84 |
| 2015-01-01_00:51:45 | 84 |
| 2015-01-01_00:51:46 | 84 |
| 2015-01-01_00:51:47 | 84 |
| 2015-01-01_00:51:48 | 85 |
| 2015-01-01_00:51:49 | 85 |
| 2015-01-01_00:51:50 | 84 |
| 2015-01-01_00:51:51 | 82 |
| 2015-01-01_00:51:52 | 83 |
| 2015-01-01_00:51:53 | 85 |
| 2015-01-01_00:51:54 | 86 |
| 2015-01-01_00:51:55 | 87 |
| 2015-01-01_00:51:56 | 89 |
| 2015-01-01_00:51:57 | 89 |
| 2015-01-01_00:51:58 | 89 |
| 2015-01-01_00:51:59 | 87 |
| 2015-01-01_00:52:00 | 87 |
| 2015-01-01_00:52:01 | 85 |
| 2015-01-01_00:52:02 | 86 |
| 2015-01-01_00:52:03 | 87 |
| 2015-01-01_00:52:04 | 87 |
| 2015-01-01_00:52:05 | 88 |
| 2015-01-01_00:52:06 | 89 |
| 2015-01-01_00:52:07 | 89 |
| 2015-01-01_00:52:08 | 89 |
| 2015-01-01_00:52:09 | 88 |
| 2015-01-01_00:52:10 | 90 |
| 2015-01-01_00:52:11 | 92 |
| 2015-01-01_00:52:12 | 94 |
| 2015-01-01_00:52:13 | 94 |
| 2015-01-01_00:52:14 | 96 |
| 2015-01-01_00:52:15 | 101 |
| 2015-01-01_00:52:16 | 106 |
| 2015-01-01_00:52:17 | 111 |
| 2015-01-01_00:52:18 | 114 |
| 2015-01-01_00:52:19 | 117 |
| 2015-01-01_00:52:20 | 114 |
| 2015-01-01_00:52:21 | 107 |
| 2015-01-01_00:52:22 | 96 |
| 2015-01-01_00:52:23 | 91 |
| 2015-01-01_00:52:24 | 88 |
| 2015-01-01_00:52:25 | 87 |
| 2015-01-01_00:52:26 | 88 |
| 2015-01-01_00:52:27 | 88 |
| 2015-01-01_00:52:28 | 89 |
| 2015-01-01_00:52:29 | 89 |
| 2015-01-01_00:52:30 | 89 |
| 2015-01-01_00:52:31 | 88 |
| 2015-01-01_00:52:32 | 89 |
| 2015-01-01_00:52:33 | 88 |
| 2015-01-01_00:52:34 | 88 |
| 2015-01-01_00:52:35 | 89 |
| 2015-01-01_00:52:36 | 88 |
| 2015-01-01_00:52:37 | 88 |
| 2015-01-01_00:52:38 | 86 |
| 2015-01-01_00:52:39 | 85 |
| 2015-01-01_00:52:40 | 84 |
| 2015-01-01_00:52:41 | 84 |
| 2015-01-01_00:52:42 | 83 |
| 2015-01-01_00:52:43 | 82 |
| 2015-01-01_00:52:44 | 83 |
| 2015-01-01_00:52:45 | 83 |
| 2015-01-01_00:52:46 | 83 |
| 2015-01-01_00:52:47 | 80 |
| 2015-01-01_00:52:48 | 80 |
| 2015-01-01_00:52:49 | 80 |
| 2015-01-01_00:52:50 | 80 |
| 2015-01-01_00:52:51 | 82 |
| 2015-01-01_00:52:52 | 84 |
| 2015-01-01_00:52:53 | 86 |
| 2015-01-01_00:52:54 | 89 |
| 2015-01-01_00:52:55 | 89 |
| 2015-01-01_00:52:56 | 88 |
| 2015-01-01_00:52:57 | 89 |
| 2015-01-01_00:52:58 | 88 |
| 2015-01-01_00:52:59 | 90 |
| 2015-01-01_00:53:00 | 89 |
| 2015-01-01_00:53:01 | 90 |
| 2015-01-01_00:53:02 | 89 |
| 2015-01-01_00:53:03 | 88 |
| 2015-01-01_00:53:04 | 87 |
| 2015-01-01_00:53:05 | 87 |
| 2015-01-01_00:53:06 | 85 |
| 2015-01-01_00:53:07 | 85 |
| 2015-01-01_00:53:08 | 83 |
| 2015-01-01_00:53:09 | 82 |
| 2015-01-01_00:53:10 | 82 |
| 2015-01-01_00:53:11 | 83 |
| 2015-01-01_00:53:12 | 84 |
| 2015-01-01_00:53:13 | 83 |
| 2015-01-01_00:53:14 | 83 |
| 2015-01-01_00:53:15 | 83 |
| 2015-01-01_00:53:16 | 83 |
| 2015-01-01_00:53:17 | 83 |
| 2015-01-01_00:53:18 | 83 |
| 2015-01-01_00:53:19 | 85 |
| 2015-01-01_00:53:20 | 85 |
| 2015-01-01_00:53:21 | 86 |
| 2015-01-01_00:53:22 | 87 |
| 2015-01-01_00:53:23 | 87 |
| 2015-01-01_00:53:24 | 88 |
| 2015-01-01_00:53:25 | 89 |
| 2015-01-01_00:53:26 | 88 |
| 2015-01-01_00:53:27 | 89 |
| 2015-01-01_00:53:28 | 89 |
| 2015-01-01_00:53:29 | 88 |
| 2015-01-01_00:53:30 | 88 |
| 2015-01-01_00:53:31 | 88 |
| 2015-01-01_00:53:32 | 87 |
| 2015-01-01_00:53:33 | 88 |
| 2015-01-01_00:53:34 | 87 |
| 2015-01-01_00:53:35 | 88 |
| 2015-01-01_00:53:36 | 89 |
| 2015-01-01_00:53:37 | 89 |
| 2015-01-01_00:53:38 | 89 |
| 2015-01-01_00:53:39 | 90 |
| 2015-01-01_00:53:40 | 90 |
| 2015-01-01_00:53:41 | 90 |
| 2015-01-01_00:53:42 | 89 |
| 2015-01-01_00:53:43 | 89 |
| 2015-01-01_00:53:44 | 87 |
| 2015-01-01_00:53:45 | 86 |
| 2015-01-01_00:53:46 | 82 |
| 2015-01-01_00:53:47 | 71 |
| 2015-01-01_00:53:48 | 59 |
| 2015-01-01_00:53:49 | 49 |
| 2015-01-01_00:53:50 | 42 |
| 2015-01-01_00:53:51 | 38 |
| 2015-01-01_00:53:52 | 34 |
| 2015-01-01_00:53:53 | 31 |
| 2015-01-01_00:53:54 | 30 |
| 2015-01-01_00:53:55 | 27 |
| 2015-01-01_00:53:56 | 26 |
| 2015-01-01_00:53:57 | 24 |
| 2015-01-01_00:53:58 | 24 |
| 2015-01-01_00:53:59 | 22 |
| 2015-01-01_00:54:00 | 22 |
| 2015-01-01_00:54:01 | 21 |
| 2015-01-01_00:54:02 | 21 |
| 2015-01-01_00:54:03 | 20 |
| 2015-01-01_00:54:04 | 16 |
| 2015-01-01_00:54:05 | 13 |
| 2015-01-01_00:54:06 | 10 |
| 2015-01-01_00:54:07 | 8 |
| 2015-01-01_00:54:08 | 7 |
| 2015-01-01_00:54:09 | 7 |
| 2015-01-01_00:54:10 | 4 |
| 2015-01-01_00:54:11 | 2 |
| 2015-01-01_00:54:12 | 1 |
| 2015-01-01_00:54:13 | 0 |
| 2015-01-01_00:54:14 | 0 |
| 2015-01-01_00:54:15 | 0 |
| 2015-01-01_00:54:16 | 0 |
| 2015-01-01_00:54:17 | 0 |
| 2015-01-01_00:54:18 | 0 |
| 2015-01-01_00:54:19 | 0 |
| 2015-01-01_00:54:20 | 0 |
| 2015-01-01_00:54:21 | 0 |
| 2015-01-01_00:54:22 | 0 |
| 2015-01-01_00:54:23 | 0 |
| 2015-01-01_00:54:24 | 2 |
| 2015-01-01_00:54:25 | 7 |
| 2015-01-01_00:54:26 | 7 |
| 2015-01-01_00:54:27 | 8 |
| 2015-01-01_00:54:28 | 7 |
| 2015-01-01_00:54:29 | 7 |
| 2015-01-01_00:54:30 | 7 |
| 2015-01-01_00:54:31 | 7 |
| 2015-01-01_00:54:32 | 7 |
| 2015-01-01_00:54:33 | 7 |
| 2015-01-01_00:54:34 | 7 |
| 2015-01-01_00:54:35 | 8 |
| 2015-01-01_00:54:36 | 7 |
| 2015-01-01_00:54:37 | 7 |
| 2015-01-01_00:54:38 | 7 |
| 2015-01-01_00:54:39 | 7 |
| 2015-01-01_00:54:40 | 7 |
| 2015-01-01_00:54:41 | 7 |
| 2015-01-01_00:54:42 | 7 |
| 2015-01-01_00:54:43 | 5 |
| 2015-01-01_00:54:44 | 2 |
| 2015-01-01_00:54:45 | 1 |
| 2015-01-01_00:54:46 | 0 |
| 2015-01-01_00:54:47 | 0 |
| 2015-01-01_00:54:48 | 0 |
| 2015-01-01_00:54:49 | 0 |
| 2015-01-01_00:54:50 | 0 |
| 2015-01-01_00:54:51 | 0 |
| 2015-01-01_00:54:52 | 0 |
| 2015-01-01_00:54:53 | 0 |
| 2015-01-01_00:54:54 | 0 |
| 2015-01-01_00:54:55 | 0 |
| 2015-01-01_00:54:56 | 0 |
| 2015-01-01_00:54:57 | 0 |
| 2015-01-01_00:54:58 | 0 |
| 2015-01-01_00:54:59 | 0 |
| 2015-01-01_00:55:00 | 0 |
| 2015-01-01_00:55:01 | 0 |
| 2015-01-01_00:55:02 | 0 |
| 2015-01-01_00:55:03 | 0 |
| 2015-01-01_00:55:04 | 0 |
| 2015-01-01_00:55:05 | 0 |
| 2015-01-01_00:55:06 | 0 |
| 2015-01-01_00:55:07 | 0 |
| 2015-01-01_00:55:08 | 0 |
| 2015-01-01_00:55:09 | 0 |
| 2015-01-01_00:55:10 | 1 |
| 2015-01-01_00:55:11 | 6 |
| 2015-01-01_00:55:12 | 8 |
| 2015-01-01_00:55:13 | 9 |
| 2015-01-01_00:55:14 | 12 |
| 2015-01-01_00:55:15 | 13 |
| 2015-01-01_00:55:16 | 12 |
| 2015-01-01_00:55:17 | 14 |
| 2015-01-01_00:55:18 | 15 |
| 2015-01-01_00:55:19 | 18 |
| 2015-01-01_00:55:20 | 17 |
| 2015-01-01_00:55:21 | 16 |
| 2015-01-01_00:55:22 | 16 |
| 2015-01-01_00:55:23 | 15 |
| 2015-01-01_00:55:24 | 15 |
| 2015-01-01_00:55:25 | 15 |
| 2015-01-01_00:55:26 | 14 |
| 2015-01-01_00:55:27 | 15 |
| 2015-01-01_00:55:28 | 15 |
| 2015-01-01_00:55:29 | 14 |
| 2015-01-01_00:55:30 | 13 |
| 2015-01-01_00:55:31 | 12 |
| 2015-01-01_00:55:32 | 9 |
| 2015-01-01_00:55:33 | 5 |
| 2015-01-01_00:55:34 | 3 |
| 2015-01-01_00:55:35 | 2 |
| 2015-01-01_00:55:36 | 0 |
| 2015-01-01_00:55:37 | 0 |
| 2015-01-01_00:55:38 | 0 |
| 2015-01-01_00:55:39 | 0 |
| 2015-01-01_00:55:40 | 0 |
| 2015-01-01_00:55:41 | 0 |
| 2015-01-01_00:55:42 | 0 |
| 2015-01-01_00:55:43 | 0 |
| 2015-01-01_00:55:44 | 0 |
| 2015-01-01_00:55:45 | 0 |
| 2015-01-01_00:55:46 | 0 |
| 2015-01-01_00:55:47 | 0 |
| 2015-01-01_00:55:48 | 0 |
| 2015-01-01_00:55:49 | 0 |
| 2015-01-01_00:55:50 | 0 |
| 2015-01-01_00:55:51 | 0 |
| 2015-01-01_00:55:52 | 0 |
| 2015-01-01_00:55:53 | 0 |
| 2015-01-01_00:55:54 | 0 |
| 2015-01-01_00:55:55 | 0 |
| 2015-01-01_00:55:56 | 0 |
| 2015-01-01_00:55:57 | 0 |
| 2015-01-01_00:55:58 | 0 |
| 2015-01-01_00:55:59 | 0 |
| 2015-01-01_00:56:00 | 0 |
| 2015-01-01_00:56:01 | 0 |
| 2015-01-01_00:56:02 | 0 |
| 2015-01-01_00:56:03 | 4 |
| 2015-01-01_00:56:04 | 8 |
| 2015-01-01_00:56:05 | 7 |
| 2015-01-01_00:56:06 | 7 |
| 2015-01-01_00:56:07 | 7 |
| 2015-01-01_00:56:08 | 7 |
| 2015-01-01_00:56:09 | 8 |
| 2015-01-01_00:56:10 | 7 |
| 2015-01-01_00:56:11 | 11 |
| 2015-01-01_00:56:12 | 12 |
| 2015-01-01_00:56:13 | 13 |
| 2015-01-01_00:56:14 | 12 |
| 2015-01-01_00:56:15 | 13 |
| 2015-01-01_00:56:16 | 13 |
| 2015-01-01_00:56:17 | 13 |
| 2015-01-01_00:56:18 | 14 |
| 2015-01-01_00:56:19 | 14 |
| 2015-01-01_00:56:20 | 14 |
| 2015-01-01_00:56:21 | 15 |
| 2015-01-01_00:56:22 | 13 |
| 2015-01-01_00:56:23 | 13 |
| 2015-01-01_00:56:24 | 12 |
| 2015-01-01_00:56:25 | 11 |
| 2015-01-01_00:56:26 | 11 |
| 2015-01-01_00:56:27 | 11 |
| 2015-01-01_00:56:28 | 11 |
| 2015-01-01_00:56:29 | 11 |
| 2015-01-01_00:56:30 | 10 |
| 2015-01-01_00:56:31 | 11 |
| 2015-01-01_00:56:32 | 10 |
| 2015-01-01_00:56:33 | 11 |
| 2015-01-01_00:56:34 | 10 |
| 2015-01-01_00:56:35 | 11 |
| 2015-01-01_00:56:36 | 10 |
| 2015-01-01_00:56:37 | 11 |
| 2015-01-01_00:56:38 | 10 |
| 2015-01-01_00:56:39 | 9 |
| 2015-01-01_00:56:40 | 7 |
| 2015-01-01_00:56:41 | 8 |
| 2015-01-01_00:56:42 | 7 |
| 2015-01-01_00:56:43 | 8 |
| 2015-01-01_00:56:44 | 8 |
| 2015-01-01_00:56:45 | 8 |
| 2015-01-01_00:56:46 | 8 |
| 2015-01-01_00:56:47 | 8 |
| 2015-01-01_00:56:48 | 9 |
| 2015-01-01_00:56:49 | 8 |
| 2015-01-01_00:56:50 | 7 |
| 2015-01-01_00:56:51 | 7 |
| 2015-01-01_00:56:52 | 7 |
| 2015-01-01_00:56:53 | 7 |
| 2015-01-01_00:56:54 | 7 |
| 2015-01-01_00:56:55 | 7 |
| 2015-01-01_00:56:56 | 8 |
| 2015-01-01_00:56:57 | 8 |
| 2015-01-01_00:56:58 | 8 |
| 2015-01-01_00:56:59 | 8 |
| 2015-01-01_00:57:00 | 8 |
| 2015-01-01_00:57:01 | 9 |
| 2015-01-01_00:57:02 | 9 |
| 2015-01-01_00:57:03 | 9 |
| 2015-01-01_00:57:04 | 9 |
| 2015-01-01_00:57:05 | 10 |
| 2015-01-01_00:57:06 | 9 |
| 2015-01-01_00:57:07 | 10 |
| 2015-01-01_00:57:08 | 9 |
| 2015-01-01_00:57:09 | 10 |
| 2015-01-01_00:57:10 | 10 |
| 2015-01-01_00:57:11 | 10 |
| 2015-01-01_00:57:12 | 11 |
| 2015-01-01_00:57:13 | 10 |
| 2015-01-01_00:57:14 | 11 |
| 2015-01-01_00:57:15 | 11 |
| 2015-01-01_00:57:16 | 8 |
| 2015-01-01_00:57:17 | 6 |
| 2015-01-01_00:57:18 | 2 |
| 2015-01-01_00:57:19 | 0 |
| 2015-01-01_00:57:20 | 0 |
| 2015-01-01_00:57:21 | 0 |
| 2015-01-01_00:57:22 | 0 |
| 2015-01-01_00:57:23 | 0 |
| 2015-01-01_00:57:24 | 0 |
| 2015-01-01_00:57:25 | 0 |
| 2015-01-01_00:57:26 | 0 |
| 2015-01-01_00:57:27 | 0 |
| 2015-01-01_00:57:28 | 0 |
| 2015-01-01_00:57:29 | 0 |
| 2015-01-01_00:57:30 | 0 |
| 2015-01-01_00:57:31 | 0 |
| 2015-01-01_00:57:32 | 0 |
| 2015-01-01_00:57:33 | 0 |
| 2015-01-01_00:57:34 | 0 |
| 2015-01-01_00:57:35 | 0 |
| 2015-01-01_00:57:36 | 0 |
| 2015-01-01_00:57:37 | 0 |
| 2015-01-01_00:57:38 | 0 |
| 2015-01-01_00:57:39 | 0 |
| 2015-01-01_00:57:40 | 0 |
| 2015-01-01_00:57:41 | 0 |
| 2015-01-01_00:57:42 | 0 |
| 2015-01-01_00:57:43 | 0 |
| 2015-01-01_00:57:44 | 0 |
| 2015-01-01_00:57:45 | 0 |
| 2015-01-01_00:57:46 | 0 |
| 2015-01-01_00:57:47 | 0 |
| 2015-01-01_00:57:48 | 0 |
| 2015-01-01_00:57:49 | 0 |
| 2015-01-01_00:57:50 | 0 |
| 2015-01-01_00:57:51 | 0 |
| 2015-01-01_00:57:52 | 0 |
| 2015-01-01_00:57:53 | 1 |
| 2015-01-01_00:57:54 | 7 |
| 2015-01-01_00:57:55 | 8 |
| 2015-01-01_00:57:56 | 7 |
| 2015-01-01_00:57:57 | 8 |
| 2015-01-01_00:57:58 | 10 |
| 2015-01-01_00:57:59 | 12 |
| 2015-01-01_00:58:00 | 13 |
| 2015-01-01_00:58:01 | 13 |
| 2015-01-01_00:58:02 | 12 |
| 2015-01-01_00:58:03 | 13 |
| 2015-01-01_00:58:04 | 14 |
| 2015-01-01_00:58:05 | 13 |
| 2015-01-01_00:58:06 | 14 |
| 2015-01-01_00:58:07 | 14 |
| 2015-01-01_00:58:08 | 14 |
| 2015-01-01_00:58:09 | 14 |
| 2015-01-01_00:58:10 | 13 |
| 2015-01-01_00:58:11 | 12 |
| 2015-01-01_00:58:12 | 10 |
| 2015-01-01_00:58:13 | 11 |
| 2015-01-01_00:58:14 | 10 |
| 2015-01-01_00:58:15 | 9 |
| 2015-01-01_00:58:16 | 8 |
| 2015-01-01_00:58:17 | 8 |
| 2015-01-01_00:58:18 | 8 |
| 2015-01-01_00:58:19 | 8 |
| 2015-01-01_00:58:20 | 8 |
| 2015-01-01_00:58:21 | 8 |
| 2015-01-01_00:58:22 | 8 |
| 2015-01-01_00:58:23 | 8 |
| 2015-01-01_00:58:24 | 8 |
| 2015-01-01_00:58:25 | 8 |
| 2015-01-01_00:58:26 | 8 |
| 2015-01-01_00:58:27 | 8 |
| 2015-01-01_00:58:28 | 7 |
| 2015-01-01_00:58:29 | 7 |
| 2015-01-01_00:58:30 | 6 |
| 2015-01-01_00:58:31 | 6 |
| 2015-01-01_00:58:32 | 6 |
| 2015-01-01_00:58:33 | 6 |
| 2015-01-01_00:58:34 | 7 |
| 2015-01-01_00:58:35 | 7 |
| 2015-01-01_00:58:36 | 8 |
| 2015-01-01_00:58:37 | 8 |
| 2015-01-01_00:58:38 | 9 |
| 2015-01-01_00:58:39 | 9 |
| 2015-01-01_00:58:40 | 9 |
| 2015-01-01_00:58:41 | 10 |
| 2015-01-01_00:58:42 | 10 |
| 2015-01-01_00:58:43 | 10 |
| 2015-01-01_00:58:44 | 11 |
| 2015-01-01_00:58:45 | 11 |
| 2015-01-01_00:58:46 | 11 |
| 2015-01-01_00:58:47 | 12 |
| 2015-01-01_00:58:48 | 12 |
| 2015-01-01_00:58:49 | 13 |
| 2015-01-01_00:58:50 | 12 |
| 2015-01-01_00:58:51 | 13 |
| 2015-01-01_00:58:52 | 12 |
| 2015-01-01_00:58:53 | 10 |
| 2015-01-01_00:58:54 | 7 |
| 2015-01-01_00:58:55 | 7 |
| 2015-01-01_00:58:56 | 7 |
| 2015-01-01_00:58:57 | 7 |
| 2015-01-01_00:58:58 | 7 |
| 2015-01-01_00:58:59 | 7 |
| 2015-01-01_00:59:00 | 7 |
| 2015-01-01_00:59:01 | 7 |
| 2015-01-01_00:59:02 | 7 |
| 2015-01-01_00:59:03 | 7 |
| 2015-01-01_00:59:04 | 7 |
| 2015-01-01_00:59:05 | 8 |
| 2015-01-01_00:59:06 | 7 |
| 2015-01-01_00:59:07 | 7 |
| 2015-01-01_00:59:08 | 7 |
| 2015-01-01_00:59:09 | 7 |
| 2015-01-01_00:59:10 | 7 |
| 2015-01-01_00:59:11 | 7 |
| 2015-01-01_00:59:12 | 7 |
| 2015-01-01_00:59:13 | 7 |
| 2015-01-01_00:59:14 | 7 |
| 2015-01-01_00:59:15 | 8 |
| 2015-01-01_00:59:16 | 7 |
| 2015-01-01_00:59:17 | 7 |
| 2015-01-01_00:59:18 | 7 |
| 2015-01-01_00:59:19 | 7 |
| 2015-01-01_00:59:20 | 7 |
| 2015-01-01_00:59:21 | 7 |
| 2015-01-01_00:59:22 | 7 |
| 2015-01-01_00:59:23 | 7 |
| 2015-01-01_00:59:24 | 8 |
| 2015-01-01_00:59:25 | 7 |
| 2015-01-01_00:59:26 | 7 |
| 2015-01-01_00:59:27 | 7 |
| 2015-01-01_00:59:28 | 7 |
| 2015-01-01_00:59:29 | 7 |
| 2015-01-01_00:59:30 | 7 |
| 2015-01-01_00:59:31 | 7 |
| 2015-01-01_00:59:32 | 7 |
| 2015-01-01_00:59:33 | 7 |
| 2015-01-01_00:59:34 | 7 |
| 2015-01-01_00:59:35 | 7 |
| 2015-01-01_00:59:36 | 7 |
| 2015-01-01_00:59:37 | 7 |
| 2015-01-01_00:59:38 | 7 |
| 2015-01-01_00:59:39 | 8 |
| 2015-01-01_00:59:40 | 7 |
| 2015-01-01_00:59:41 | 7 |
| 2015-01-01_00:59:42 | 7 |
| 2015-01-01_00:59:43 | 7 |
| 2015-01-01_00:59:44 | 7 |
| 2015-01-01_00:59:45 | 7 |
| 2015-01-01_00:59:46 | 7 |
| 2015-01-01_00:59:47 | 7 |
| 2015-01-01_00:59:48 | 8 |
| 2015-01-01_00:59:49 | 7 |
| 2015-01-01_00:59:50 | 7 |
| 2015-01-01_00:59:51 | 7 |
| 2015-01-01_00:59:52 | 7 |
| 2015-01-01_00:59:53 | 7 |
| 2015-01-01_00:59:54 | 7 |
| 2015-01-01_00:59:55 | 8 |
| 2015-01-01_00:59:56 | 7 |
| 2015-01-01_00:59:57 | 7 |
| 2015-01-01_00:59:58 | 7 |
| 2015-01-01_00:59:59 | 7 |
| 2015-01-01_01:00:01 | 7 |
| 2015-01-01_01:00:02 | 7 |
| 2015-01-01_01:00:03 | 8 |
| 2015-01-01_01:00:04 | 7 |
| 2015-01-01_01:00:05 | 7 |
| 2015-01-01_01:00:06 | 7 |
| 2015-01-01_01:00:07 | 7 |
| 2015-01-01_01:00:08 | 7 |
| 2015-01-01_01:00:09 | 7 |
| 2015-01-01_01:00:10 | 7 |
| 2015-01-01_01:00:11 | 8 |
| 2015-01-01_01:00:12 | 7 |
| 2015-01-01_01:00:13 | 7 |
| 2015-01-01_01:00:14 | 7 |
| 2015-01-01_01:00:15 | 7 |
| 2015-01-01_01:00:16 | 7 |
| 2015-01-01_01:00:17 | 7 |
| 2015-01-01_01:00:18 | 8 |
| 2015-01-01_01:00:19 | 7 |
| 2015-01-01_01:00:20 | 7 |
| 2015-01-01_01:00:21 | 7 |
| 2015-01-01_01:00:22 | 7 |
| 2015-01-01_01:00:23 | 7 |
| 2015-01-01_01:00:24 | 8 |
| 2015-01-01_01:00:25 | 9 |
| 2015-01-01_01:00:26 | 11 |
| 2015-01-01_01:00:27 | 11 |
| 2015-01-01_01:00:28 | 12 |
| 2015-01-01_01:00:29 | 13 |
| 2015-01-01_01:00:30 | 13 |
| 2015-01-01_01:00:31 | 12 |
| 2015-01-01_01:00:32 | 13 |
| 2015-01-01_01:00:33 | 12 |
| 2015-01-01_01:00:34 | 12 |
| 2015-01-01_01:00:35 | 11 |
| 2015-01-01_01:00:36 | 12 |
| 2015-01-01_01:00:37 | 12 |
| 2015-01-01_01:00:38 | 12 |
| 2015-01-01_01:00:39 | 13 |
| 2015-01-01_01:00:40 | 12 |
| 2015-01-01_01:00:41 | 13 |
| 2015-01-01_01:00:42 | 13 |
| 2015-01-01_01:00:43 | 13 |
| 2015-01-01_01:00:44 | 13 |
| 2015-01-01_01:00:45 | 13 |
| 2015-01-01_01:00:46 | 14 |
| 2015-01-01_01:00:47 | 13 |
| 2015-01-01_01:00:48 | 14 |
| 2015-01-01_01:00:49 | 14 |
| 2015-01-01_01:00:50 | 14 |
| 2015-01-01_01:00:51 | 14 |
| 2015-01-01_01:00:52 | 15 |
| 2015-01-01_01:00:53 | 15 |
| 2015-01-01_01:00:54 | 15 |
| 2015-01-01_01:00:55 | 16 |
| 2015-01-01_01:00:56 | 15 |
| 2015-01-01_01:00:57 | 17 |
| 2015-01-01_01:00:58 | 16 |
| 2015-01-01_01:00:59 | 17 |
| 2015-01-01_01:01:00 | 17 |
| 2015-01-01_01:01:01 | 17 |
| 2015-01-01_01:01:02 | 18 |
| 2015-01-01_01:01:03 | 17 |
| 2015-01-01_01:01:04 | 18 |
| 2015-01-01_01:01:05 | 18 |
| 2015-01-01_01:01:06 | 18 |
| 2015-01-01_01:01:07 | 18 |
| 2015-01-01_01:01:08 | 18 |
| 2015-01-01_01:01:09 | 18 |
| 2015-01-01_01:01:10 | 18 |
| 2015-01-01_01:01:11 | 18 |
| 2015-01-01_01:01:12 | 18 |
| 2015-01-01_01:01:13 | 18 |
| 2015-01-01_01:01:14 | 18 |
| 2015-01-01_01:01:15 | 17 |
| 2015-01-01_01:01:16 | 18 |
| 2015-01-01_01:01:17 | 18 |
| 2015-01-01_01:01:18 | 17 |
| 2015-01-01_01:01:19 | 18 |
| 2015-01-01_01:01:20 | 17 |
| 2015-01-01_01:01:21 | 18 |
| 2015-01-01_01:01:22 | 17 |
| 2015-01-01_01:01:23 | 17 |
| 2015-01-01_01:01:24 | 17 |
| 2015-01-01_01:01:25 | 17 |
| 2015-01-01_01:01:26 | 17 |
| 2015-01-01_01:01:27 | 16 |
| 2015-01-01_01:01:28 | 17 |
| 2015-01-01_01:01:29 | 17 |
| 2015-01-01_01:01:30 | 16 |
| 2015-01-01_01:01:31 | 17 |
| 2015-01-01_01:01:32 | 14 |
| 2015-01-01_01:01:33 | 15 |
| 2015-01-01_01:01:34 | 16 |
| 2015-01-01_01:01:35 | 19 |
| 2015-01-01_01:01:36 | 21 |
| 2015-01-01_01:01:37 | 22 |
| 2015-01-01_01:01:38 | 22 |
| 2015-01-01_01:01:39 | 22 |
| 2015-01-01_01:01:40 | 21 |
| 2015-01-01_01:01:41 | 22 |
| 2015-01-01_01:01:42 | 21 |
| 2015-01-01_01:01:43 | 21 |
| 2015-01-01_01:01:44 | 21 |
| 2015-01-01_01:01:45 | 21 |
| 2015-01-01_01:01:46 | 20 |
| 2015-01-01_01:01:47 | 21 |
| 2015-01-01_01:01:48 | 20 |
| 2015-01-01_01:01:49 | 21 |
| 2015-01-01_01:01:50 | 20 |
| 2015-01-01_01:01:51 | 21 |
| 2015-01-01_01:01:52 | 20 |
| 2015-01-01_01:01:53 | 20 |
| 2015-01-01_01:01:54 | 20 |
| 2015-01-01_01:01:55 | 19 |
| 2015-01-01_01:01:56 | 19 |
| 2015-01-01_01:01:57 | 19 |
| 2015-01-01_01:01:58 | 18 |
| 2015-01-01_01:01:59 | 15 |
| 2015-01-01_01:02:00 | 13 |
| 2015-01-01_01:02:01 | 9 |
| 2015-01-01_01:02:02 | 5 |
| 2015-01-01_01:02:03 | 3 |
| 2015-01-01_01:02:04 | 2 |
| 2015-01-01_01:02:05 | 0 |
| 2015-01-01_01:02:06 | 0 |
| 2015-01-01_01:02:07 | 0 |
| 2015-01-01_01:02:08 | 0 |
| 2015-01-01_01:02:09 | 1 |
| 2015-01-01_01:02:10 | 4 |
| 2015-01-01_01:02:11 | 5 |
| 2015-01-01_01:02:12 | 5 |
| 2015-01-01_01:02:13 | 7 |
| 2015-01-01_01:02:14 | 8 |
| 2015-01-01_01:02:15 | 7 |
| 2015-01-01_01:02:16 | 7 |
| 2015-01-01_01:02:17 | 7 |
| 2015-01-01_01:02:18 | 7 |
| 2015-01-01_01:02:19 | 7 |
| 2015-01-01_01:02:20 | 8 |
| 2015-01-01_01:02:21 | 7 |
| 2015-01-01_01:02:22 | 7 |
| 2015-01-01_01:02:23 | 8 |
| 2015-01-01_01:02:24 | 10 |
| 2015-01-01_01:02:25 | 12 |
| 2015-01-01_01:02:26 | 13 |
| 2015-01-01_01:02:27 | 13 |
| 2015-01-01_01:02:28 | 12 |
| 2015-01-01_01:02:29 | 12 |
| 2015-01-01_01:02:30 | 11 |
| 2015-01-01_01:02:31 | 12 |
| 2015-01-01_01:02:32 | 12 |
| 2015-01-01_01:02:33 | 12 |
| 2015-01-01_01:02:34 | 12 |
| 2015-01-01_01:02:35 | 12 |
| 2015-01-01_01:02:36 | 12 |
| 2015-01-01_01:02:37 | 13 |
| 2015-01-01_01:02:38 | 12 |
| 2015-01-01_01:02:39 | 13 |
| 2015-01-01_01:02:40 | 14 |
| 2015-01-01_01:02:41 | 14 |
| 2015-01-01_01:02:42 | 13 |
| 2015-01-01_01:02:43 | 13 |
| 2015-01-01_01:02:44 | 11 |
| 2015-01-01_01:02:45 | 11 |
| 2015-01-01_01:02:46 | 11 |
| 2015-01-01_01:02:47 | 9 |
| 2015-01-01_01:02:48 | 9 |
| 2015-01-01_01:02:49 | 9 |
| 2015-01-01_01:02:50 | 7 |
| 2015-01-01_01:02:51 | 7 |
| 2015-01-01_01:02:52 | 7 |
| 2015-01-01_01:02:53 | 7 |
| 2015-01-01_01:02:54 | 8 |
| 2015-01-01_01:02:55 | 7 |
| 2015-01-01_01:02:56 | 7 |
| 2015-01-01_01:02:57 | 7 |
| 2015-01-01_01:02:58 | 7 |
| 2015-01-01_01:02:59 | 7 |
| 2015-01-01_01:03:00 | 7 |
| 2015-01-01_01:03:01 | 9 |
| 2015-01-01_01:03:02 | 13 |
| 2015-01-01_01:03:03 | 13 |
| 2015-01-01_01:03:04 | 11 |
| 2015-01-01_01:03:05 | 12 |
| 2015-01-01_01:03:06 | 11 |
| 2015-01-01_01:03:07 | 13 |
| 2015-01-01_01:03:08 | 15 |
| 2015-01-01_01:03:09 | 16 |
| 2015-01-01_01:03:10 | 16 |
| 2015-01-01_01:03:11 | 17 |
| 2015-01-01_01:03:12 | 18 |
| 2015-01-01_01:03:13 | 17 |
| 2015-01-01_01:03:14 | 18 |
| 2015-01-01_01:03:15 | 19 |
| 2015-01-01_01:03:16 | 18 |
| 2015-01-01_01:03:17 | 18 |
| 2015-01-01_01:03:18 | 17 |
| 2015-01-01_01:03:19 | 17 |
| 2015-01-01_01:03:20 | 15 |
| 2015-01-01_01:03:21 | 16 |
| 2015-01-01_01:03:22 | 16 |
| 2015-01-01_01:03:23 | 16 |
| 2015-01-01_01:03:24 | 15 |
| 2015-01-01_01:03:25 | 15 |
| 2015-01-01_01:03:26 | 14 |
| 2015-01-01_01:03:27 | 14 |
| 2015-01-01_01:03:28 | 15 |
| 2015-01-01_01:03:29 | 15 |
| 2015-01-01_01:03:30 | 15 |
| 2015-01-01_01:03:31 | 15 |
| 2015-01-01_01:03:32 | 14 |
| 2015-01-01_01:03:33 | 16 |
| 2015-01-01_01:03:34 | 14 |
| 2015-01-01_01:03:35 | 15 |
| 2015-01-01_01:03:36 | 14 |
| 2015-01-01_01:03:37 | 13 |
| 2015-01-01_01:03:38 | 13 |
| 2015-01-01_01:03:39 | 11 |
| 2015-01-01_01:03:40 | 12 |
| 2015-01-01_01:03:41 | 11 |
| 2015-01-01_01:03:42 | 12 |
| 2015-01-01_01:03:43 | 12 |
| 2015-01-01_01:03:44 | 12 |
| 2015-01-01_01:03:45 | 13 |
| 2015-01-01_01:03:46 | 13 |
| 2015-01-01_01:03:47 | 12 |
| 2015-01-01_01:03:48 | 13 |
| 2015-01-01_01:03:49 | 13 |
| 2015-01-01_01:03:50 | 12 |
| 2015-01-01_01:03:51 | 11 |
| 2015-01-01_01:03:52 | 10 |
| 2015-01-01_01:03:53 | 8 |
| 2015-01-01_01:03:54 | 6 |
| 2015-01-01_01:03:55 | 5 |
| 2015-01-01_01:03:56 | 3 |
| 2015-01-01_01:03:57 | 2 |
| 2015-01-01_01:03:58 | 0 |
| 2015-01-01_01:03:59 | 0 |
| 2015-01-01_01:04:00 | 0 |
| 2015-01-01_01:04:01 | 0 |
| 2015-01-01_01:04:02 | 0 |
| 2015-01-01_01:04:03 | 0 |
| 2015-01-01_01:04:04 | 1 |
| 2015-01-01_01:04:05 | 7 |
| 2015-01-01_01:04:06 | 7 |
| 2015-01-01_01:04:07 | 7 |
| 2015-01-01_01:04:08 | 7 |
| 2015-01-01_01:04:09 | 8 |
| 2015-01-01_01:04:10 | 7 |
| 2015-01-01_01:04:11 | 7 |
| 2015-01-01_01:04:12 | 7 |
| 2015-01-01_01:04:13 | 7 |
| 2015-01-01_01:04:14 | 10 |
| 2015-01-01_01:04:15 | 12 |
| 2015-01-01_01:04:16 | 12 |
| 2015-01-01_01:04:17 | 11 |
| 2015-01-01_01:04:18 | 12 |
| 2015-01-01_01:04:19 | 13 |
| 2015-01-01_01:04:20 | 13 |
| 2015-01-01_01:04:21 | 13 |
| 2015-01-01_01:04:22 | 12 |
| 2015-01-01_01:04:23 | 11 |
| 2015-01-01_01:04:24 | 9 |
| 2015-01-01_01:04:25 | 9 |
| 2015-01-01_01:04:26 | 7 |
| 2015-01-01_01:04:27 | 6 |
| 2015-01-01_01:04:28 | 5 |
| 2015-01-01_01:04:29 | 6 |
| 2015-01-01_01:04:30 | 8 |
| 2015-01-01_01:04:31 | 12 |
| 2015-01-01_01:04:32 | 11 |
| 2015-01-01_01:04:33 | 11 |
| 2015-01-01_01:04:34 | 9 |
| 2015-01-01_01:04:35 | 5 |
| 2015-01-01_01:04:36 | 3 |
| 2015-01-01_01:04:37 | 2 |
| 2015-01-01_01:04:38 | 0 |
| 2015-01-01_01:04:39 | 3 |
| 2015-01-01_01:04:40 | 7 |
| 2015-01-01_01:04:41 | 8 |
| 2015-01-01_01:04:42 | 7 |
| 2015-01-01_01:04:43 | 7 |
| 2015-01-01_01:04:44 | 9 |
| 2015-01-01_01:04:45 | 8 |
| 2015-01-01_01:04:46 | 8 |
| 2015-01-01_01:04:47 | 7 |
| 2015-01-01_01:04:48 | 7 |
| 2015-01-01_01:04:49 | 7 |
| 2015-01-01_01:04:50 | 7 |
| 2015-01-01_01:04:51 | 5 |
| 2015-01-01_01:04:52 | 5 |
| 2015-01-01_01:04:53 | 9 |
| 2015-01-01_01:04:54 | 11 |
| 2015-01-01_01:04:55 | 16 |
| 2015-01-01_01:04:56 | 15 |
| 2015-01-01_01:04:57 | 17 |
| 2015-01-01_01:04:58 | 20 |
| 2015-01-01_01:04:59 | 20 |
| 2015-01-01_01:05:00 | 21 |
| 2015-01-01_01:05:01 | 24 |
| 2015-01-01_01:05:02 | 28 |
| 2015-01-01_01:05:03 | 31 |
| 2015-01-01_01:05:04 | 31 |
| 2015-01-01_01:05:05 | 37 |
| 2015-01-01_01:05:06 | 42 |
| 2015-01-01_01:05:07 | 48 |
| 2015-01-01_01:05:08 | 53 |
| 2015-01-01_01:05:09 | 57 |
| 2015-01-01_01:05:10 | 59 |
| 2015-01-01_01:05:11 | 64 |
| 2015-01-01_01:05:12 | 69 |
| 2015-01-01_01:05:13 | 74 |
| 2015-01-01_01:05:14 | 73 |
| 2015-01-01_01:05:15 | 74 |
| 2015-01-01_01:05:16 | 77 |
| 2015-01-01_01:05:17 | 80 |
| 2015-01-01_01:05:18 | 82 |
| 2015-01-01_01:05:19 | 81 |
| 2015-01-01_01:05:20 | 80 |
| 2015-01-01_01:05:21 | 80 |
| 2015-01-01_01:05:22 | 80 |
| 2015-01-01_01:05:23 | 79 |
| 2015-01-01_01:05:24 | 80 |
| 2015-01-01_01:05:25 | 81 |
| 2015-01-01_01:05:26 | 81 |
| 2015-01-01_01:05:27 | 83 |
| 2015-01-01_01:05:28 | 84 |
| 2015-01-01_01:05:29 | 84 |
| 2015-01-01_01:05:30 | 83 |
| 2015-01-01_01:05:31 | 81 |
| 2015-01-01_01:05:32 | 80 |
| 2015-01-01_01:05:33 | 80 |
| 2015-01-01_01:05:34 | 79 |
| 2015-01-01_01:05:35 | 79 |
| 2015-01-01_01:05:36 | 81 |
| 2015-01-01_01:05:37 | 80 |
| 2015-01-01_01:05:38 | 80 |
| 2015-01-01_01:05:39 | 80 |
| 2015-01-01_01:05:40 | 79 |
| 2015-01-01_01:05:41 | 80 |
| 2015-01-01_01:05:42 | 80 |
| 2015-01-01_01:05:43 | 79 |
| 2015-01-01_01:05:44 | 80 |
| 2015-01-01_01:05:45 | 80 |
| 2015-01-01_01:05:46 | 80 |
| 2015-01-01_01:05:47 | 80 |
| 2015-01-01_01:05:48 | 79 |
| 2015-01-01_01:05:49 | 80 |
| 2015-01-01_01:05:50 | 80 |
| 2015-01-01_01:05:51 | 80 |
| 2015-01-01_01:05:52 | 79 |
| 2015-01-01_01:05:53 | 80 |
| 2015-01-01_01:05:54 | 80 |
| 2015-01-01_01:05:55 | 79 |
| 2015-01-01_01:05:56 | 80 |
| 2015-01-01_01:05:57 | 80 |
| 2015-01-01_01:05:58 | 79 |
| 2015-01-01_01:05:59 | 80 |
| 2015-01-01_01:06:00 | 80 |
| 2015-01-01_01:06:01 | 80 |
| 2015-01-01_01:06:02 | 80 |
| 2015-01-01_01:06:03 | 80 |
| 2015-01-01_01:06:04 | 79 |
| 2015-01-01_01:06:05 | 80 |
| 2015-01-01_01:06:06 | 80 |
| 2015-01-01_01:06:07 | 79 |
| 2015-01-01_01:06:08 | 80 |
| 2015-01-01_01:06:09 | 80 |
| 2015-01-01_01:06:10 | 80 |
| 2015-01-01_01:06:11 | 80 |
| 2015-01-01_01:06:12 | 79 |
| 2015-01-01_01:06:13 | 80 |
| 2015-01-01_01:06:14 | 80 |
| 2015-01-01_01:06:15 | 80 |
| 2015-01-01_01:06:16 | 80 |
| 2015-01-01_01:06:17 | 80 |
| 2015-01-01_01:06:18 | 80 |
| 2015-01-01_01:06:19 | 79 |
| 2015-01-01_01:06:20 | 80 |
| 2015-01-01_01:06:21 | 80 |
| 2015-01-01_01:06:22 | 80 |
| 2015-01-01_01:06:23 | 80 |
| 2015-01-01_01:06:24 | 80 |
| 2015-01-01_01:06:25 | 80 |
| 2015-01-01_01:06:26 | 79 |
| 2015-01-01_01:06:27 | 80 |
| 2015-01-01_01:06:28 | 80 |
| 2015-01-01_01:06:29 | 80 |
| 2015-01-01_01:06:30 | 79 |
| 2015-01-01_01:06:31 | 80 |
| 2015-01-01_01:06:32 | 80 |
| 2015-01-01_01:06:33 | 80 |
| 2015-01-01_01:06:34 | 80 |
| 2015-01-01_01:06:35 | 80 |
| 2015-01-01_01:06:36 | 80 |
| 2015-01-01_01:06:37 | 80 |
| 2015-01-01_01:06:38 | 79 |
| 2015-01-01_01:06:39 | 80 |
| 2015-01-01_01:06:40 | 80 |
| 2015-01-01_01:06:41 | 80 |
| 2015-01-01_01:06:42 | 80 |
| 2015-01-01_01:06:43 | 79 |
| 2015-01-01_01:06:44 | 80 |
| 2015-01-01_01:06:45 | 80 |
| 2015-01-01_01:06:46 | 80 |
| 2015-01-01_01:06:47 | 79 |
| 2015-01-01_01:06:48 | 80 |
| 2015-01-01_01:06:49 | 80 |
| 2015-01-01_01:06:50 | 80 |
| 2015-01-01_01:06:51 | 80 |
| 2015-01-01_01:06:52 | 79 |
| 2015-01-01_01:06:53 | 80 |
| 2015-01-01_01:06:54 | 80 |
| 2015-01-01_01:06:55 | 79 |
| 2015-01-01_01:06:56 | 80 |
| 2015-01-01_01:06:57 | 80 |
| 2015-01-01_01:06:58 | 80 |
| 2015-01-01_01:06:59 | 80 |
| 2015-01-01_01:07:00 | 79 |
| 2015-01-01_01:07:01 | 80 |
| 2015-01-01_01:07:02 | 80 |
| 2015-01-01_01:07:03 | 80 |
| 2015-01-01_01:07:04 | 79 |
| 2015-01-01_01:07:05 | 80 |
| 2015-01-01_01:07:06 | 80 |
| 2015-01-01_01:07:07 | 80 |
| 2015-01-01_01:07:08 | 80 |
| 2015-01-01_01:07:09 | 80 |
| 2015-01-01_01:07:10 | 79 |
| 2015-01-01_01:07:11 | 80 |
| 2015-01-01_01:07:12 | 79 |
| 2015-01-01_01:07:13 | 81 |
| 2015-01-01_01:07:14 | 79 |
| 2015-01-01_01:07:15 | 80 |
| 2015-01-01_01:07:16 | 80 |
| 2015-01-01_01:07:17 | 80 |
| 2015-01-01_01:07:18 | 79 |
| 2015-01-01_01:07:19 | 80 |
| 2015-01-01_01:07:20 | 80 |
| 2015-01-01_01:07:21 | 80 |
| 2015-01-01_01:07:22 | 79 |
| 2015-01-01_01:07:23 | 80 |
| 2015-01-01_01:07:24 | 80 |
| 2015-01-01_01:07:25 | 80 |
| 2015-01-01_01:07:26 | 80 |
| 2015-01-01_01:07:27 | 79 |
| 2015-01-01_01:07:28 | 80 |
| 2015-01-01_01:07:29 | 80 |
| 2015-01-01_01:07:30 | 80 |
| 2015-01-01_01:07:31 | 80 |
| 2015-01-01_01:07:32 | 80 |
| 2015-01-01_01:07:33 | 80 |
| 2015-01-01_01:07:34 | 80 |
| 2015-01-01_01:07:35 | 79 |
| 2015-01-01_01:07:36 | 80 |
| 2015-01-01_01:07:37 | 80 |
| 2015-01-01_01:07:38 | 80 |
| 2015-01-01_01:07:39 | 79 |
| 2015-01-01_01:07:40 | 80 |
| 2015-01-01_01:07:41 | 80 |
| 2015-01-01_01:07:42 | 80 |
| 2015-01-01_01:07:43 | 80 |
| 2015-01-01_01:07:44 | 80 |
| 2015-01-01_01:07:45 | 80 |
| 2015-01-01_01:07:46 | 79 |
| 2015-01-01_01:07:47 | 80 |
| 2015-01-01_01:07:48 | 80 |
| 2015-01-01_01:07:49 | 80 |
| 2015-01-01_01:07:50 | 79 |
| 2015-01-01_01:07:51 | 80 |
| 2015-01-01_01:07:52 | 80 |
| 2015-01-01_01:07:53 | 80 |
| 2015-01-01_01:07:54 | 79 |
| 2015-01-01_01:07:55 | 80 |
| 2015-01-01_01:07:56 | 80 |
| 2015-01-01_01:07:57 | 80 |
| 2015-01-01_01:07:58 | 79 |
| 2015-01-01_01:07:59 | 80 |
| 2015-01-01_01:08:00 | 80 |
| 2015-01-01_01:08:01 | 80 |
| 2015-01-01_01:08:02 | 79 |
| 2015-01-01_01:08:03 | 80 |
| 2015-01-01_01:08:04 | 80 |
| 2015-01-01_01:08:05 | 80 |
| 2015-01-01_01:08:06 | 80 |
| 2015-01-01_01:08:07 | 79 |
| 2015-01-01_01:08:08 | 80 |
| 2015-01-01_01:08:09 | 80 |
| 2015-01-01_01:08:10 | 80 |
| 2015-01-01_01:08:11 | 80 |
| 2015-01-01_01:08:12 | 79 |
| 2015-01-01_01:08:13 | 80 |
| 2015-01-01_01:08:14 | 80 |
| 2015-01-01_01:08:15 | 80 |
| 2015-01-01_01:08:16 | 79 |
| 2015-01-01_01:08:17 | 80 |
| 2015-01-01_01:08:18 | 80 |
| 2015-01-01_01:08:19 | 80 |
| 2015-01-01_01:08:20 | 80 |
| 2015-01-01_01:08:21 | 80 |
| 2015-01-01_01:08:22 | 79 |
| 2015-01-01_01:08:23 | 80 |
| 2015-01-01_01:08:24 | 80 |
| 2015-01-01_01:08:25 | 80 |
| 2015-01-01_01:08:26 | 80 |
| 2015-01-01_01:08:27 | 79 |
| 2015-01-01_01:08:28 | 80 |
| 2015-01-01_01:08:29 | 80 |
| 2015-01-01_01:08:30 | 80 |
| 2015-01-01_01:08:31 | 79 |
| 2015-01-01_01:08:32 | 80 |
| 2015-01-01_01:08:33 | 80 |
| 2015-01-01_01:08:34 | 80 |
| 2015-01-01_01:08:35 | 79 |
| 2015-01-01_01:08:36 | 80 |
| 2015-01-01_01:08:37 | 80 |
| 2015-01-01_01:08:38 | 80 |
| 2015-01-01_01:08:39 | 79 |
| 2015-01-01_01:08:40 | 80 |
| 2015-01-01_01:08:41 | 80 |
| 2015-01-01_01:08:42 | 80 |
| 2015-01-01_01:08:43 | 80 |
| 2015-01-01_01:08:44 | 80 |
| 2015-01-01_01:08:45 | 80 |
| 2015-01-01_01:08:46 | 80 |
| 2015-01-01_01:08:47 | 79 |
| 2015-01-01_01:08:48 | 80 |
| 2015-01-01_01:08:49 | 80 |
| 2015-01-01_01:08:50 | 79 |
| 2015-01-01_01:08:51 | 81 |
| 2015-01-01_01:08:52 | 82 |
| 2015-01-01_01:08:53 | 86 |
| 2015-01-01_01:08:54 | 88 |
| 2015-01-01_01:08:55 | 91 |
| 2015-01-01_01:08:56 | 91 |
| 2015-01-01_01:08:57 | 92 |
| 2015-01-01_01:08:58 | 92 |
| 2015-01-01_01:08:59 | 89 |
| 2015-01-01_01:09:00 | 90 |
| 2015-01-01_01:09:01 | 90 |
| 2015-01-01_01:09:02 | 90 |
| 2015-01-01_01:09:03 | 90 |
| 2015-01-01_01:09:04 | 90 |
| 2015-01-01_01:09:05 | 90 |
| 2015-01-01_01:09:06 | 90 |
| 2015-01-01_01:09:07 | 90 |
| 2015-01-01_01:09:08 | 90 |
| 2015-01-01_01:09:09 | 91 |
| 2015-01-01_01:09:10 | 90 |
| 2015-01-01_01:09:11 | 90 |
| 2015-01-01_01:09:12 | 90 |
| 2015-01-01_01:09:13 | 91 |
| 2015-01-01_01:09:14 | 90 |
| 2015-01-01_01:09:15 | 90 |
| 2015-01-01_01:09:16 | 90 |
| 2015-01-01_01:09:17 | 91 |
| 2015-01-01_01:09:18 | 90 |
| 2015-01-01_01:09:19 | 90 |
| 2015-01-01_01:09:20 | 90 |
| 2015-01-01_01:09:21 | 91 |
| 2015-01-01_01:09:22 | 90 |
| 2015-01-01_01:09:23 | 90 |
| 2015-01-01_01:09:24 | 90 |
| 2015-01-01_01:09:25 | 90 |
| 2015-01-01_01:09:26 | 90 |
| 2015-01-01_01:09:27 | 91 |
| 2015-01-01_01:09:28 | 90 |
| 2015-01-01_01:09:29 | 90 |
| 2015-01-01_01:09:30 | 90 |
| 2015-01-01_01:09:31 | 90 |
| 2015-01-01_01:09:32 | 91 |
| 2015-01-01_01:09:33 | 90 |
| 2015-01-01_01:09:34 | 90 |
| 2015-01-01_01:09:35 | 90 |
| 2015-01-01_01:09:36 | 90 |
| 2015-01-01_01:09:37 | 91 |
| 2015-01-01_01:09:38 | 90 |
| 2015-01-01_01:09:39 | 90 |
| 2015-01-01_01:09:40 | 90 |
| 2015-01-01_01:09:41 | 91 |
| 2015-01-01_01:09:42 | 90 |
| 2015-01-01_01:09:43 | 90 |
| 2015-01-01_01:09:44 | 90 |
| 2015-01-01_01:09:45 | 91 |
| 2015-01-01_01:09:46 | 90 |
| 2015-01-01_01:09:47 | 90 |
| 2015-01-01_01:09:48 | 90 |
| 2015-01-01_01:09:49 | 90 |
| 2015-01-01_01:09:50 | 90 |
| 2015-01-01_01:09:51 | 87 |
| 2015-01-01_01:09:52 | 86 |
| 2015-01-01_01:09:53 | 85 |
| 2015-01-01_01:09:54 | 82 |
| 2015-01-01_01:09:55 | 81 |
| 2015-01-01_01:09:56 | 80 |
| 2015-01-01_01:09:57 | 79 |
| 2015-01-01_01:09:58 | 78 |
| 2015-01-01_01:09:59 | 79 |
| 2015-01-01_01:10:00 | 79 |
| 2015-01-01_01:10:01 | 80 |
| 2015-01-01_01:10:02 | 79 |
| 2015-01-01_01:10:03 | 78 |
| 2015-01-01_01:10:04 | 79 |
| 2015-01-01_01:10:05 | 80 |
| 2015-01-01_01:10:06 | 81 |
| 2015-01-01_01:10:07 | 80 |
| 2015-01-01_01:10:08 | 79 |
| 2015-01-01_01:10:09 | 80 |
| 2015-01-01_01:10:10 | 80 |
| 2015-01-01_01:10:11 | 79 |
| 2015-01-01_01:10:12 | 80 |
| 2015-01-01_01:10:13 | 80 |
| 2015-01-01_01:10:14 | 80 |
| 2015-01-01_01:10:15 | 79 |
| 2015-01-01_01:10:16 | 80 |
| 2015-01-01_01:10:17 | 80 |
| 2015-01-01_01:10:18 | 79 |
| 2015-01-01_01:10:19 | 80 |
| 2015-01-01_01:10:20 | 79 |
| 2015-01-01_01:10:21 | 80 |
| 2015-01-01_01:10:22 | 80 |
| 2015-01-01_01:10:23 | 80 |
| 2015-01-01_01:10:24 | 79 |
| 2015-01-01_01:10:25 | 81 |
| 2015-01-01_01:10:26 | 79 |
| 2015-01-01_01:10:27 | 80 |
| 2015-01-01_01:10:28 | 80 |
| 2015-01-01_01:10:29 | 80 |
| 2015-01-01_01:10:30 | 79 |
| 2015-01-01_01:10:31 | 80 |
| 2015-01-01_01:10:32 | 80 |
| 2015-01-01_01:10:33 | 80 |
| 2015-01-01_01:10:34 | 79 |
| 2015-01-01_01:10:35 | 80 |
| 2015-01-01_01:10:36 | 80 |
| 2015-01-01_01:10:37 | 80 |
| 2015-01-01_01:10:38 | 80 |
| 2015-01-01_01:10:39 | 79 |
| 2015-01-01_01:10:40 | 80 |
| 2015-01-01_01:10:41 | 80 |
| 2015-01-01_01:10:42 | 78 |
| 2015-01-01_01:10:43 | 77 |
| 2015-01-01_01:10:44 | 72 |
| 2015-01-01_01:10:45 | 67 |
| 2015-01-01_01:10:46 | 64 |
| 2015-01-01_01:10:47 | 63 |
| 2015-01-01_01:10:48 | 60 |
| 2015-01-01_01:10:49 | 59 |
| 2015-01-01_01:10:50 | 58 |
| 2015-01-01_01:10:51 | 57 |
| 2015-01-01_01:10:52 | 56 |
| 2015-01-01_01:10:53 | 55 |
| 2015-01-01_01:10:54 | 56 |
| 2015-01-01_01:10:55 | 57 |
| 2015-01-01_01:10:56 | 58 |
| 2015-01-01_01:10:57 | 59 |
| 2015-01-01_01:10:58 | 60 |
| 2015-01-01_01:10:59 | 60 |
| 2015-01-01_01:11:00 | 60 |
| 2015-01-01_01:11:01 | 60 |
| 2015-01-01_01:11:02 | 61 |
| 2015-01-01_01:11:03 | 62 |
| 2015-01-01_01:11:04 | 63 |
| 2015-01-01_01:11:05 | 65 |
| 2015-01-01_01:11:06 | 66 |
| 2015-01-01_01:11:07 | 68 |
| 2015-01-01_01:11:08 | 68 |
| 2015-01-01_01:11:09 | 70 |
| 2015-01-01_01:11:10 | 70 |
| 2015-01-01_01:11:11 | 69 |
| 2015-01-01_01:11:12 | 70 |
| 2015-01-01_01:11:13 | 72 |
| 2015-01-01_01:11:14 | 70 |
| 2015-01-01_01:11:15 | 69 |
| 2015-01-01_01:11:16 | 68 |
| 2015-01-01_01:11:17 | 69 |
| 2015-01-01_01:11:18 | 68 |
| 2015-01-01_01:11:19 | 67 |
| 2015-01-01_01:11:20 | 66 |
| 2015-01-01_01:11:21 | 68 |
| 2015-01-01_01:11:22 | 69 |
| 2015-01-01_01:11:23 | 69 |
| 2015-01-01_01:11:24 | 69 |
| 2015-01-01_01:11:25 | 69 |
| 2015-01-01_01:11:26 | 70 |
| 2015-01-01_01:11:27 | 70 |
| 2015-01-01_01:11:28 | 70 |
| 2015-01-01_01:11:29 | 71 |
| 2015-01-01_01:11:30 | 70 |
| 2015-01-01_01:11:31 | 71 |
| 2015-01-01_01:11:32 | 70 |
| 2015-01-01_01:11:33 | 71 |
| 2015-01-01_01:11:34 | 71 |
| 2015-01-01_01:11:35 | 71 |
| 2015-01-01_01:11:36 | 71 |
| 2015-01-01_01:11:37 | 71 |
| 2015-01-01_01:11:38 | 72 |
| 2015-01-01_01:11:39 | 71 |
| 2015-01-01_01:11:40 | 70 |
| 2015-01-01_01:11:41 | 71 |
| 2015-01-01_01:11:42 | 70 |
| 2015-01-01_01:11:43 | 69 |
| 2015-01-01_01:11:44 | 70 |
| 2015-01-01_01:11:45 | 70 |
| 2015-01-01_01:11:46 | 70 |
| 2015-01-01_01:11:47 | 69 |
| 2015-01-01_01:11:48 | 68 |
| 2015-01-01_01:11:49 | 67 |
| 2015-01-01_01:11:50 | 65 |
| 2015-01-01_01:11:51 | 65 |
| 2015-01-01_01:11:52 | 63 |
| 2015-01-01_01:11:53 | 64 |
| 2015-01-01_01:11:54 | 64 |
| 2015-01-01_01:11:55 | 65 |
| 2015-01-01_01:11:56 | 67 |
| 2015-01-01_01:11:57 | 69 |
| 2015-01-01_01:11:58 | 71 |
| 2015-01-01_01:11:59 | 71 |
| 2015-01-01_01:12:00 | 73 |
| 2015-01-01_01:12:01 | 74 |
| 2015-01-01_01:12:02 | 73 |
| 2015-01-01_01:12:03 | 75 |
| 2015-01-01_01:12:04 | 74 |
| 2015-01-01_01:12:05 | 76 |
| 2015-01-01_01:12:06 | 74 |
| 2015-01-01_01:12:07 | 73 |
| 2015-01-01_01:12:08 | 71 |
| 2015-01-01_01:12:09 | 70 |
| 2015-01-01_01:12:10 | 68 |
| 2015-01-01_01:12:11 | 67 |
| 2015-01-01_01:12:12 | 66 |
| 2015-01-01_01:12:13 | 66 |
| 2015-01-01_01:12:14 | 65 |
| 2015-01-01_01:12:15 | 65 |
| 2015-01-01_01:12:16 | 63 |
| 2015-01-01_01:12:17 | 64 |
| 2015-01-01_01:12:18 | 65 |
| 2015-01-01_01:12:19 | 68 |
| 2015-01-01_01:12:20 | 71 |
| 2015-01-01_01:12:21 | 73 |
| 2015-01-01_01:12:22 | 76 |
| 2015-01-01_01:12:23 | 78 |
| 2015-01-01_01:12:24 | 77 |
| 2015-01-01_01:12:25 | 76 |
| 2015-01-01_01:12:26 | 75 |
| 2015-01-01_01:12:27 | 77 |
| 2015-01-01_01:12:28 | 77 |
| 2015-01-01_01:12:29 | 79 |
| 2015-01-01_01:12:30 | 79 |
| 2015-01-01_01:12:31 | 81 |
| 2015-01-01_01:12:32 | 80 |
| 2015-01-01_01:12:33 | 81 |
| 2015-01-01_01:12:34 | 81 |
| 2015-01-01_01:12:35 | 81 |
| 2015-01-01_01:12:36 | 81 |
| 2015-01-01_01:12:37 | 81 |
| 2015-01-01_01:12:38 | 81 |
| 2015-01-01_01:12:39 | 81 |
| 2015-01-01_01:12:40 | 81 |
| 2015-01-01_01:12:41 | 81 |
| 2015-01-01_01:12:42 | 81 |
| 2015-01-01_01:12:43 | 81 |
| 2015-01-01_01:12:44 | 81 |
| 2015-01-01_01:12:45 | 82 |
| 2015-01-01_01:12:46 | 84 |
| 2015-01-01_01:12:47 | 87 |
| 2015-01-01_01:12:48 | 89 |
| 2015-01-01_01:12:49 | 89 |
| 2015-01-01_01:12:50 | 89 |
| 2015-01-01_01:12:51 | 91 |
| 2015-01-01_01:12:52 | 90 |
| 2015-01-01_01:12:53 | 91 |
| 2015-01-01_01:12:54 | 90 |
| 2015-01-01_01:12:55 | 91 |
| 2015-01-01_01:12:56 | 90 |
| 2015-01-01_01:12:57 | 91 |
| 2015-01-01_01:12:58 | 91 |
| 2015-01-01_01:12:59 | 90 |
| 2015-01-01_01:13:00 | 91 |
| 2015-01-01_01:13:01 | 91 |
| 2015-01-01_01:13:02 | 90 |
| 2015-01-01_01:13:03 | 91 |
| 2015-01-01_01:13:04 | 91 |
| 2015-01-01_01:13:05 | 92 |
| 2015-01-01_01:13:06 | 90 |
| 2015-01-01_01:13:07 | 91 |
| 2015-01-01_01:13:08 | 91 |
| 2015-01-01_01:13:09 | 91 |
| 2015-01-01_01:13:10 | 90 |
| 2015-01-01_01:13:11 | 91 |
| 2015-01-01_01:13:12 | 91 |
| 2015-01-01_01:13:13 | 91 |
| 2015-01-01_01:13:14 | 90 |
| 2015-01-01_01:13:15 | 91 |
| 2015-01-01_01:13:16 | 91 |
| 2015-01-01_01:13:17 | 90 |
| 2015-01-01_01:13:18 | 91 |
| 2015-01-01_01:13:19 | 90 |
| 2015-01-01_01:13:20 | 91 |
| 2015-01-01_01:13:21 | 91 |
| 2015-01-01_01:13:22 | 91 |
| 2015-01-01_01:13:23 | 90 |
| 2015-01-01_01:13:24 | 91 |
| 2015-01-01_01:13:25 | 91 |
| 2015-01-01_01:13:26 | 91 |
| 2015-01-01_01:13:27 | 91 |
| 2015-01-01_01:13:28 | 91 |
| 2015-01-01_01:13:29 | 91 |
| 2015-01-01_01:13:30 | 91 |
| 2015-01-01_01:13:31 | 90 |
| 2015-01-01_01:13:32 | 91 |
| 2015-01-01_01:13:33 | 91 |
| 2015-01-01_01:13:34 | 91 |
| 2015-01-01_01:13:35 | 91 |
| 2015-01-01_01:13:36 | 90 |
| 2015-01-01_01:13:37 | 91 |
| 2015-01-01_01:13:38 | 91 |
| 2015-01-01_01:13:39 | 91 |
| 2015-01-01_01:13:40 | 90 |
| 2015-01-01_01:13:41 | 91 |
| 2015-01-01_01:13:42 | 91 |
| 2015-01-01_01:13:43 | 91 |
| 2015-01-01_01:13:44 | 90 |
| 2015-01-01_01:13:45 | 92 |
| 2015-01-01_01:13:46 | 90 |
| 2015-01-01_01:13:47 | 91 |
| 2015-01-01_01:13:48 | 91 |
| 2015-01-01_01:13:49 | 91 |
| 2015-01-01_01:13:50 | 91 |
| 2015-01-01_01:13:51 | 90 |
| 2015-01-01_01:13:52 | 91 |
| 2015-01-01_01:13:53 | 91 |
| 2015-01-01_01:13:54 | 91 |
| 2015-01-01_01:13:55 | 91 |
| 2015-01-01_01:13:56 | 91 |
| 2015-01-01_01:13:57 | 91 |
| 2015-01-01_01:13:58 | 91 |
| 2015-01-01_01:13:59 | 90 |
| 2015-01-01_01:14:00 | 91 |
| 2015-01-01_01:14:01 | 91 |
| 2015-01-01_01:14:02 | 91 |
| 2015-01-01_01:14:03 | 91 |
| 2015-01-01_01:14:04 | 90 |
| 2015-01-01_01:14:05 | 90 |
| 2015-01-01_01:14:06 | 87 |
| 2015-01-01_01:14:07 | 86 |
| 2015-01-01_01:14:08 | 85 |
| 2015-01-01_01:14:09 | 83 |
| 2015-01-01_01:14:10 | 81 |
| 2015-01-01_01:14:11 | 80 |
| 2015-01-01_01:14:12 | 79 |
| 2015-01-01_01:14:13 | 77 |
| 2015-01-01_01:14:14 | 76 |
| 2015-01-01_01:14:15 | 74 |
| 2015-01-01_01:14:16 | 73 |
| 2015-01-01_01:14:17 | 72 |
| 2015-01-01_01:14:18 | 71 |
| 2015-01-01_01:14:19 | 69 |
| 2015-01-01_01:14:20 | 67 |
| 2015-01-01_01:14:21 | 62 |
| 2015-01-01_01:14:22 | 56 |
| 2015-01-01_01:14:23 | 51 |
| 2015-01-01_01:14:24 | 46 |
| 2015-01-01_01:14:25 | 43 |
| 2015-01-01_01:14:26 | 40 |
| 2015-01-01_01:14:27 | 39 |
| 2015-01-01_01:14:28 | 39 |
| 2015-01-01_01:14:29 | 39 |
| 2015-01-01_01:14:30 | 43 |
| 2015-01-01_01:14:31 | 47 |
| 2015-01-01_01:14:32 | 49 |
| 2015-01-01_01:14:33 | 54 |
| 2015-01-01_01:14:34 | 54 |
| 2015-01-01_01:14:35 | 55 |
| 2015-01-01_01:14:36 | 59 |
| 2015-01-01_01:14:37 | 61 |
| 2015-01-01_01:14:38 | 64 |
| 2015-01-01_01:14:39 | 66 |
| 2015-01-01_01:14:40 | 67 |
| 2015-01-01_01:14:41 | 71 |
| 2015-01-01_01:14:42 | 72 |
| 2015-01-01_01:14:43 | 71 |
| 2015-01-01_01:14:44 | 71 |
| 2015-01-01_01:14:45 | 73 |
| 2015-01-01_01:14:46 | 73 |
| 2015-01-01_01:14:47 | 71 |
| 2015-01-01_01:14:48 | 72 |
| 2015-01-01_01:14:49 | 74 |
| 2015-01-01_01:14:50 | 75 |
| 2015-01-01_01:14:51 | 76 |
| 2015-01-01_01:14:52 | 77 |
| 2015-01-01_01:14:53 | 77 |
| 2015-01-01_01:14:54 | 79 |
| 2015-01-01_01:14:55 | 78 |
| 2015-01-01_01:14:56 | 78 |
| 2015-01-01_01:14:57 | 80 |
| 2015-01-01_01:14:58 | 80 |
| 2015-01-01_01:14:59 | 80 |
| 2015-01-01_01:15:00 | 79 |
| 2015-01-01_01:15:01 | 80 |
| 2015-01-01_01:15:02 | 81 |
| 2015-01-01_01:15:03 | 80 |
| 2015-01-01_01:15:04 | 81 |
| 2015-01-01_01:15:05 | 80 |
| 2015-01-01_01:15:06 | 81 |
| 2015-01-01_01:15:07 | 80 |
| 2015-01-01_01:15:08 | 80 |
| 2015-01-01_01:15:09 | 80 |
| 2015-01-01_01:15:10 | 81 |
| 2015-01-01_01:15:11 | 80 |
| 2015-01-01_01:15:12 | 81 |
| 2015-01-01_01:15:13 | 80 |
| 2015-01-01_01:15:14 | 78 |
| 2015-01-01_01:15:15 | 78 |
| 2015-01-01_01:15:16 | 77 |
| 2015-01-01_01:15:17 | 78 |
| 2015-01-01_01:15:18 | 76 |
| 2015-01-01_01:15:19 | 74 |
| 2015-01-01_01:15:20 | 74 |
| 2015-01-01_01:15:21 | 73 |
| 2015-01-01_01:15:22 | 73 |
| 2015-01-01_01:15:23 | 72 |
| 2015-01-01_01:15:24 | 70 |
| 2015-01-01_01:15:25 | 70 |
| 2015-01-01_01:15:26 | 69 |
| 2015-01-01_01:15:27 | 67 |
| 2015-01-01_01:15:28 | 67 |
| 2015-01-01_01:15:29 | 65 |
| 2015-01-01_01:15:30 | 62 |
| 2015-01-01_01:15:31 | 60 |
| 2015-01-01_01:15:32 | 58 |
| 2015-01-01_01:15:33 | 59 |
| 2015-01-01_01:15:34 | 58 |
| 2015-01-01_01:15:35 | 59 |
| 2015-01-01_01:15:36 | 61 |
| 2015-01-01_01:15:37 | 61 |
| 2015-01-01_01:15:38 | 63 |
| 2015-01-01_01:15:39 | 64 |
| 2015-01-01_01:15:40 | 66 |
| 2015-01-01_01:15:41 | 67 |
| 2015-01-01_01:15:42 | 67 |
| 2015-01-01_01:15:43 | 68 |
| 2015-01-01_01:15:44 | 70 |
| 2015-01-01_01:15:45 | 71 |
| 2015-01-01_01:15:46 | 70 |
| 2015-01-01_01:15:47 | 73 |
| 2015-01-01_01:15:48 | 74 |
| 2015-01-01_01:15:49 | 76 |
| 2015-01-01_01:15:50 | 76 |
| 2015-01-01_01:15:51 | 76 |
| 2015-01-01_01:15:52 | 77 |
| 2015-01-01_01:15:53 | 76 |
| 2015-01-01_01:15:54 | 75 |
| 2015-01-01_01:15:55 | 74 |
| 2015-01-01_01:15:56 | 73 |
| 2015-01-01_01:15:57 | 72 |
| 2015-01-01_01:15:58 | 71 |
| 2015-01-01_01:15:59 | 70 |
| 2015-01-01_01:16:00 | 70 |
| 2015-01-01_01:16:01 | 71 |
| 2015-01-01_01:16:02 | 72 |
| 2015-01-01_01:16:03 | 73 |
| 2015-01-01_01:16:04 | 73 |
| 2015-01-01_01:16:05 | 74 |
| 2015-01-01_01:16:06 | 74 |
| 2015-01-01_01:16:07 | 75 |
| 2015-01-01_01:16:08 | 76 |
| 2015-01-01_01:16:09 | 76 |
| 2015-01-01_01:16:10 | 76 |
| 2015-01-01_01:16:11 | 75 |
| 2015-01-01_01:16:12 | 78 |
| 2015-01-01_01:16:13 | 77 |
| 2015-01-01_01:16:14 | 78 |
| 2015-01-01_01:16:15 | 76 |
| 2015-01-01_01:16:16 | 76 |
| 2015-01-01_01:16:17 | 76 |
| 2015-01-01_01:16:18 | 75 |
| 2015-01-01_01:16:19 | 74 |
| 2015-01-01_01:16:20 | 75 |
| 2015-01-01_01:16:21 | 75 |
| 2015-01-01_01:16:22 | 75 |
| 2015-01-01_01:16:23 | 75 |
| 2015-01-01_01:16:24 | 75 |
| 2015-01-01_01:16:25 | 76 |
| 2015-01-01_01:16:26 | 75 |
| 2015-01-01_01:16:27 | 76 |
| 2015-01-01_01:16:28 | 75 |
| 2015-01-01_01:16:29 | 76 |
| 2015-01-01_01:16:30 | 75 |
| 2015-01-01_01:16:31 | 75 |
| 2015-01-01_01:16:32 | 75 |
| 2015-01-01_01:16:33 | 77 |
| 2015-01-01_01:16:34 | 76 |
| 2015-01-01_01:16:35 | 76 |
| 2015-01-01_01:16:36 | 76 |
| 2015-01-01_01:16:37 | 77 |
| 2015-01-01_01:16:38 | 78 |
| 2015-01-01_01:16:39 | 79 |
| 2015-01-01_01:16:40 | 80 |
| 2015-01-01_01:16:41 | 81 |
| 2015-01-01_01:16:42 | 82 |
| 2015-01-01_01:16:43 | 81 |
| 2015-01-01_01:16:44 | 81 |
| 2015-01-01_01:16:45 | 82 |
| 2015-01-01_01:16:46 | 81 |
| 2015-01-01_01:16:47 | 80 |
| 2015-01-01_01:16:48 | 79 |
| 2015-01-01_01:16:49 | 79 |
| 2015-01-01_01:16:50 | 78 |
| 2015-01-01_01:16:51 | 78 |
| 2015-01-01_01:16:52 | 78 |
| 2015-01-01_01:16:53 | 81 |
| 2015-01-01_01:16:54 | 80 |
| 2015-01-01_01:16:55 | 81 |
| 2015-01-01_01:16:56 | 79 |
| 2015-01-01_01:16:57 | 79 |
| 2015-01-01_01:16:58 | 78 |
| 2015-01-01_01:16:59 | 78 |
| 2015-01-01_01:17:00 | 77 |
| 2015-01-01_01:17:01 | 77 |
| 2015-01-01_01:17:02 | 76 |
| 2015-01-01_01:17:03 | 77 |
| 2015-01-01_01:17:04 | 77 |
| 2015-01-01_01:17:05 | 78 |
| 2015-01-01_01:17:06 | 79 |
| 2015-01-01_01:17:07 | 78 |
| 2015-01-01_01:17:08 | 78 |
| 2015-01-01_01:17:09 | 78 |
| 2015-01-01_01:17:10 | 78 |
| 2015-01-01_01:17:11 | 77 |
| 2015-01-01_01:17:12 | 77 |
| 2015-01-01_01:17:13 | 78 |
| 2015-01-01_01:17:14 | 76 |
| 2015-01-01_01:17:15 | 76 |
| 2015-01-01_01:17:16 | 76 |
| 2015-01-01_01:17:17 | 76 |
| 2015-01-01_01:17:18 | 76 |
| 2015-01-01_01:17:19 | 76 |
| 2015-01-01_01:17:20 | 76 |
| 2015-01-01_01:17:21 | 77 |
| 2015-01-01_01:17:22 | 76 |
| 2015-01-01_01:17:23 | 74 |
| 2015-01-01_01:17:24 | 72 |
| 2015-01-01_01:17:25 | 73 |
| 2015-01-01_01:17:26 | 72 |
| 2015-01-01_01:17:27 | 73 |
| 2015-01-01_01:17:28 | 73 |
| 2015-01-01_01:17:29 | 72 |
| 2015-01-01_01:17:30 | 71 |
| 2015-01-01_01:17:31 | 72 |
| 2015-01-01_01:17:32 | 71 |
| 2015-01-01_01:17:33 | 71 |
| 2015-01-01_01:17:34 | 71 |
| 2015-01-01_01:17:35 | 73 |
| 2015-01-01_01:17:36 | 74 |
| 2015-01-01_01:17:37 | 74 |
| 2015-01-01_01:17:38 | 74 |
| 2015-01-01_01:17:39 | 73 |
| 2015-01-01_01:17:40 | 73 |
| 2015-01-01_01:17:41 | 72 |
| 2015-01-01_01:17:42 | 70 |
| 2015-01-01_01:17:43 | 68 |
| 2015-01-01_01:17:44 | 66 |
| 2015-01-01_01:17:45 | 66 |
| 2015-01-01_01:17:46 | 58 |
| 2015-01-01_01:17:47 | 47 |
| 2015-01-01_01:17:48 | 39 |
| 2015-01-01_01:17:49 | 32 |
| 2015-01-01_01:17:50 | 27 |
| 2015-01-01_01:17:51 | 24 |
| 2015-01-01_01:17:52 | 23 |
| 2015-01-01_01:17:53 | 21 |
| 2015-01-01_01:17:54 | 19 |
| 2015-01-01_01:17:55 | 18 |
| 2015-01-01_01:17:56 | 14 |
| 2015-01-01_01:17:57 | 9 |
| 2015-01-01_01:17:58 | 7 |
| 2015-01-01_01:17:59 | 4 |
| 2015-01-01_01:18:00 | 3 |
| 2015-01-01_01:18:01 | 0 |
| 2015-01-01_01:18:02 | 0 |
| 2015-01-01_01:18:03 | 0 |
| 2015-01-01_01:18:04 | 0 |
| 2015-01-01_01:18:05 | 0 |
| 2015-01-01_01:18:06 | 0 |
| 2015-01-01_01:18:07 | 0 |
| 2015-01-01_01:18:08 | 0 |
| 2015-01-01_01:18:09 | 0 |
| 2015-01-01_01:18:10 | 4 |
| 2015-01-01_01:18:11 | 11 |
| 2015-01-01_01:18:12 | 19 |
| 2015-01-01_01:18:13 | 21 |
| 2015-01-01_01:18:14 | 26 |
| 2015-01-01_01:18:15 | 33 |
| 2015-01-01_01:18:16 | 34 |
| 2015-01-01_01:18:17 | 37 |
| 2015-01-01_01:18:18 | 43 |
| 2015-01-01_01:18:19 | 46 |
| 2015-01-01_01:18:20 | 49 |
| 2015-01-01_01:18:21 | 51 |
| 2015-01-01_01:18:22 | 53 |
| 2015-01-01_01:18:23 | 53 |
| 2015-01-01_01:18:24 | 56 |
| 2015-01-01_01:18:25 | 60 |
| 2015-01-01_01:18:26 | 60 |
| 2015-01-01_01:18:27 | 62 |
| 2015-01-01_01:18:28 | 63 |
| 2015-01-01_01:18:29 | 66 |
| 2015-01-01_01:18:30 | 68 |
| 2015-01-01_01:18:31 | 67 |
| 2015-01-01_01:18:32 | 67 |
| 2015-01-01_01:18:33 | 71 |
| 2015-01-01_01:18:34 | 71 |
| 2015-01-01_01:18:35 | 74 |
| 2015-01-01_01:18:36 | 76 |
| 2015-01-01_01:18:37 | 77 |
| 2015-01-01_01:18:38 | 77 |
| 2015-01-01_01:18:39 | 77 |
| 2015-01-01_01:18:40 | 77 |
| 2015-01-01_01:18:41 | 75 |
| 2015-01-01_01:18:42 | 75 |
| 2015-01-01_01:18:43 | 73 |
| 2015-01-01_01:18:44 | 74 |
| 2015-01-01_01:18:45 | 76 |
| 2015-01-01_01:18:46 | 77 |
| 2015-01-01_01:18:47 | 77 |
| 2015-01-01_01:18:48 | 78 |
| 2015-01-01_01:18:49 | 78 |
| 2015-01-01_01:18:50 | 79 |
| 2015-01-01_01:18:51 | 79 |
| 2015-01-01_01:18:52 | 80 |
| 2015-01-01_01:18:53 | 80 |
| 2015-01-01_01:18:54 | 81 |
| 2015-01-01_01:18:55 | 80 |
| 2015-01-01_01:18:56 | 81 |
| 2015-01-01_01:18:57 | 82 |
| 2015-01-01_01:18:58 | 82 |
| 2015-01-01_01:18:59 | 83 |
| 2015-01-01_01:19:00 | 82 |
| 2015-01-01_01:19:01 | 83 |
| 2015-01-01_01:19:02 | 83 |
| 2015-01-01_01:19:03 | 83 |
| 2015-01-01_01:19:04 | 82 |
| 2015-01-01_01:19:05 | 82 |
| 2015-01-01_01:19:06 | 83 |
| 2015-01-01_01:19:07 | 84 |
| 2015-01-01_01:19:08 | 86 |
| 2015-01-01_01:19:09 | 86 |
| 2015-01-01_01:19:10 | 85 |
| 2015-01-01_01:19:11 | 86 |
| 2015-01-01_01:19:12 | 87 |
| 2015-01-01_01:19:13 | 88 |
| 2015-01-01_01:19:14 | 88 |
| 2015-01-01_01:19:15 | 88 |
| 2015-01-01_01:19:16 | 88 |
| 2015-01-01_01:19:17 | 89 |
| 2015-01-01_01:19:18 | 88 |
| 2015-01-01_01:19:19 | 87 |
| 2015-01-01_01:19:20 | 88 |
| 2015-01-01_01:19:21 | 87 |
| 2015-01-01_01:19:22 | 88 |
| 2015-01-01_01:19:23 | 87 |
| 2015-01-01_01:19:24 | 87 |
| 2015-01-01_01:19:25 | 88 |
| 2015-01-01_01:19:26 | 88 |
| 2015-01-01_01:19:27 | 88 |
| 2015-01-01_01:19:28 | 89 |
| 2015-01-01_01:19:29 | 89 |
| 2015-01-01_01:19:30 | 87 |
| 2015-01-01_01:19:31 | 88 |
| 2015-01-01_01:19:32 | 86 |
| 2015-01-01_01:19:33 | 87 |
| 2015-01-01_01:19:34 | 87 |
| 2015-01-01_01:19:35 | 86 |
| 2015-01-01_01:19:36 | 85 |
| 2015-01-01_01:19:37 | 85 |
| 2015-01-01_01:19:38 | 83 |
| 2015-01-01_01:19:39 | 82 |
| 2015-01-01_01:19:40 | 82 |
| 2015-01-01_01:19:41 | 80 |
| 2015-01-01_01:19:42 | 78 |
| 2015-01-01_01:19:43 | 77 |
| 2015-01-01_01:19:44 | 75 |
| 2015-01-01_01:19:45 | 74 |
| 2015-01-01_01:19:46 | 72 |
| 2015-01-01_01:19:47 | 70 |
| 2015-01-01_01:19:48 | 70 |
| 2015-01-01_01:19:49 | 70 |
| 2015-01-01_01:19:50 | 71 |
| 2015-01-01_01:19:51 | 72 |
| 2015-01-01_01:19:52 | 72 |
| 2015-01-01_01:19:53 | 72 |
| 2015-01-01_01:19:54 | 71 |
| 2015-01-01_01:19:55 | 72 |
| 2015-01-01_01:19:56 | 71 |
| 2015-01-01_01:19:57 | 70 |
| 2015-01-01_01:19:58 | 72 |
| 2015-01-01_01:19:59 | 72 |
| 2015-01-01_01:20:00 | 72 |
| 2015-01-01_01:20:01 | 73 |
| 2015-01-01_01:20:02 | 72 |
| 2015-01-01_01:20:03 | 73 |
| 2015-01-01_01:20:04 | 74 |
| 2015-01-01_01:20:05 | 76 |
| 2015-01-01_01:20:06 | 76 |
| 2015-01-01_01:20:07 | 79 |
| 2015-01-01_01:20:08 | 79 |
| 2015-01-01_01:20:09 | 80 |
| 2015-01-01_01:20:10 | 80 |
| 2015-01-01_01:20:11 | 79 |
| 2015-01-01_01:20:12 | 79 |
| 2015-01-01_01:20:13 | 79 |
| 2015-01-01_01:20:14 | 80 |
| 2015-01-01_01:20:15 | 81 |
| 2015-01-01_01:20:16 | 81 |
| 2015-01-01_01:20:17 | 83 |
| 2015-01-01_01:20:18 | 83 |
| 2015-01-01_01:20:19 | 84 |
| 2015-01-01_01:20:20 | 84 |
| 2015-01-01_01:20:21 | 85 |
| 2015-01-01_01:20:22 | 83 |
| 2015-01-01_01:20:23 | 83 |
| 2015-01-01_01:20:24 | 81 |
| 2015-01-01_01:20:25 | 81 |
| 2015-01-01_01:20:26 | 80 |
| 2015-01-01_01:20:27 | 81 |
| 2015-01-01_01:20:28 | 80 |
| 2015-01-01_01:20:29 | 81 |
| 2015-01-01_01:20:30 | 80 |
| 2015-01-01_01:20:31 | 79 |
| 2015-01-01_01:20:32 | 80 |
| 2015-01-01_01:20:33 | 79 |
| 2015-01-01_01:20:34 | 80 |
| 2015-01-01_01:20:35 | 79 |
| 2015-01-01_01:20:36 | 79 |
| 2015-01-01_01:20:37 | 79 |
| 2015-01-01_01:20:38 | 79 |
| 2015-01-01_01:20:39 | 79 |
| 2015-01-01_01:20:40 | 77 |
| 2015-01-01_01:20:41 | 78 |
| 2015-01-01_01:20:42 | 77 |
| 2015-01-01_01:20:43 | 76 |
| 2015-01-01_01:20:44 | 77 |
| 2015-01-01_01:20:45 | 78 |
| 2015-01-01_01:20:46 | 78 |
| 2015-01-01_01:20:47 | 79 |
| 2015-01-01_01:20:48 | 78 |
| 2015-01-01_01:20:49 | 78 |
| 2015-01-01_01:20:50 | 79 |
| 2015-01-01_01:20:51 | 80 |
| 2015-01-01_01:20:52 | 81 |
| 2015-01-01_01:20:53 | 81 |
| 2015-01-01_01:20:54 | 80 |
| 2015-01-01_01:20:55 | 79 |
| 2015-01-01_01:20:56 | 78 |
| 2015-01-01_01:20:57 | 78 |
| 2015-01-01_01:20:58 | 78 |
| 2015-01-01_01:20:59 | 78 |
| 2015-01-01_01:21:00 | 78 |
| 2015-01-01_01:21:01 | 78 |
| 2015-01-01_01:21:02 | 76 |
| 2015-01-01_01:21:03 | 74 |
| 2015-01-01_01:21:04 | 73 |
| 2015-01-01_01:21:05 | 74 |
| 2015-01-01_01:21:06 | 75 |
| 2015-01-01_01:21:07 | 77 |
| 2015-01-01_01:21:08 | 76 |
| 2015-01-01_01:21:09 | 74 |
| 2015-01-01_01:21:10 | 73 |
| 2015-01-01_01:21:11 | 72 |
| 2015-01-01_01:21:12 | 73 |
| 2015-01-01_01:21:13 | 73 |
| 2015-01-01_01:21:14 | 72 |
| 2015-01-01_01:21:15 | 73 |
| 2015-01-01_01:21:16 | 73 |
| 2015-01-01_01:21:17 | 74 |
| 2015-01-01_01:21:18 | 75 |
| 2015-01-01_01:21:19 | 74 |
| 2015-01-01_01:21:20 | 74 |
| 2015-01-01_01:21:21 | 75 |
| 2015-01-01_01:21:22 | 74 |
| 2015-01-01_01:21:23 | 72 |
| 2015-01-01_01:21:24 | 72 |
| 2015-01-01_01:21:25 | 70 |
| 2015-01-01_01:21:26 | 69 |
| 2015-01-01_01:21:27 | 69 |
| 2015-01-01_01:21:28 | 67 |
| 2015-01-01_01:21:29 | 66 |
| 2015-01-01_01:21:30 | 66 |
| 2015-01-01_01:21:31 | 65 |
| 2015-01-01_01:21:32 | 66 |
| 2015-01-01_01:21:33 | 65 |
| 2015-01-01_01:21:34 | 64 |
| 2015-01-01_01:21:35 | 63 |
| 2015-01-01_01:21:36 | 64 |
| 2015-01-01_01:21:37 | 64 |
| 2015-01-01_01:21:38 | 66 |
| 2015-01-01_01:21:39 | 68 |
| 2015-01-01_01:21:40 | 69 |
| 2015-01-01_01:21:41 | 70 |
| 2015-01-01_01:21:42 | 71 |
| 2015-01-01_01:21:43 | 72 |
| 2015-01-01_01:21:44 | 72 |
| 2015-01-01_01:21:45 | 70 |
| 2015-01-01_01:21:46 | 70 |
| 2015-01-01_01:21:47 | 68 |
| 2015-01-01_01:21:48 | 67 |
| 2015-01-01_01:21:49 | 65 |
| 2015-01-01_01:21:50 | 66 |
| 2015-01-01_01:21:51 | 66 |
| 2015-01-01_01:21:52 | 67 |
| 2015-01-01_01:21:53 | 66 |
| 2015-01-01_01:21:54 | 65 |
| 2015-01-01_01:21:55 | 65 |
| 2015-01-01_01:21:56 | 66 |
| 2015-01-01_01:21:57 | 66 |
| 2015-01-01_01:21:58 | 65 |
| 2015-01-01_01:21:59 | 66 |
| 2015-01-01_01:22:00 | 66 |
| 2015-01-01_01:22:01 | 67 |
| 2015-01-01_01:22:02 | 67 |
| 2015-01-01_01:22:03 | 68 |
| 2015-01-01_01:22:04 | 70 |
| 2015-01-01_01:22:05 | 70 |
| 2015-01-01_01:22:06 | 71 |
| 2015-01-01_01:22:07 | 71 |
| 2015-01-01_01:22:08 | 73 |
| 2015-01-01_01:22:09 | 74 |
| 2015-01-01_01:22:10 | 76 |
| 2015-01-01_01:22:11 | 77 |
| 2015-01-01_01:22:12 | 79 |
| 2015-01-01_01:22:13 | 79 |
| 2015-01-01_01:22:14 | 78 |
| 2015-01-01_01:22:15 | 78 |
| 2015-01-01_01:22:16 | 76 |
| 2015-01-01_01:22:17 | 75 |
| 2015-01-01_01:22:18 | 72 |
| 2015-01-01_01:22:19 | 71 |
| 2015-01-01_01:22:20 | 70 |
| 2015-01-01_01:22:21 | 68 |
| 2015-01-01_01:22:22 | 66 |
| 2015-01-01_01:22:23 | 65 |
| 2015-01-01_01:22:24 | 63 |
| 2015-01-01_01:22:25 | 62 |
| 2015-01-01_01:22:26 | 61 |
| 2015-01-01_01:22:27 | 62 |
| 2015-01-01_01:22:28 | 65 |
| 2015-01-01_01:22:29 | 66 |
| 2015-01-01_01:22:30 | 67 |
| 2015-01-01_01:22:31 | 67 |
| 2015-01-01_01:22:32 | 69 |
| 2015-01-01_01:22:33 | 68 |
| 2015-01-01_01:22:34 | 68 |
| 2015-01-01_01:22:35 | 69 |
| 2015-01-01_01:22:36 | 69 |
| 2015-01-01_01:22:37 | 69 |
| 2015-01-01_01:22:38 | 69 |
| 2015-01-01_01:22:39 | 69 |
| 2015-01-01_01:22:40 | 69 |
| 2015-01-01_01:22:41 | 70 |
| 2015-01-01_01:22:42 | 70 |
| 2015-01-01_01:22:43 | 70 |
| 2015-01-01_01:22:44 | 70 |
| 2015-01-01_01:22:45 | 69 |
| 2015-01-01_01:22:46 | 70 |
| 2015-01-01_01:22:47 | 70 |
| 2015-01-01_01:22:48 | 71 |
| 2015-01-01_01:22:49 | 70 |
| 2015-01-01_01:22:50 | 69 |
| 2015-01-01_01:22:51 | 68 |
| 2015-01-01_01:22:52 | 68 |
| 2015-01-01_01:22:53 | 68 |
| 2015-01-01_01:22:54 | 67 |
| 2015-01-01_01:22:55 | 68 |
| 2015-01-01_01:22:56 | 70 |
| 2015-01-01_01:22:57 | 71 |
| 2015-01-01_01:22:58 | 72 |
| 2015-01-01_01:22:59 | 73 |
| 2015-01-01_01:23:00 | 72 |
| 2015-01-01_01:23:01 | 73 |
| 2015-01-01_01:23:02 | 73 |
| 2015-01-01_01:23:03 | 72 |
| 2015-01-01_01:23:04 | 72 |
| 2015-01-01_01:23:05 | 71 |
| 2015-01-01_01:23:06 | 69 |
| 2015-01-01_01:23:07 | 69 |
| 2015-01-01_01:23:08 | 68 |
| 2015-01-01_01:23:09 | 67 |
| 2015-01-01_01:23:10 | 68 |
| 2015-01-01_01:23:11 | 68 |
| 2015-01-01_01:23:12 | 67 |
| 2015-01-01_01:23:13 | 68 |
| 2015-01-01_01:23:14 | 67 |
| 2015-01-01_01:23:15 | 67 |
| 2015-01-01_01:23:16 | 66 |
| 2015-01-01_01:23:17 | 68 |
| 2015-01-01_01:23:18 | 69 |
| 2015-01-01_01:23:19 | 69 |
| 2015-01-01_01:23:20 | 69 |
| 2015-01-01_01:23:21 | 70 |
| 2015-01-01_01:23:22 | 70 |
| 2015-01-01_01:23:23 | 70 |
| 2015-01-01_01:23:24 | 71 |
| 2015-01-01_01:23:25 | 71 |
| 2015-01-01_01:23:26 | 71 |
| 2015-01-01_01:23:27 | 72 |
| 2015-01-01_01:23:28 | 73 |
| 2015-01-01_01:23:29 | 74 |
| 2015-01-01_01:23:30 | 74 |
| 2015-01-01_01:23:31 | 73 |
| 2015-01-01_01:23:32 | 73 |
| 2015-01-01_01:23:33 | 73 |
| 2015-01-01_01:23:34 | 72 |
| 2015-01-01_01:23:35 | 71 |
| 2015-01-01_01:23:36 | 69 |
| 2015-01-01_01:23:37 | 68 |
| 2015-01-01_01:23:38 | 67 |
| 2015-01-01_01:23:39 | 67 |
| 2015-01-01_01:23:40 | 68 |
| 2015-01-01_01:23:41 | 70 |
| 2015-01-01_01:23:42 | 69 |
| 2015-01-01_01:23:43 | 69 |
| 2015-01-01_01:23:44 | 68 |
| 2015-01-01_01:23:45 | 68 |
| 2015-01-01_01:23:46 | 67 |
| 2015-01-01_01:23:47 | 67 |
| 2015-01-01_01:23:48 | 66 |
| 2015-01-01_01:23:49 | 65 |
| 2015-01-01_01:23:50 | 66 |
| 2015-01-01_01:23:51 | 65 |
| 2015-01-01_01:23:52 | 64 |
| 2015-01-01_01:23:53 | 63 |
| 2015-01-01_01:23:54 | 62 |
| 2015-01-01_01:23:55 | 62 |
| 2015-01-01_01:23:56 | 62 |
| 2015-01-01_01:23:57 | 61 |
| 2015-01-01_01:23:58 | 60 |
| 2015-01-01_01:23:59 | 60 |
| 2015-01-01_01:24:00 | 61 |
| 2015-01-01_01:24:01 | 61 |
| 2015-01-01_01:24:02 | 61 |
| 2015-01-01_01:24:03 | 61 |
| 2015-01-01_01:24:04 | 61 |
| 2015-01-01_01:24:05 | 61 |
| 2015-01-01_01:24:06 | 60 |
| 2015-01-01_01:24:07 | 58 |
| 2015-01-01_01:24:08 | 56 |
| 2015-01-01_01:24:09 | 54 |
| 2015-01-01_01:24:10 | 51 |
| 2015-01-01_01:24:11 | 49 |
| 2015-01-01_01:24:12 | 44 |
| 2015-01-01_01:24:13 | 38 |
| 2015-01-01_01:24:14 | 30 |
| 2015-01-01_01:24:15 | 24 |
| 2015-01-01_01:24:16 | 20 |
| 2015-01-01_01:24:17 | 17 |
| 2015-01-01_01:24:18 | 16 |
| 2015-01-01_01:24:19 | 16 |
| 2015-01-01_01:24:20 | 14 |
| 2015-01-01_01:24:21 | 16 |
| 2015-01-01_01:24:22 | 20 |
| 2015-01-01_01:24:23 | 24 |
| 2015-01-01_01:24:24 | 26 |
| 2015-01-01_01:24:25 | 29 |
| 2015-01-01_01:24:26 | 30 |
| 2015-01-01_01:24:27 | 32 |
| 2015-01-01_01:24:28 | 31 |
| 2015-01-01_01:24:29 | 31 |
| 2015-01-01_01:24:30 | 31 |
| 2015-01-01_01:24:31 | 34 |
| 2015-01-01_01:24:32 | 37 |
| 2015-01-01_01:24:33 | 43 |
| 2015-01-01_01:24:34 | 46 |
| 2015-01-01_01:24:35 | 49 |
| 2015-01-01_01:24:36 | 50 |
| 2015-01-01_01:24:37 | 54 |
| 2015-01-01_01:24:38 | 52 |
| 2015-01-01_01:24:39 | 47 |
| 2015-01-01_01:24:40 | 43 |
| 2015-01-01_01:24:41 | 44 |
| 2015-01-01_01:24:42 | 44 |
| 2015-01-01_01:24:43 | 43 |
| 2015-01-01_01:24:44 | 41 |
| 2015-01-01_01:24:45 | 37 |
| 2015-01-01_01:24:46 | 34 |
| 2015-01-01_01:24:47 | 33 |
| 2015-01-01_01:24:48 | 34 |
| 2015-01-01_01:24:49 | 39 |
| 2015-01-01_01:24:50 | 41 |
| 2015-01-01_01:24:51 | 40 |
| 2015-01-01_01:24:52 | 41 |
| 2015-01-01_01:24:53 | 44 |
| 2015-01-01_01:24:54 | 45 |
| 2015-01-01_01:24:55 | 43 |
| 2015-01-01_01:24:56 | 41 |
| 2015-01-01_01:24:57 | 39 |
| 2015-01-01_01:24:58 | 36 |
| 2015-01-01_01:24:59 | 35 |
| 2015-01-01_01:25:00 | 32 |
| 2015-01-01_01:25:01 | 25 |
| 2015-01-01_01:25:02 | 22 |
| 2015-01-01_01:25:03 | 20 |
| 2015-01-01_01:25:04 | 19 |
| 2015-01-01_01:25:05 | 15 |
| 2015-01-01_01:25:06 | 11 |
| 2015-01-01_01:25:07 | 5 |
| 2015-01-01_01:25:08 | 1 |
| 2015-01-01_01:25:09 | 0 |
| 2015-01-01_01:25:10 | 0 |
| 2015-01-01_01:25:11 | 0 |
| 2015-01-01_01:25:12 | 0 |
| 2015-01-01_01:25:13 | 0 |
| 2015-01-01_01:25:14 | 0 |
| 2015-01-01_01:25:15 | 0 |
| 2015-01-01_01:25:16 | 0 |
| 2015-01-01_01:25:17 | 0 |
| 2015-01-01_01:25:18 | 0 |
| 2015-01-01_01:25:19 | 0 |
| 2015-01-01_01:25:20 | 0 |
| 2015-01-01_01:25:21 | 0 |
| 2015-01-01_01:25:22 | 0 |
| 2015-01-01_01:25:23 | 0 |
| 2015-01-01_01:25:24 | 0 |
| 2015-01-01_01:25:25 | 0 |
| 2015-01-01_01:25:26 | 0 |
| 2015-01-01_01:25:27 | 0 |
| 2015-01-01_01:25:28 | 0 |
| 2015-01-01_01:25:29 | 0 |
| 2015-01-01_01:25:30 | 0 |
| 2015-01-01_01:25:31 | 0 |
| 2015-01-01_01:25:32 | 0 |
| 2015-01-01_01:25:33 | 0 |
| 2015-01-01_01:25:34 | 0 |
| 2015-01-01_01:25:35 | 0 |
| 2015-01-01_01:25:36 | 0 |
| 2015-01-01_01:25:37 | 0 |
| 2015-01-01_01:25:38 | 0 |
| 2015-01-01_01:25:39 | 0 |
| 2015-01-01_01:25:40 | 0 |
| 2015-01-01_01:25:41 | 0 |
| 2015-01-01_01:25:42 | 0 |
| 2015-01-01_01:25:43 | 0 |
| 2015-01-01_01:25:44 | 0 |
| 2015-01-01_01:25:45 | 0 |
| 2015-01-01_01:25:46 | 0 |
| 2015-01-01_01:25:47 | 0 |
| 2015-01-01_01:25:48 | 0 |
| 2015-01-01_01:25:49 | 0 |
| 2015-01-01_01:25:50 | 0 |
| 2015-01-01_01:25:51 | 0 |
| 2015-01-01_01:25:52 | 0 |
| 2015-01-01_01:25:53 | 0 |
| 2015-01-01_01:25:54 | 0 |
| 2015-01-01_01:25:55 | 0 |
| 2015-01-01_01:25:56 | 0 |
| 2015-01-01_01:25:57 | 0 |
| 2015-01-01_01:25:58 | 0 |
| 2015-01-01_01:25:59 | 0 |
| 2015-01-01_01:26:00 | 0 |
| 2015-01-01_01:26:01 | 0 |
| 2015-01-01_01:26:02 | 0 |
| 2015-01-01_01:26:03 | 0 |
| 2015-01-01_01:26:04 | 2 |
| 2015-01-01_01:26:05 | 10 |
| 2015-01-01_01:26:06 | 17 |
| 2015-01-01_01:26:07 | 20 |
| 2015-01-01_01:26:08 | 27 |
| 2015-01-01_01:26:09 | 36 |
| 2015-01-01_01:26:10 | 38 |
| 2015-01-01_01:26:11 | 41 |
| 2015-01-01_01:26:12 | 46 |
| 2015-01-01_01:26:13 | 49 |
| 2015-01-01_01:26:14 | 51 |
| 2015-01-01_01:26:15 | 52 |
| 2015-01-01_01:26:16 | 52 |
| 2015-01-01_01:26:17 | 54 |
| 2015-01-01_01:26:18 | 59 |
| 2015-01-01_01:26:19 | 63 |
| 2015-01-01_01:26:20 | 65 |
| 2015-01-01_01:26:21 | 65 |
| 2015-01-01_01:26:22 | 64 |
| 2015-01-01_01:26:23 | 63 |
| 2015-01-01_01:26:24 | 64 |
| 2015-01-01_01:26:25 | 64 |
| 2015-01-01_01:26:26 | 66 |
| 2015-01-01_01:26:27 | 67 |
| 2015-01-01_01:26:28 | 67 |
| 2015-01-01_01:26:29 | 68 |
| 2015-01-01_01:26:30 | 67 |
| 2015-01-01_01:26:31 | 65 |
| 2015-01-01_01:26:32 | 65 |
| 2015-01-01_01:26:33 | 64 |
| 2015-01-01_01:26:34 | 62 |
| 2015-01-01_01:26:35 | 61 |
| 2015-01-01_01:26:36 | 60 |
| 2015-01-01_01:26:37 | 59 |
| 2015-01-01_01:26:38 | 57 |
| 2015-01-01_01:26:39 | 57 |
| 2015-01-01_01:26:40 | 58 |
| 2015-01-01_01:26:41 | 59 |
| 2015-01-01_01:26:42 | 62 |
| 2015-01-01_01:26:43 | 63 |
| 2015-01-01_01:26:44 | 63 |
| 2015-01-01_01:26:45 | 63 |
| 2015-01-01_01:26:46 | 64 |
| 2015-01-01_01:26:47 | 64 |
| 2015-01-01_01:26:48 | 65 |
| 2015-01-01_01:26:49 | 65 |
| 2015-01-01_01:26:50 | 63 |
| 2015-01-01_01:26:51 | 63 |
| 2015-01-01_01:26:52 | 62 |
| 2015-01-01_01:26:53 | 61 |
| 2015-01-01_01:26:54 | 59 |
| 2015-01-01_01:26:55 | 57 |
| 2015-01-01_01:26:56 | 56 |
| 2015-01-01_01:26:57 | 55 |
| 2015-01-01_01:26:58 | 57 |
| 2015-01-01_01:26:59 | 59 |
| 2015-01-01_01:27:00 | 61 |
| 2015-01-01_01:27:01 | 63 |
| 2015-01-01_01:27:02 | 63 |
| 2015-01-01_01:27:03 | 64 |
| 2015-01-01_01:27:04 | 63 |
| 2015-01-01_01:27:05 | 63 |
| 2015-01-01_01:27:06 | 61 |
| 2015-01-01_01:27:07 | 59 |
| 2015-01-01_01:27:08 | 61 |
| 2015-01-01_01:27:09 | 62 |
| 2015-01-01_01:27:10 | 64 |
| 2015-01-01_01:27:11 | 64 |
| 2015-01-01_01:27:12 | 63 |
| 2015-01-01_01:27:13 | 62 |
| 2015-01-01_01:27:14 | 59 |
| 2015-01-01_01:27:15 | 57 |
| 2015-01-01_01:27:16 | 56 |
| 2015-01-01_01:27:17 | 54 |
| 2015-01-01_01:27:18 | 52 |
| 2015-01-01_01:27:19 | 51 |
| 2015-01-01_01:27:20 | 49 |
| 2015-01-01_01:27:21 | 47 |
| 2015-01-01_01:27:22 | 46 |
| 2015-01-01_01:27:23 | 45 |
| 2015-01-01_01:27:24 | 44 |
| 2015-01-01_01:27:25 | 43 |
| 2015-01-01_01:27:26 | 41 |
| 2015-01-01_01:27:27 | 35 |
| 2015-01-01_01:27:28 | 28 |
| 2015-01-01_01:27:29 | 22 |
| 2015-01-01_01:27:30 | 18 |
| 2015-01-01_01:27:31 | 12 |
| 2015-01-01_01:27:32 | 7 |
| 2015-01-01_01:27:33 | 4 |
| 2015-01-01_01:27:34 | 1 |
| 2015-01-01_01:27:35 | 0 |
| 2015-01-01_01:27:36 | 0 |
| 2015-01-01_01:27:37 | 0 |
| 2015-01-01_01:27:38 | 0 |
| 2015-01-01_01:27:39 | 0 |
| 2015-01-01_01:27:40 | 0 |
| 2015-01-01_01:27:41 | 0 |
| 2015-01-01_01:27:42 | 0 |
| 2015-01-01_01:27:43 | 0 |
| 2015-01-01_01:27:44 | 0 |
| 2015-01-01_01:27:45 | 0 |
| 2015-01-01_01:27:46 | 0 |
| 2015-01-01_01:27:47 | 0 |
| 2015-01-01_01:27:48 | 0 |
| 2015-01-01_01:27:49 | 2 |
| 2015-01-01_01:27:50 | 11 |
| 2015-01-01_01:27:51 | 19 |
| 2015-01-01_01:27:52 | 23 |
| 2015-01-01_01:27:53 | 27 |
| 2015-01-01_01:27:54 | 34 |
| 2015-01-01_01:27:55 | 38 |
| 2015-01-01_01:27:56 | 40 |
| 2015-01-01_01:27:57 | 44 |
| 2015-01-01_01:27:58 | 47 |
| 2015-01-01_01:27:59 | 47 |
| 2015-01-01_01:28:00 | 45 |
| 2015-01-01_01:28:01 | 44 |
| 2015-01-01_01:28:02 | 44 |
| 2015-01-01_01:28:03 | 43 |
| 2015-01-01_01:28:04 | 45 |
| 2015-01-01_01:28:05 | 47 |
| 2015-01-01_01:28:06 | 51 |
| 2015-01-01_01:28:07 | 56 |
| 2015-01-01_01:28:08 | 57 |
| 2015-01-01_01:28:09 | 59 |
| 2015-01-01_01:28:10 | 63 |
| 2015-01-01_01:28:11 | 65 |
| 2015-01-01_01:28:12 | 65 |
| 2015-01-01_01:28:13 | 62 |
| 2015-01-01_01:28:14 | 62 |
| 2015-01-01_01:28:15 | 62 |
| 2015-01-01_01:28:16 | 65 |
| 2015-01-01_01:28:17 | 68 |
| 2015-01-01_01:28:18 | 68 |
| 2015-01-01_01:28:19 | 67 |
| 2015-01-01_01:28:20 | 65 |
| 2015-01-01_01:28:21 | 65 |
| 2015-01-01_01:28:22 | 65 |
| 2015-01-01_01:28:23 | 65 |
| 2015-01-01_01:28:24 | 65 |
| 2015-01-01_01:28:25 | 66 |
| 2015-01-01_01:28:26 | 66 |
| 2015-01-01_01:28:27 | 66 |
| 2015-01-01_01:28:28 | 65 |
| 2015-01-01_01:28:29 | 63 |
| 2015-01-01_01:28:30 | 62 |
| 2015-01-01_01:28:31 | 60 |
| 2015-01-01_01:28:32 | 59 |
| 2015-01-01_01:28:33 | 58 |
| 2015-01-01_01:28:34 | 59 |
| 2015-01-01_01:28:35 | 60 |
| 2015-01-01_01:28:36 | 62 |
| 2015-01-01_01:28:37 | 62 |
| 2015-01-01_01:28:38 | 62 |
| 2015-01-01_01:28:39 | 62 |
| 2015-01-01_01:28:40 | 62 |
| 2015-01-01_01:28:41 | 62 |
| 2015-01-01_01:28:42 | 61 |
| 2015-01-01_01:28:43 | 60 |
| 2015-01-01_01:28:44 | 59 |
| 2015-01-01_01:28:45 | 58 |
| 2015-01-01_01:28:46 | 57 |
| 2015-01-01_01:28:47 | 56 |
| 2015-01-01_01:28:48 | 51 |
| 2015-01-01_01:28:49 | 48 |
| 2015-01-01_01:28:50 | 46 |
| 2015-01-01_01:28:51 | 45 |
| 2015-01-01_01:28:52 | 45 |
| 2015-01-01_01:28:53 | 46 |
| 2015-01-01_01:28:54 | 46 |
| 2015-01-01_01:28:55 | 47 |
| 2015-01-01_01:28:56 | 48 |
| 2015-01-01_01:28:57 | 50 |
| 2015-01-01_01:28:58 | 52 |
| 2015-01-01_01:28:59 | 55 |
| 2015-01-01_01:29:00 | 60 |
| 2015-01-01_01:29:01 | 64 |
| 2015-01-01_01:29:02 | 68 |
| 2015-01-01_01:29:03 | 70 |
| 2015-01-01_01:29:04 | 70 |
| 2015-01-01_01:29:05 | 70 |
| 2015-01-01_01:29:06 | 71 |
| 2015-01-01_01:29:07 | 72 |
| 2015-01-01_01:29:08 | 72 |
| 2015-01-01_01:29:09 | 73 |
| 2015-01-01_01:29:10 | 75 |
| 2015-01-01_01:29:11 | 73 |
| 2015-01-01_01:29:12 | 72 |
| 2015-01-01_01:29:13 | 72 |
| 2015-01-01_01:29:14 | 73 |
| 2015-01-01_01:29:15 | 74 |
| 2015-01-01_01:29:16 | 74 |
| 2015-01-01_01:29:17 | 75 |
| 2015-01-01_01:29:18 | 77 |
| 2015-01-01_01:29:19 | 78 |
| 2015-01-01_01:29:20 | 78 |
| 2015-01-01_01:29:21 | 77 |
| 2015-01-01_01:29:22 | 77 |
| 2015-01-01_01:29:23 | 78 |
| 2015-01-01_01:29:24 | 79 |
| 2015-01-01_01:29:25 | 80 |
| 2015-01-01_01:29:26 | 80 |
| 2015-01-01_01:29:27 | 79 |
| 2015-01-01_01:29:28 | 78 |
| 2015-01-01_01:29:29 | 77 |
| 2015-01-01_01:29:30 | 78 |
| 2015-01-01_01:29:31 | 78 |
| 2015-01-01_01:29:32 | 80 |
| 2015-01-01_01:29:33 | 80 |
| 2015-01-01_01:29:34 | 82 |
| 2015-01-01_01:29:35 | 80 |
| 2015-01-01_01:29:36 | 81 |
| 2015-01-01_01:29:37 | 81 |
| 2015-01-01_01:29:38 | 84 |
| 2015-01-01_01:29:39 | 85 |
| 2015-01-01_01:29:40 | 85 |
| 2015-01-01_01:29:41 | 87 |
| 2015-01-01_01:29:42 | 86 |
| 2015-01-01_01:29:43 | 87 |
| 2015-01-01_01:29:44 | 86 |
| 2015-01-01_01:29:45 | 85 |
| 2015-01-01_01:29:46 | 83 |
| 2015-01-01_01:29:47 | 81 |
| 2015-01-01_01:29:48 | 82 |
| 2015-01-01_01:29:49 | 84 |
| 2015-01-01_01:29:50 | 83 |
| 2015-01-01_01:29:51 | 83 |
| 2015-01-01_01:29:52 | 82 |
| 2015-01-01_01:29:53 | 82 |
| 2015-01-01_01:29:54 | 81 |
| 2015-01-01_01:29:55 | 80 |
| 2015-01-01_01:29:56 | 79 |
| 2015-01-01_01:29:57 | 81 |
| 2015-01-01_01:29:58 | 80 |
| 2015-01-01_01:29:59 | 81 |
| 2015-01-01_01:30:00 | 80 |
| 2015-01-01_01:30:01 | 81 |
| 2015-01-01_01:30:02 | 80 |
| 2015-01-01_01:30:03 | 79 |
| 2015-01-01_01:30:04 | 79 |
| 2015-01-01_01:30:05 | 78 |
| 2015-01-01_01:30:06 | 80 |
| 2015-01-01_01:30:07 | 81 |
| 2015-01-01_01:30:08 | 82 |
| 2015-01-01_01:30:09 | 84 |
| 2015-01-01_01:30:10 | 82 |
| 2015-01-01_01:30:11 | 82 |
| 2015-01-01_01:30:12 | 80 |
| 2015-01-01_01:30:13 | 81 |
| 2015-01-01_01:30:14 | 79 |
| 2015-01-01_01:30:15 | 77 |
| 2015-01-01_01:30:16 | 76 |
| 2015-01-01_01:30:17 | 77 |
| 2015-01-01_01:30:18 | 78 |
| 2015-01-01_01:30:19 | 80 |
| 2015-01-01_01:30:20 | 80 |
| 2015-01-01_01:30:21 | 80 |
| 2015-01-01_01:30:22 | 80 |
| 2015-01-01_01:30:23 | 79 |
| 2015-01-01_01:30:24 | 81 |
| 2015-01-01_01:30:25 | 81 |
| 2015-01-01_01:30:26 | 81 |
| 2015-01-01_01:30:27 | 83 |
| 2015-01-01_01:30:28 | 83 |
| 2015-01-01_01:30:29 | 85 |
| 2015-01-01_01:30:30 | 84 |
| 2015-01-01_01:30:31 | 84 |
| 2015-01-01_01:30:32 | 84 |
| 2015-01-01_01:30:33 | 83 |
| 2015-01-01_01:30:34 | 83 |
| 2015-01-01_01:30:35 | 84 |
| 2015-01-01_01:30:36 | 84 |
| 2015-01-01_01:30:37 | 84 |
| 2015-01-01_01:30:38 | 84 |
| 2015-01-01_01:30:39 | 83 |
| 2015-01-01_01:30:40 | 81 |
| 2015-01-01_01:30:41 | 81 |
| 2015-01-01_01:30:42 | 79 |
| 2015-01-01_01:30:43 | 77 |
| 2015-01-01_01:30:44 | 76 |
| 2015-01-01_01:30:45 | 76 |
| 2015-01-01_01:30:46 | 73 |
| 2015-01-01_01:30:47 | 75 |
| 2015-01-01_01:30:48 | 77 |
| 2015-01-01_01:30:49 | 80 |
| 2015-01-01_01:30:50 | 80 |
| 2015-01-01_01:30:51 | 81 |
| 2015-01-01_01:30:52 | 82 |
| 2015-01-01_01:30:53 | 83 |
| 2015-01-01_01:30:54 | 84 |
| 2015-01-01_01:30:55 | 83 |
| 2015-01-01_01:30:56 | 81 |
| 2015-01-01_01:30:57 | 80 |
| 2015-01-01_01:30:58 | 78 |
| 2015-01-01_01:30:59 | 76 |
| 2015-01-01_01:31:00 | 75 |
| 2015-01-01_01:31:01 | 72 |
| 2015-01-01_01:31:02 | 70 |
| 2015-01-01_01:31:03 | 69 |
| 2015-01-01_01:31:04 | 71 |
| 2015-01-01_01:31:05 | 70 |
| 2015-01-01_01:31:06 | 68 |
| 2015-01-01_01:31:07 | 67 |
| 2015-01-01_01:31:08 | 65 |
| 2015-01-01_01:31:09 | 63 |
| 2015-01-01_01:31:10 | 62 |
| 2015-01-01_01:31:11 | 61 |
| 2015-01-01_01:31:12 | 59 |
| 2015-01-01_01:31:13 | 55 |
| 2015-01-01_01:31:14 | 52 |
| 2015-01-01_01:31:15 | 52 |
| 2015-01-01_01:31:16 | 51 |
| 2015-01-01_01:31:17 | 51 |
| 2015-01-01_01:31:18 | 50 |
| 2015-01-01_01:31:19 | 50 |
| 2015-01-01_01:31:20 | 48 |
| 2015-01-01_01:31:21 | 46 |
| 2015-01-01_01:31:22 | 43 |
| 2015-01-01_01:31:23 | 39 |
| 2015-01-01_01:31:24 | 36 |
| 2015-01-01_01:31:25 | 35 |
| 2015-01-01_01:31:26 | 33 |
| 2015-01-01_01:31:27 | 30 |
| 2015-01-01_01:31:28 | 26 |
| 2015-01-01_01:31:29 | 23 |
| 2015-01-01_01:31:30 | 21 |
| 2015-01-01_01:31:31 | 18 |
| 2015-01-01_01:31:32 | 16 |
| 2015-01-01_01:31:33 | 13 |
| 2015-01-01_01:31:34 | 8 |
| 2015-01-01_01:31:35 | 6 |
| 2015-01-01_01:31:36 | 3 |
| 2015-01-01_01:31:37 | 1 |
| 2015-01-01_01:31:38 | 0 |
| 2015-01-01_01:31:39 | 0 |
| 2015-01-01_01:31:40 | 0 |
| 2015-01-01_01:31:41 | 0 |
| 2015-01-01_01:31:42 | 0 |
| 2015-01-01_01:31:43 | 0 |
| 2015-01-01_01:31:44 | 0 |
| 2015-01-01_01:31:45 | 0 |
| 2015-01-01_01:31:46 | 0 |
| 2015-01-01_01:31:47 | 0 |
| 2015-01-01_01:31:48 | 0 |
| 2015-01-01_01:31:49 | 0 |
| 2015-01-01_01:31:50 | 0 |
| 2015-01-01_01:31:51 | 0 |
| 2015-01-01_01:31:52 | 0 |
| 2015-01-01_01:31:53 | 0 |
| 2015-01-01_01:31:54 | 0 |
| 2015-01-01_01:31:55 | 0 |
| 2015-01-01_01:31:56 | 0 |
| 2015-01-01_01:31:57 | 0 |
| 2015-01-01_01:31:58 | 0 |
| 2015-01-01_01:31:59 | 0 |
| 2015-01-01_01:32:00 | 0 |
| 2015-01-01_01:32:01 | 0 |
| 2015-01-01_01:32:02 | 0 |
| 2015-01-01_01:32:03 | 0 |
| 2015-01-01_01:32:04 | 0 |
| 2015-01-01_01:32:05 | 0 |
| 2015-01-01_01:32:06 | 0 |
| 2015-01-01_01:32:07 | 0 |
| 2015-01-01_01:32:08 | 0 |
| 2015-01-01_01:32:09 | 0 |
| 2015-01-01_01:32:10 | 0 |
| 2015-01-01_01:32:11 | 0 |
| 2015-01-01_01:32:12 | 3 |
| 2015-01-01_01:32:13 | 11 |
| 2015-01-01_01:32:14 | 19 |
| 2015-01-01_01:32:15 | 22 |
| 2015-01-01_01:32:16 | 27 |
| 2015-01-01_01:32:17 | 35 |
| 2015-01-01_01:32:18 | 36 |
| 2015-01-01_01:32:19 | 37 |
| 2015-01-01_01:32:20 | 41 |
| 2015-01-01_01:32:21 | 44 |
| 2015-01-01_01:32:22 | 47 |
| 2015-01-01_01:32:23 | 50 |
| 2015-01-01_01:32:24 | 51 |
| 2015-01-01_01:32:25 | 53 |
| 2015-01-01_01:32:26 | 57 |
| 2015-01-01_01:32:27 | 58 |
| 2015-01-01_01:32:28 | 59 |
| 2015-01-01_01:32:29 | 58 |
| 2015-01-01_01:32:30 | 58 |
| 2015-01-01_01:32:31 | 59 |
| 2015-01-01_01:32:32 | 60 |
| 2015-01-01_01:32:33 | 63 |
| 2015-01-01_01:32:34 | 63 |
| 2015-01-01_01:32:35 | 63 |
| 2015-01-01_01:32:36 | 64 |
| 2015-01-01_01:32:37 | 68 |
| 2015-01-01_01:32:38 | 69 |
| 2015-01-01_01:32:39 | 67 |
| 2015-01-01_01:32:40 | 69 |
| 2015-01-01_01:32:41 | 71 |
| 2015-01-01_01:32:42 | 72 |
| 2015-01-01_01:32:43 | 70 |
| 2015-01-01_01:32:44 | 69 |
| 2015-01-01_01:32:45 | 68 |
| 2015-01-01_01:32:46 | 66 |
| 2015-01-01_01:32:47 | 64 |
| 2015-01-01_01:32:48 | 63 |
| 2015-01-01_01:32:49 | 63 |
| 2015-01-01_01:32:50 | 64 |
| 2015-01-01_01:32:51 | 65 |
| 2015-01-01_01:32:52 | 68 |
| 2015-01-01_01:32:53 | 67 |
| 2015-01-01_01:32:54 | 68 |
| 2015-01-01_01:32:55 | 68 |
| 2015-01-01_01:32:56 | 68 |
| 2015-01-01_01:32:57 | 67 |
| 2015-01-01_01:32:58 | 68 |
| 2015-01-01_01:32:59 | 70 |
| 2015-01-01_01:33:00 | 72 |
| 2015-01-01_01:33:01 | 70 |
| 2015-01-01_01:33:02 | 69 |
| 2015-01-01_01:33:03 | 68 |
| 2015-01-01_01:33:04 | 66 |
| 2015-01-01_01:33:05 | 65 |
| 2015-01-01_01:33:06 | 63 |
| 2015-01-01_01:33:07 | 62 |
| 2015-01-01_01:33:08 | 62 |
| 2015-01-01_01:33:09 | 62 |
| 2015-01-01_01:33:10 | 61 |
| 2015-01-01_01:33:11 | 63 |
| 2015-01-01_01:33:12 | 66 |
| 2015-01-01_01:33:13 | 69 |
| 2015-01-01_01:33:14 | 70 |
| 2015-01-01_01:33:15 | 68 |
| 2015-01-01_01:33:16 | 69 |
| 2015-01-01_01:33:17 | 69 |
| 2015-01-01_01:33:18 | 71 |
| 2015-01-01_01:33:19 | 71 |
| 2015-01-01_01:33:20 | 70 |
| 2015-01-01_01:33:21 | 69 |
| 2015-01-01_01:33:22 | 67 |
| 2015-01-01_01:33:23 | 67 |
| 2015-01-01_01:33:24 | 68 |
| 2015-01-01_01:33:25 | 69 |
| 2015-01-01_01:33:26 | 71 |
| 2015-01-01_01:33:27 | 73 |
| 2015-01-01_01:33:28 | 76 |
| 2015-01-01_01:33:29 | 76 |
| 2015-01-01_01:33:30 | 76 |
| 2015-01-01_01:33:31 | 74 |
| 2015-01-01_01:33:32 | 74 |
| 2015-01-01_01:33:33 | 74 |
| 2015-01-01_01:33:34 | 73 |
| 2015-01-01_01:33:35 | 72 |
| 2015-01-01_01:33:36 | 71 |
| 2015-01-01_01:33:37 | 70 |
| 2015-01-01_01:33:38 | 61 |
| 2015-01-01_01:33:39 | 53 |
| 2015-01-01_01:33:40 | 47 |
| 2015-01-01_01:33:41 | 41 |
| 2015-01-01_01:33:42 | 35 |
| 2015-01-01_01:33:43 | 29 |
| 2015-01-01_01:33:44 | 23 |
| 2015-01-01_01:33:45 | 18 |
| 2015-01-01_01:33:46 | 13 |
| 2015-01-01_01:33:47 | 10 |
| 2015-01-01_01:33:48 | 10 |
| 2015-01-01_01:33:49 | 11 |
| 2015-01-01_01:33:50 | 10 |
| 2015-01-01_01:33:51 | 9 |
| 2015-01-01_01:33:52 | 10 |
| 2015-01-01_01:33:53 | 11 |
| 2015-01-01_01:33:54 | 10 |
| 2015-01-01_01:33:55 | 11 |
| 2015-01-01_01:33:56 | 9 |
| 2015-01-01_01:33:57 | 6 |
| 2015-01-01_01:33:58 | 3 |
| 2015-01-01_01:33:59 | 2 |
| 2015-01-01_01:34:00 | 2 |
| 2015-01-01_01:34:01 | 0 |
| 2015-01-01_01:34:02 | 3 |
| 2015-01-01_01:34:03 | 4 |
| 2015-01-01_01:34:04 | 5 |
| 2015-01-01_01:34:05 | 7 |
| 2015-01-01_01:34:06 | 10 |
| 2015-01-01_01:34:07 | 14 |
| 2015-01-01_01:34:08 | 16 |
| 2015-01-01_01:34:09 | 16 |
| 2015-01-01_01:34:10 | 16 |
| 2015-01-01_01:34:11 | 17 |
| 2015-01-01_01:34:12 | 16 |
| 2015-01-01_01:34:13 | 14 |
| 2015-01-01_01:34:14 | 14 |
| 2015-01-01_01:34:15 | 16 |
| 2015-01-01_01:34:16 | 23 |
| 2015-01-01_01:34:17 | 30 |
| 2015-01-01_01:34:18 | 32 |
| 2015-01-01_01:34:19 | 37 |
| 2015-01-01_01:34:20 | 42 |
| 2015-01-01_01:34:21 | 50 |
| 2015-01-01_01:34:22 | 54 |
| 2015-01-01_01:34:23 | 53 |
| 2015-01-01_01:34:24 | 56 |
| 2015-01-01_01:34:25 | 61 |
| 2015-01-01_01:34:26 | 64 |
| 2015-01-01_01:34:27 | 67 |
| 2015-01-01_01:34:28 | 66 |
| 2015-01-01_01:34:29 | 70 |
| 2015-01-01_01:34:30 | 73 |
| 2015-01-01_01:34:31 | 75 |
| 2015-01-01_01:34:32 | 79 |
| 2015-01-01_01:34:33 | 81 |
| 2015-01-01_01:34:34 | 82 |
| 2015-01-01_01:34:35 | 82 |
| 2015-01-01_01:34:36 | 82 |
| 2015-01-01_01:34:37 | 84 |
| 2015-01-01_01:34:38 | 85 |
| 2015-01-01_01:34:39 | 86 |
| 2015-01-01_01:34:40 | 87 |
| 2015-01-01_01:34:41 | 88 |
| 2015-01-01_01:34:42 | 88 |
| 2015-01-01_01:34:43 | 90 |
| 2015-01-01_01:34:44 | 89 |
| 2015-01-01_01:34:45 | 89 |
| 2015-01-01_01:34:46 | 89 |
| 2015-01-01_01:34:47 | 89 |
| 2015-01-01_01:34:48 | 89 |
| 2015-01-01_01:34:49 | 89 |
| 2015-01-01_01:34:50 | 88 |
| 2015-01-01_01:34:51 | 87 |
| 2015-01-01_01:34:52 | 84 |
| 2015-01-01_01:34:53 | 84 |
| 2015-01-01_01:34:54 | 82 |
| 2015-01-01_01:34:55 | 83 |
| 2015-01-01_01:34:56 | 82 |
| 2015-01-01_01:34:57 | 84 |
| 2015-01-01_01:34:58 | 83 |
| 2015-01-01_01:34:59 | 85 |
| 2015-01-01_01:35:00 | 85 |
| 2015-01-01_01:35:01 | 87 |
| 2015-01-01_01:35:02 | 88 |
| 2015-01-01_01:35:03 | 90 |
| 2015-01-01_01:35:04 | 91 |
| 2015-01-01_01:35:05 | 92 |
| 2015-01-01_01:35:06 | 93 |
| 2015-01-01_01:35:07 | 94 |
| 2015-01-01_01:35:08 | 95 |
| 2015-01-01_01:35:09 | 97 |
| 2015-01-01_01:35:10 | 96 |
| 2015-01-01_01:35:11 | 96 |
| 2015-01-01_01:35:12 | 96 |
| 2015-01-01_01:35:13 | 96 |
| 2015-01-01_01:35:14 | 95 |
| 2015-01-01_01:35:15 | 95 |
| 2015-01-01_01:35:16 | 93 |
| 2015-01-01_01:35:17 | 91 |
| 2015-01-01_01:35:18 | 88 |
| 2015-01-01_01:35:19 | 87 |
| 2015-01-01_01:35:20 | 85 |
| 2015-01-01_01:35:21 | 85 |
| 2015-01-01_01:35:22 | 83 |
| 2015-01-01_01:35:23 | 82 |
| 2015-01-01_01:35:24 | 82 |
| 2015-01-01_01:35:25 | 82 |
| 2015-01-01_01:35:26 | 82 |
| 2015-01-01_01:35:27 | 82 |
| 2015-01-01_01:35:28 | 83 |
| 2015-01-01_01:35:29 | 85 |
| 2015-01-01_01:35:30 | 87 |
| 2015-01-01_01:35:31 | 88 |
| 2015-01-01_01:35:32 | 88 |
| 2015-01-01_01:35:33 | 90 |
| 2015-01-01_01:35:34 | 90 |
| 2015-01-01_01:35:35 | 92 |
| 2015-01-01_01:35:36 | 92 |
| 2015-01-01_01:35:37 | 93 |
| 2015-01-01_01:35:38 | 92 |
| 2015-01-01_01:35:39 | 91 |
| 2015-01-01_01:35:40 | 90 |
| 2015-01-01_01:35:41 | 90 |
| 2015-01-01_01:35:42 | 89 |
| 2015-01-01_01:35:43 | 88 |
| 2015-01-01_01:35:44 | 86 |
| 2015-01-01_01:35:45 | 87 |
| 2015-01-01_01:35:46 | 86 |
| 2015-01-01_01:35:47 | 85 |
| 2015-01-01_01:35:48 | 83 |
| 2015-01-01_01:35:49 | 82 |
| 2015-01-01_01:35:50 | 80 |
| 2015-01-01_01:35:51 | 79 |
| 2015-01-01_01:35:52 | 77 |
| 2015-01-01_01:35:53 | 76 |
| 2015-01-01_01:35:54 | 74 |
| 2015-01-01_01:35:55 | 73 |
| 2015-01-01_01:35:56 | 70 |
| 2015-01-01_01:35:57 | 69 |
| 2015-01-01_01:35:58 | 68 |
| 2015-01-01_01:35:59 | 66 |
| 2015-01-01_01:36:00 | 66 |
| 2015-01-01_01:36:01 | 69 |
| 2015-01-01_01:36:02 | 70 |
| 2015-01-01_01:36:03 | 74 |
| 2015-01-01_01:36:04 | 77 |
| 2015-01-01_01:36:05 | 78 |
| 2015-01-01_01:36:06 | 77 |
| 2015-01-01_01:36:07 | 77 |
| 2015-01-01_01:36:08 | 77 |
| 2015-01-01_01:36:09 | 77 |
| 2015-01-01_01:36:10 | 75 |
| 2015-01-01_01:36:11 | 75 |
| 2015-01-01_01:36:12 | 75 |
| 2015-01-01_01:36:13 | 77 |
| 2015-01-01_01:36:14 | 76 |
| 2015-01-01_01:36:15 | 77 |
| 2015-01-01_01:36:16 | 75 |
| 2015-01-01_01:36:17 | 77 |
| 2015-01-01_01:36:18 | 76 |
| 2015-01-01_01:36:19 | 79 |
| 2015-01-01_01:36:20 | 79 |
| 2015-01-01_01:36:21 | 79 |
| 2015-01-01_01:36:22 | 79 |
| 2015-01-01_01:36:23 | 79 |
| 2015-01-01_01:36:24 | 79 |
| 2015-01-01_01:36:25 | 79 |
| 2015-01-01_01:36:26 | 80 |
| 2015-01-01_01:36:27 | 80 |
| 2015-01-01_01:36:28 | 80 |
| 2015-01-01_01:36:29 | 81 |
| 2015-01-01_01:36:30 | 79 |
| 2015-01-01_01:36:31 | 80 |
| 2015-01-01_01:36:32 | 80 |
| 2015-01-01_01:36:33 | 81 |
| 2015-01-01_01:36:34 | 80 |
| 2015-01-01_01:36:35 | 80 |
| 2015-01-01_01:36:36 | 80 |
| 2015-01-01_01:36:37 | 81 |
| 2015-01-01_01:36:38 | 79 |
| 2015-01-01_01:36:39 | 80 |
| 2015-01-01_01:36:40 | 80 |
| 2015-01-01_01:36:41 | 80 |
| 2015-01-01_01:36:42 | 80 |
| 2015-01-01_01:36:43 | 80 |
| 2015-01-01_01:36:44 | 80 |
| 2015-01-01_01:36:45 | 80 |
| 2015-01-01_01:36:46 | 80 |
| 2015-01-01_01:36:47 | 80 |
| 2015-01-01_01:36:48 | 80 |
| 2015-01-01_01:36:49 | 80 |
| 2015-01-01_01:36:50 | 80 |
| 2015-01-01_01:36:51 | 79 |
| 2015-01-01_01:36:52 | 76 |
| 2015-01-01_01:36:53 | 75 |
| 2015-01-01_01:36:54 | 73 |
| 2015-01-01_01:36:55 | 75 |
| 2015-01-01_01:36:56 | 80 |
| 2015-01-01_01:36:57 | 86 |
| 2015-01-01_01:36:58 | 90 |
| 2015-01-01_01:36:59 | 93 |
| 2015-01-01_01:37:00 | 94 |
| 2015-01-01_01:37:01 | 93 |
| 2015-01-01_01:37:02 | 91 |
| 2015-01-01_01:37:03 | 90 |
| 2015-01-01_01:37:04 | 91 |
| 2015-01-01_01:37:05 | 89 |
| 2015-01-01_01:37:06 | 85 |
| 2015-01-01_01:37:07 | 81 |
| 2015-01-01_01:37:08 | 75 |
| 2015-01-01_01:37:09 | 68 |
| 2015-01-01_01:37:10 | 60 |
| 2015-01-01_01:37:11 | 54 |
| 2015-01-01_01:37:12 | 47 |
| 2015-01-01_01:37:13 | 41 |
| 2015-01-01_01:37:14 | 37 |
| 2015-01-01_01:37:15 | 35 |
| 2015-01-01_01:37:16 | 35 |
| 2015-01-01_01:37:17 | 33 |
| 2015-01-01_01:37:18 | 30 |
| 2015-01-01_01:37:19 | 28 |
| 2015-01-01_01:37:20 | 27 |
| 2015-01-01_01:37:21 | 29 |
| 2015-01-01_01:37:22 | 29 |
| 2015-01-01_01:37:23 | 26 |
| 2015-01-01_01:37:24 | 29 |
| 2015-01-01_01:37:25 | 32 |
| 2015-01-01_01:37:26 | 34 |
| 2015-01-01_01:37:27 | 34 |
| 2015-01-01_01:37:28 | 36 |
| 2015-01-01_01:37:29 | 40 |
| 2015-01-01_01:37:30 | 43 |
| 2015-01-01_01:37:31 | 47 |
| 2015-01-01_01:37:32 | 52 |
| 2015-01-01_01:37:33 | 56 |
| 2015-01-01_01:37:34 | 57 |
| 2015-01-01_01:37:35 | 63 |
| 2015-01-01_01:37:36 | 65 |
| 2015-01-01_01:37:37 | 67 |
| 2015-01-01_01:37:38 | 66 |
| 2015-01-01_01:37:39 | 66 |
| 2015-01-01_01:37:40 | 65 |
| 2015-01-01_01:37:41 | 70 |
| 2015-01-01_01:37:42 | 75 |
| 2015-01-01_01:37:43 | 77 |
| 2015-01-01_01:37:44 | 79 |
| 2015-01-01_01:37:45 | 82 |
| 2015-01-01_01:37:46 | 84 |
| 2015-01-01_01:37:47 | 86 |
| 2015-01-01_01:37:48 | 87 |
| 2015-01-01_01:37:49 | 87 |
| 2015-01-01_01:37:50 | 86 |
| 2015-01-01_01:37:51 | 84 |
| 2015-01-01_01:37:52 | 84 |
| 2015-01-01_01:37:53 | 82 |
| 2015-01-01_01:37:54 | 80 |
| 2015-01-01_01:37:55 | 80 |
| 2015-01-01_01:37:56 | 81 |
| 2015-01-01_01:37:57 | 83 |
| 2015-01-01_01:37:58 | 83 |
| 2015-01-01_01:37:59 | 83 |
| 2015-01-01_01:38:00 | 81 |
| 2015-01-01_01:38:01 | 82 |
| 2015-01-01_01:38:02 | 83 |
| 2015-01-01_01:38:03 | 81 |
| 2015-01-01_01:38:04 | 79 |
| 2015-01-01_01:38:05 | 79 |
| 2015-01-01_01:38:06 | 76 |
| 2015-01-01_01:38:07 | 76 |
| 2015-01-01_01:38:08 | 75 |
| 2015-01-01_01:38:09 | 75 |
| 2015-01-01_01:38:10 | 74 |
| 2015-01-01_01:38:11 | 73 |
| 2015-01-01_01:38:12 | 73 |
| 2015-01-01_01:38:13 | 76 |
| 2015-01-01_01:38:14 | 76 |
| 2015-01-01_01:38:15 | 77 |
| 2015-01-01_01:38:16 | 81 |
| 2015-01-01_01:38:17 | 83 |
| 2015-01-01_01:38:18 | 83 |
| 2015-01-01_01:38:19 | 84 |
| 2015-01-01_01:38:20 | 84 |
| 2015-01-01_01:38:21 | 82 |
| 2015-01-01_01:38:22 | 82 |
| 2015-01-01_01:38:23 | 82 |
| 2015-01-01_01:38:24 | 79 |
| 2015-01-01_01:38:25 | 79 |
| 2015-01-01_01:38:26 | 77 |
| 2015-01-01_01:38:27 | 76 |
| 2015-01-01_01:38:28 | 75 |
| 2015-01-01_01:38:29 | 75 |
| 2015-01-01_01:38:30 | 74 |
| 2015-01-01_01:38:31 | 72 |
| 2015-01-01_01:38:32 | 72 |
| 2015-01-01_01:38:33 | 69 |
| 2015-01-01_01:38:34 | 69 |
| 2015-01-01_01:38:35 | 69 |
| 2015-01-01_01:38:36 | 67 |
| 2015-01-01_01:38:37 | 68 |
| 2015-01-01_01:38:38 | 67 |
| 2015-01-01_01:38:39 | 67 |
| 2015-01-01_01:38:40 | 67 |
| 2015-01-01_01:38:41 | 66 |
| 2015-01-01_01:38:42 | 66 |
| 2015-01-01_01:38:43 | 66 |
| 2015-01-01_01:38:44 | 68 |
| 2015-01-01_01:38:45 | 68 |
| 2015-01-01_01:38:46 | 68 |
| 2015-01-01_01:38:47 | 66 |
| 2015-01-01_01:38:48 | 65 |
| 2015-01-01_01:38:49 | 66 |
| 2015-01-01_01:38:50 | 65 |
| 2015-01-01_01:38:51 | 64 |
| 2015-01-01_01:38:52 | 62 |
| 2015-01-01_01:38:53 | 61 |
| 2015-01-01_01:38:54 | 58 |
| 2015-01-01_01:38:55 | 58 |
| 2015-01-01_01:38:56 | 56 |
| 2015-01-01_01:38:57 | 50 |
| 2015-01-01_01:38:58 | 48 |
| 2015-01-01_01:38:59 | 50 |
| 2015-01-01_01:39:00 | 51 |
| 2015-01-01_01:39:01 | 50 |
| 2015-01-01_01:39:02 | 48 |
| 2015-01-01_01:39:03 | 46 |
| 2015-01-01_01:39:04 | 45 |
| 2015-01-01_01:39:05 | 43 |
| 2015-01-01_01:39:06 | 41 |
| 2015-01-01_01:39:07 | 40 |
| 2015-01-01_01:39:08 | 39 |
| 2015-01-01_01:39:09 | 42 |
| 2015-01-01_01:39:10 | 47 |
| 2015-01-01_01:39:11 | 50 |
| 2015-01-01_01:39:12 | 52 |
| 2015-01-01_01:39:13 | 54 |
| 2015-01-01_01:39:14 | 57 |
| 2015-01-01_01:39:15 | 62 |
| 2015-01-01_01:39:16 | 64 |
| 2015-01-01_01:39:17 | 62 |
| 2015-01-01_01:39:18 | 61 |
| 2015-01-01_01:39:19 | 58 |
| 2015-01-01_01:39:20 | 54 |
| 2015-01-01_01:39:21 | 49 |
| 2015-01-01_01:39:22 | 44 |
| 2015-01-01_01:39:23 | 41 |
| 2015-01-01_01:39:24 | 42 |
| 2015-01-01_01:39:25 | 41 |
| 2015-01-01_01:39:26 | 42 |
| 2015-01-01_01:39:27 | 44 |
| 2015-01-01_01:39:28 | 48 |
| 2015-01-01_01:39:29 | 50 |
| 2015-01-01_01:39:30 | 50 |
| 2015-01-01_01:39:31 | 54 |
| 2015-01-01_01:39:32 | 56 |
| 2015-01-01_01:39:33 | 56 |
| 2015-01-01_01:39:34 | 56 |
| 2015-01-01_01:39:35 | 57 |
| 2015-01-01_01:39:36 | 57 |
| 2015-01-01_01:39:37 | 57 |
| 2015-01-01_01:39:38 | 58 |
| 2015-01-01_01:39:39 | 59 |
| 2015-01-01_01:39:40 | 60 |
| 2015-01-01_01:39:41 | 60 |
| 2015-01-01_01:39:42 | 63 |
| 2015-01-01_01:39:43 | 65 |
| 2015-01-01_01:39:44 | 67 |
| 2015-01-01_01:39:45 | 67 |
| 2015-01-01_01:39:46 | 66 |
| 2015-01-01_01:39:47 | 68 |
| 2015-01-01_01:39:48 | 67 |
| 2015-01-01_01:39:49 | 69 |
| 2015-01-01_01:39:50 | 70 |
| 2015-01-01_01:39:51 | 70 |
| 2015-01-01_01:39:52 | 73 |
| 2015-01-01_01:39:53 | 75 |
| 2015-01-01_01:39:54 | 78 |
| 2015-01-01_01:39:55 | 81 |
| 2015-01-01_01:39:56 | 80 |
| 2015-01-01_01:39:57 | 82 |
| 2015-01-01_01:39:58 | 81 |
| 2015-01-01_01:39:59 | 79 |
| 2015-01-01_01:40:00 | 78 |
| 2015-01-01_01:40:01 | 77 |
| 2015-01-01_01:40:02 | 75 |
| 2015-01-01_01:40:03 | 73 |
| 2015-01-01_01:40:04 | 73 |
| 2015-01-01_01:40:05 | 72 |
| 2015-01-01_01:40:06 | 71 |
| 2015-01-01_01:40:07 | 70 |
| 2015-01-01_01:40:08 | 71 |
| 2015-01-01_01:40:09 | 73 |
| 2015-01-01_01:40:10 | 72 |
| 2015-01-01_01:40:11 | 73 |
| 2015-01-01_01:40:12 | 70 |
| 2015-01-01_01:40:13 | 66 |
| 2015-01-01_01:40:14 | 61 |
| 2015-01-01_01:40:15 | 57 |
| 2015-01-01_01:40:16 | 56 |
| 2015-01-01_01:40:17 | 57 |
| 2015-01-01_01:40:18 | 57 |
| 2015-01-01_01:40:19 | 56 |
| 2015-01-01_01:40:20 | 58 |
| 2015-01-01_01:40:21 | 63 |
| 2015-01-01_01:40:22 | 68 |
| 2015-01-01_01:40:23 | 71 |
| 2015-01-01_01:40:24 | 73 |
| 2015-01-01_01:40:25 | 74 |
| 2015-01-01_01:40:26 | 72 |
| 2015-01-01_01:40:27 | 71 |
| 2015-01-01_01:40:28 | 69 |
| 2015-01-01_01:40:29 | 69 |
| 2015-01-01_01:40:30 | 66 |
| 2015-01-01_01:40:31 | 65 |
| 2015-01-01_01:40:32 | 63 |
| 2015-01-01_01:40:33 | 62 |
| 2015-01-01_01:40:34 | 60 |
| 2015-01-01_01:40:35 | 58 |
| 2015-01-01_01:40:36 | 57 |
| 2015-01-01_01:40:37 | 56 |
| 2015-01-01_01:40:38 | 53 |
| 2015-01-01_01:40:39 | 51 |
| 2015-01-01_01:40:40 | 46 |
| 2015-01-01_01:40:41 | 40 |
| 2015-01-01_01:40:42 | 33 |
| 2015-01-01_01:40:43 | 27 |
| 2015-01-01_01:40:44 | 19 |
| 2015-01-01_01:40:45 | 11 |
| 2015-01-01_01:40:46 | 6 |
| 2015-01-01_01:40:47 | 3 |
| 2015-01-01_01:40:48 | 2 |
| 2015-01-01_01:40:49 | 2 |
| 2015-01-01_01:40:50 | 0 |
| 2015-01-01_01:40:51 | 0 |
| 2015-01-01_01:40:52 | 0 |
| 2015-01-01_01:40:53 | 0 |
| 2015-01-01_01:40:54 | 0 |
| 2015-01-01_01:40:55 | 0 |
| 2015-01-01_01:40:56 | 0 |
| 2015-01-01_01:40:57 | 0 |
| 2015-01-01_01:40:58 | 0 |
| 2015-01-01_01:40:59 | 0 |
| 2015-01-01_01:41:00 | 0 |
| 2015-01-01_01:41:01 | 0 |
| 2015-01-01_01:41:02 | 0 |
| 2015-01-01_01:41:03 | 0 |
| 2015-01-01_01:41:04 | 0 |
| 2015-01-01_01:41:05 | 0 |
| 2015-01-01_01:41:06 | 0 |
| 2015-01-01_01:41:07 | 0 |
| 2015-01-01_01:41:08 | 0 |
| 2015-01-01_01:41:09 | 0 |
| 2015-01-01_01:41:10 | 0 |
| 2015-01-01_01:41:11 | 0 |
| 2015-01-01_01:41:12 | 0 |
| 2015-01-01_01:41:13 | 0 |
| 2015-01-01_01:41:14 | 0 |
| 2015-01-01_01:41:15 | 0 |
| 2015-01-01_01:41:16 | 0 |
| 2015-01-01_01:41:17 | 0 |
| 2015-01-01_01:41:18 | 0 |
| 2015-01-01_01:41:19 | 0 |
| 2015-01-01_01:41:20 | 0 |
| 2015-01-01_01:41:21 | 0 |
| 2015-01-01_01:41:22 | 0 |
| 2015-01-01_01:41:23 | 0 |
| 2015-01-01_01:41:24 | 0 |
| 2015-01-01_01:41:25 | 0 |
| 2015-01-01_01:41:26 | 0 |
| 2015-01-01_01:41:27 | 0 |
| 2015-01-01_01:41:28 | 0 |
| 2015-01-01_01:41:29 | 0 |
| 2015-01-01_01:41:30 | 0 |
| 2015-01-01_01:41:31 | 0 |
| 2015-01-01_01:41:32 | 0 |
| 2015-01-01_01:41:33 | 0 |
| 2015-01-01_01:41:34 | 0 |
| 2015-01-01_01:41:35 | 0 |
| 2015-01-01_01:41:36 | 0 |
| 2015-01-01_01:41:37 | 0 |
| 2015-01-01_01:41:38 | 0 |
| 2015-01-01_01:41:39 | 0 |
| 2015-01-01_01:41:40 | 0 |
| 2015-01-01_01:41:41 | 0 |
| 2015-01-01_01:41:42 | 0 |
| 2015-01-01_01:41:43 | 0 |
| 2015-01-01_01:41:44 | 0 |
| 2015-01-01_01:41:45 | 0 |
| 2015-01-01_01:41:46 | 0 |
| 2015-01-01_01:41:47 | 0 |
| 2015-01-01_01:41:48 | 0 |
| 2015-01-01_01:41:49 | 0 |
| 2015-01-01_01:41:50 | 0 |
| 2015-01-01_01:41:51 | 0 |
| 2015-01-01_01:41:52 | 0 |
| 2015-01-01_01:41:53 | 0 |
| 2015-01-01_01:41:54 | 0 |
| 2015-01-01_01:41:55 | 0 |
| 2015-01-01_01:41:56 | 0 |
| 2015-01-01_01:41:57 | 0 |
| 2015-01-01_01:41:58 | 0 |
| 2015-01-01_01:41:59 | 0 |
| 2015-01-01_01:42:00 | 0 |
| 2015-01-01_01:42:01 | 0 |
| 2015-01-01_01:42:02 | 0 |
| 2015-01-01_01:42:03 | 0 |
| 2015-01-01_01:42:04 | 0 |
| 2015-01-01_01:42:05 | 0 |
| 2015-01-01_01:42:06 | 2 |
| 2015-01-01_01:42:07 | 11 |
| 2015-01-01_01:42:08 | 21 |
| 2015-01-01_01:42:09 | 24 |
| 2015-01-01_01:42:10 | 31 |
| 2015-01-01_01:42:11 | 41 |
| 2015-01-01_01:42:12 | 45 |
| 2015-01-01_01:42:13 | 50 |
| 2015-01-01_01:42:14 | 60 |
| 2015-01-01_01:42:15 | 65 |
| 2015-01-01_01:42:16 | 67 |
| 2015-01-01_01:42:17 | 71 |
| 2015-01-01_01:42:18 | 78 |
| 2015-01-01_01:42:19 | 79 |
| 2015-01-01_01:42:20 | 80 |
| 2015-01-01_01:42:21 | 81 |
| 2015-01-01_01:42:22 | 82 |
| 2015-01-01_01:42:23 | 83 |
| 2015-01-01_01:42:24 | 82 |
| 2015-01-01_01:42:25 | 80 |
| 2015-01-01_01:42:26 | 79 |
| 2015-01-01_01:42:27 | 77 |
| 2015-01-01_01:42:28 | 75 |
| 2015-01-01_01:42:29 | 74 |
| 2015-01-01_01:42:30 | 72 |
| 2015-01-01_01:42:31 | 70 |
| 2015-01-01_01:42:32 | 68 |
| 2015-01-01_01:42:33 | 65 |
| 2015-01-01_01:42:34 | 61 |
| 2015-01-01_01:42:35 | 57 |
| 2015-01-01_01:42:36 | 53 |
| 2015-01-01_01:42:37 | 48 |
| 2015-01-01_01:42:38 | 43 |
| 2015-01-01_01:42:39 | 36 |
| 2015-01-01_01:42:40 | 30 |
| 2015-01-01_01:42:41 | 26 |
| 2015-01-01_01:42:42 | 21 |
| 2015-01-01_01:42:43 | 16 |
| 2015-01-01_01:42:44 | 9 |
| 2015-01-01_01:42:45 | 7 |
| 2015-01-01_01:42:46 | 6 |
| 2015-01-01_01:42:47 | 7 |
| 2015-01-01_01:42:48 | 9 |
| 2015-01-01_01:42:49 | 11 |
| 2015-01-01_01:42:50 | 16 |
| 2015-01-01_01:42:51 | 17 |
| 2015-01-01_01:42:52 | 21 |
| 2015-01-01_01:42:53 | 26 |
| 2015-01-01_01:42:54 | 27 |
| 2015-01-01_01:42:55 | 26 |
| 2015-01-01_01:42:56 | 26 |
| 2015-01-01_01:42:57 | 27 |
| 2015-01-01_01:42:58 | 26 |
| 2015-01-01_01:42:59 | 27 |
| 2015-01-01_01:43:00 | 27 |
| 2015-01-01_01:43:01 | 32 |
| 2015-01-01_01:43:02 | 33 |
| 2015-01-01_01:43:03 | 34 |
| 2015-01-01_01:43:04 | 35 |
| 2015-01-01_01:43:05 | 35 |
| 2015-01-01_01:43:06 | 34 |
| 2015-01-01_01:43:07 | 33 |
| 2015-01-01_01:43:08 | 31 |
| 2015-01-01_01:43:09 | 30 |
| 2015-01-01_01:43:10 | 28 |
| 2015-01-01_01:43:11 | 29 |
| 2015-01-01_01:43:12 | 28 |
| 2015-01-01_01:43:13 | 28 |
| 2015-01-01_01:43:14 | 29 |
| 2015-01-01_01:43:15 | 34 |
| 2015-01-01_01:43:16 | 38 |
| 2015-01-01_01:43:17 | 38 |
| 2015-01-01_01:43:18 | 38 |
| 2015-01-01_01:43:19 | 35 |
| 2015-01-01_01:43:20 | 33 |
| 2015-01-01_01:43:21 | 29 |
| 2015-01-01_01:43:22 | 23 |
| 2015-01-01_01:43:23 | 20 |
| 2015-01-01_01:43:24 | 18 |
| 2015-01-01_01:43:25 | 16 |
| 2015-01-01_01:43:26 | 12 |
| 2015-01-01_01:43:27 | 8 |
| 2015-01-01_01:43:28 | 5 |
| 2015-01-01_01:43:29 | 4 |
| 2015-01-01_01:43:30 | 4 |
| 2015-01-01_01:43:31 | 3 |
| 2015-01-01_01:43:32 | 3 |
| 2015-01-01_01:43:33 | 2 |
| 2015-01-01_01:43:34 | 0 |
| 2015-01-01_01:43:35 | 0 |
| 2015-01-01_01:43:36 | 0 |
| 2015-01-01_01:43:37 | 0 |
| 2015-01-01_01:43:38 | 0 |
| 2015-01-01_01:43:39 | 0 |
| 2015-01-01_01:43:40 | 0 |
| 2015-01-01_01:43:41 | 0 |
| 2015-01-01_01:43:42 | 0 |
| 2015-01-01_01:43:43 | 0 |
| 2015-01-01_01:43:44 | 0 |
| 2015-01-01_01:43:45 | 0 |
| 2015-01-01_01:43:46 | 0 |
| 2015-01-01_01:43:47 | 0 |
| 2015-01-01_01:43:48 | 0 |
| 2015-01-01_01:43:49 | 0 |
| 2015-01-01_01:43:50 | 0 |
| 2015-01-01_01:43:51 | 0 |
| 2015-01-01_01:43:52 | 0 |
| 2015-01-01_01:43:53 | 0 |
| 2015-01-01_01:43:54 | 0 |
| 2015-01-01_01:43:55 | 0 |
| 2015-01-01_01:43:56 | 0 |
| 2015-01-01_01:43:57 | 0 |
| 2015-01-01_01:43:58 | 0 |
| 2015-01-01_01:43:59 | 0 |
| 2015-01-01_01:44:00 | 0 |
| 2015-01-01_01:44:01 | 0 |
| 2015-01-01_01:44:02 | 0 |
| 2015-01-01_01:44:03 | 0 |
| 2015-01-01_01:44:04 | 0 |
| 2015-01-01_01:44:05 | 0 |
| 2015-01-01_01:44:06 | 0 |
| 2015-01-01_01:44:07 | 0 |
| 2015-01-01_01:44:08 | 0 |
| 2015-01-01_01:44:09 | 0 |
| 2015-01-01_01:44:10 | 0 |
| 2015-01-01_01:44:11 | 0 |
| 2015-01-01_01:44:12 | 0 |
| 2015-01-01_01:44:13 | 0 |
| 2015-01-01_01:44:14 | 0 |
| 2015-01-01_01:44:15 | 0 |
| 2015-01-01_01:44:16 | 0 |
| 2015-01-01_01:44:17 | 0 |
| 2015-01-01_01:44:18 | 0 |
| 2015-01-01_01:44:19 | 0 |
| 2015-01-01_01:44:20 | 0 |
| 2015-01-01_01:44:21 | 0 |
| 2015-01-01_01:44:22 | 0 |
| 2015-01-01_01:44:23 | 0 |
| 2015-01-01_01:44:24 | 0 |
| 2015-01-01_01:44:25 | 0 |
| 2015-01-01_01:44:26 | 0 |
| 2015-01-01_01:44:27 | 0 |
| 2015-01-01_01:44:28 | 0 |
| 2015-01-01_01:44:29 | 0 |
| 2015-01-01_01:44:30 | 0 |
| 2015-01-01_01:44:31 | 0 |
| 2015-01-01_01:44:32 | 0 |
| 2015-01-01_01:44:33 | 0 |
| 2015-01-01_01:44:34 | 0 |
| 2015-01-01_01:44:35 | 0 |
| 2015-01-01_01:44:36 | 3 |
| 2015-01-01_01:44:37 | 9 |
| 2015-01-01_01:44:38 | 13 |
| 2015-01-01_01:44:39 | 16 |
| 2015-01-01_01:44:40 | 17 |
| 2015-01-01_01:44:41 | 19 |
| 2015-01-01_01:44:42 | 26 |
| 2015-01-01_01:44:43 | 30 |
| 2015-01-01_01:44:44 | 30 |
| 2015-01-01_01:44:45 | 32 |
| 2015-01-01_01:44:46 | 36 |
| 2015-01-01_01:44:47 | 39 |
| 2015-01-01_01:44:48 | 42 |
| 2015-01-01_01:44:49 | 46 |
| 2015-01-01_01:44:50 | 50 |
| 2015-01-01_01:44:51 | 50 |
| 2015-01-01_01:44:52 | 54 |
| 2015-01-01_01:44:53 | 57 |
| 2015-01-01_01:44:54 | 60 |
| 2015-01-01_01:44:55 | 60 |
| 2015-01-01_01:44:56 | 59 |
| 2015-01-01_01:44:57 | 58 |
| 2015-01-01_01:44:58 | 57 |
| 2015-01-01_01:44:59 | 57 |
| 2015-01-01_01:45:00 | 56 |
| 2015-01-01_01:45:01 | 57 |
| 2015-01-01_01:45:02 | 55 |
| 2015-01-01_01:45:03 | 54 |
| 2015-01-01_01:45:04 | 52 |
| 2015-01-01_01:45:05 | 51 |
| 2015-01-01_01:45:06 | 49 |
| 2015-01-01_01:45:07 | 49 |
| 2015-01-01_01:45:08 | 48 |
| 2015-01-01_01:45:09 | 50 |
| 2015-01-01_01:45:10 | 49 |
| 2015-01-01_01:45:11 | 50 |
| 2015-01-01_01:45:12 | 53 |
| 2015-01-01_01:45:13 | 56 |
| 2015-01-01_01:45:14 | 58 |
| 2015-01-01_01:45:15 | 59 |
| 2015-01-01_01:45:16 | 60 |
| 2015-01-01_01:45:17 | 60 |
| 2015-01-01_01:45:18 | 60 |
| 2015-01-01_01:45:19 | 61 |
| 2015-01-01_01:45:20 | 61 |
| 2015-01-01_01:45:21 | 67 |
| 2015-01-01_01:45:22 | 72 |
| 2015-01-01_01:45:23 | 75 |
| 2015-01-01_01:45:24 | 75 |
| 2015-01-01_01:45:25 | 77 |
| 2015-01-01_01:45:26 | 78 |
| 2015-01-01_01:45:27 | 77 |
| 2015-01-01_01:45:28 | 77 |
| 2015-01-01_01:45:29 | 76 |
| 2015-01-01_01:45:30 | 75 |
| 2015-01-01_01:45:31 | 74 |
| 2015-01-01_01:45:32 | 73 |
| 2015-01-01_01:45:33 | 72 |
| 2015-01-01_01:45:34 | 73 |
| 2015-01-01_01:45:35 | 73 |
| 2015-01-01_01:45:36 | 71 |
| 2015-01-01_01:45:37 | 71 |
| 2015-01-01_01:45:38 | 72 |
| 2015-01-01_01:45:39 | 73 |
| 2015-01-01_01:45:40 | 74 |
| 2015-01-01_01:45:41 | 74 |
| 2015-01-01_01:45:42 | 72 |
| 2015-01-01_01:45:43 | 70 |
| 2015-01-01_01:45:44 | 70 |
| 2015-01-01_01:45:45 | 69 |
| 2015-01-01_01:45:46 | 66 |
| 2015-01-01_01:45:47 | 66 |
| 2015-01-01_01:45:48 | 64 |
| 2015-01-01_01:45:49 | 63 |
| 2015-01-01_01:45:50 | 61 |
| 2015-01-01_01:45:51 | 60 |
| 2015-01-01_01:45:52 | 59 |
| 2015-01-01_01:45:53 | 57 |
| 2015-01-01_01:45:54 | 57 |
| 2015-01-01_01:45:55 | 55 |
| 2015-01-01_01:45:56 | 54 |
| 2015-01-01_01:45:57 | 56 |
| 2015-01-01_01:45:58 | 56 |
| 2015-01-01_01:45:59 | 56 |
| 2015-01-01_01:46:00 | 55 |
| 2015-01-01_01:46:01 | 53 |
| 2015-01-01_01:46:02 | 48 |
| 2015-01-01_01:46:03 | 45 |
| 2015-01-01_01:46:04 | 43 |
| 2015-01-01_01:46:05 | 41 |
| 2015-01-01_01:46:06 | 33 |
| 2015-01-01_01:46:07 | 28 |
| 2015-01-01_01:46:08 | 26 |
| 2015-01-01_01:46:09 | 23 |
| 2015-01-01_01:46:10 | 22 |
| 2015-01-01_01:46:11 | 18 |
| 2015-01-01_01:46:12 | 16 |
| 2015-01-01_01:46:13 | 16 |
| 2015-01-01_01:46:14 | 15 |
| 2015-01-01_01:46:15 | 14 |
| 2015-01-01_01:46:16 | 14 |
| 2015-01-01_01:46:17 | 14 |
| 2015-01-01_01:46:18 | 13 |
| 2015-01-01_01:46:19 | 10 |
| 2015-01-01_01:46:20 | 7 |
| 2015-01-01_01:46:21 | 5 |
| 2015-01-01_01:46:22 | 3 |
| 2015-01-01_01:46:23 | 0 |
| 2015-01-01_01:46:24 | 0 |
| 2015-01-01_01:46:25 | 0 |
| 2015-01-01_01:46:26 | 0 |
| 2015-01-01_01:46:27 | 0 |
| 2015-01-01_01:46:28 | 0 |
| 2015-01-01_01:46:29 | 0 |
| 2015-01-01_01:46:30 | 0 |
| 2015-01-01_01:46:31 | 0 |
| 2015-01-01_01:46:32 | 0 |
| 2015-01-01_01:46:33 | 0 |
| 2015-01-01_01:46:34 | 0 |
| 2015-01-01_01:46:35 | 0 |
| 2015-01-01_01:46:36 | 0 |
| 2015-01-01_01:46:37 | 0 |
| 2015-01-01_01:46:38 | 0 |
| 2015-01-01_01:46:39 | 0 |
| 2015-01-01_01:46:40 | 0 |
| 2015-01-01_01:46:41 | 0 |
| 2015-01-01_01:46:42 | 0 |
| 2015-01-01_01:46:43 | 0 |
| 2015-01-01_01:46:44 | 0 |
| 2015-01-01_01:46:45 | 6 |
| 2015-01-01_01:46:46 | 13 |
| 2015-01-01_01:46:47 | 17 |
| 2015-01-01_01:46:48 | 19 |
| 2015-01-01_01:46:49 | 22 |
| 2015-01-01_01:46:50 | 26 |
| 2015-01-01_01:46:51 | 27 |
| 2015-01-01_01:46:52 | 30 |
| 2015-01-01_01:46:53 | 31 |
| 2015-01-01_01:46:54 | 32 |
| 2015-01-01_01:46:55 | 35 |
| 2015-01-01_01:46:56 | 39 |
| 2015-01-01_01:46:57 | 40 |
| 2015-01-01_01:46:58 | 38 |
| 2015-01-01_01:46:59 | 35 |
| 2015-01-01_01:47:00 | 34 |
| 2015-01-01_01:47:01 | 34 |
| 2015-01-01_01:47:02 | 35 |
| 2015-01-01_01:47:03 | 34 |
| 2015-01-01_01:47:04 | 34 |
| 2015-01-01_01:47:05 | 34 |
| 2015-01-01_01:47:06 | 33 |
| 2015-01-01_01:47:07 | 33 |
| 2015-01-01_01:47:08 | 32 |
| 2015-01-01_01:47:09 | 34 |
| 2015-01-01_01:47:10 | 35 |
| 2015-01-01_01:47:11 | 38 |
| 2015-01-01_01:47:12 | 39 |
| 2015-01-01_01:47:13 | 42 |
| 2015-01-01_01:47:14 | 45 |
| 2015-01-01_01:47:15 | 49 |
| 2015-01-01_01:47:16 | 50 |
| 2015-01-01_01:47:17 | 53 |
| 2015-01-01_01:47:18 | 55 |
| 2015-01-01_01:47:19 | 57 |
| 2015-01-01_01:47:20 | 57 |
| 2015-01-01_01:47:21 | 57 |
| 2015-01-01_01:47:22 | 57 |
| 2015-01-01_01:47:23 | 56 |
| 2015-01-01_01:47:24 | 57 |
| 2015-01-01_01:47:25 | 58 |
| 2015-01-01_01:47:26 | 57 |
| 2015-01-01_01:47:27 | 58 |
| 2015-01-01_01:47:28 | 57 |
| 2015-01-01_01:47:29 | 57 |
| 2015-01-01_01:47:30 | 57 |
| 2015-01-01_01:47:31 | 57 |
| 2015-01-01_01:47:32 | 56 |
| 2015-01-01_01:47:33 | 55 |
| 2015-01-01_01:47:34 | 53 |
| 2015-01-01_01:47:35 | 51 |
| 2015-01-01_01:47:36 | 48 |
| 2015-01-01_01:47:37 | 48 |
| 2015-01-01_01:47:38 | 47 |
| 2015-01-01_01:47:39 | 49 |
| 2015-01-01_01:47:40 | 48 |
| 2015-01-01_01:47:41 | 46 |
| 2015-01-01_01:47:42 | 44 |
| 2015-01-01_01:47:43 | 42 |
| 2015-01-01_01:47:44 | 40 |
| 2015-01-01_01:47:45 | 38 |
| 2015-01-01_01:47:46 | 33 |
| 2015-01-01_01:47:47 | 28 |
| 2015-01-01_01:47:48 | 25 |
| 2015-01-01_01:47:49 | 21 |
| 2015-01-01_01:47:50 | 19 |
| 2015-01-01_01:47:51 | 16 |
| 2015-01-01_01:47:52 | 13 |
| 2015-01-01_01:47:53 | 11 |
| 2015-01-01_01:47:54 | 9 |
| 2015-01-01_01:47:55 | 8 |
| 2015-01-01_01:47:56 | 5 |
| 2015-01-01_01:47:57 | 5 |
| 2015-01-01_01:47:58 | 3 |
| 2015-01-01_01:47:59 | 3 |
| 2015-01-01_01:48:00 | 0 |
| 2015-01-01_01:48:01 | 0 |
| 2015-01-01_01:48:02 | 0 |
| 2015-01-01_01:48:03 | 0 |
| 2015-01-01_01:48:04 | 0 |
| 2015-01-01_01:48:05 | 0 |
| 2015-01-01_01:48:06 | 0 |
| 2015-01-01_01:48:07 | 0 |
| 2015-01-01_01:48:08 | 0 |
| 2015-01-01_01:48:09 | 0 |
| 2015-01-01_01:48:10 | 5 |
| 2015-01-01_01:48:11 | 7 |
| 2015-01-01_01:48:12 | 7 |
| 2015-01-01_01:48:13 | 7 |
| 2015-01-01_01:48:14 | 8 |
| 2015-01-01_01:48:15 | 12 |
| 2015-01-01_01:48:16 | 17 |
| 2015-01-01_01:48:17 | 17 |
| 2015-01-01_01:48:18 | 18 |
| 2015-01-01_01:48:19 | 23 |
| 2015-01-01_01:48:20 | 26 |
| 2015-01-01_01:48:21 | 28 |
| 2015-01-01_01:48:22 | 28 |
| 2015-01-01_01:48:23 | 30 |
| 2015-01-01_01:48:24 | 29 |
| 2015-01-01_01:48:25 | 31 |
| 2015-01-01_01:48:26 | 34 |
| 2015-01-01_01:48:27 | 37 |
| 2015-01-01_01:48:28 | 39 |
| 2015-01-01_01:48:29 | 42 |
| 2015-01-01_01:48:30 | 41 |
| 2015-01-01_01:48:31 | 42 |
| 2015-01-01_01:48:32 | 42 |
| 2015-01-01_01:48:33 | 45 |
| 2015-01-01_01:48:34 | 51 |
| 2015-01-01_01:48:35 | 55 |
| 2015-01-01_01:48:36 | 58 |
| 2015-01-01_01:48:37 | 61 |
| 2015-01-01_01:48:38 | 65 |
| 2015-01-01_01:48:39 | 65 |
| 2015-01-01_01:48:40 | 64 |
| 2015-01-01_01:48:41 | 66 |
| 2015-01-01_01:48:42 | 66 |
| 2015-01-01_01:48:43 | 69 |
| 2015-01-01_01:48:44 | 72 |
| 2015-01-01_01:48:45 | 72 |
| 2015-01-01_01:48:46 | 73 |
| 2015-01-01_01:48:47 | 73 |
| 2015-01-01_01:48:48 | 72 |
| 2015-01-01_01:48:49 | 74 |
| 2015-01-01_01:48:50 | 74 |
| 2015-01-01_01:48:51 | 72 |
| 2015-01-01_01:48:52 | 72 |
| 2015-01-01_01:48:53 | 68 |
| 2015-01-01_01:48:54 | 62 |
| 2015-01-01_01:48:55 | 59 |
| 2015-01-01_01:48:56 | 58 |
| 2015-01-01_01:48:57 | 57 |
| 2015-01-01_01:48:58 | 55 |
| 2015-01-01_01:48:59 | 53 |
| 2015-01-01_01:49:00 | 50 |
| 2015-01-01_01:49:01 | 42 |
| 2015-01-01_01:49:02 | 34 |
| 2015-01-01_01:49:03 | 28 |
| 2015-01-01_01:49:04 | 24 |
| 2015-01-01_01:49:05 | 18 |
| 2015-01-01_01:49:06 | 14 |
| 2015-01-01_01:49:07 | 9 |
| 2015-01-01_01:49:08 | 4 |
| 2015-01-01_01:49:09 | 2 |
| 2015-01-01_01:49:10 | 1 |
| 2015-01-01_01:49:11 | 0 |
| 2015-01-01_01:49:12 | 0 |
| 2015-01-01_01:49:13 | 2 |
| 2015-01-01_01:49:14 | 1 |
| 2015-01-01_01:49:15 | 0 |
| 2015-01-01_01:49:16 | 0 |
| 2015-01-01_01:49:17 | 0 |
| 2015-01-01_01:49:18 | 0 |
| 2015-01-01_01:49:19 | 0 |
| 2015-01-01_01:49:20 | 0 |
| 2015-01-01_01:49:21 | 0 |
| 2015-01-01_01:49:22 | 0 |
| 2015-01-01_01:49:23 | 0 |
| 2015-01-01_01:49:24 | 0 |
| 2015-01-01_01:49:25 | 0 |
| 2015-01-01_01:49:26 | 0 |
| 2015-01-01_01:49:27 | 0 |
| 2015-01-01_01:49:28 | 0 |
| 2015-01-01_01:49:29 | 0 |
| 2015-01-01_01:49:30 | 0 |
| 2015-01-01_01:49:31 | 0 |
| 2015-01-01_01:49:32 | 0 |
| 2015-01-01_01:49:33 | 0 |
| 2015-01-01_01:49:34 | 0 |
| 2015-01-01_01:49:35 | 0 |
| 2015-01-01_01:49:36 | 0 |
| 2015-01-01_01:49:37 | 0 |
| 2015-01-01_01:49:38 | 0 |
| 2015-01-01_01:49:39 | 0 |
| 2015-01-01_01:49:40 | 0 |
| 2015-01-01_01:49:41 | 0 |
| 2015-01-01_01:49:42 | 0 |
| 2015-01-01_01:49:43 | 0 |
| 2015-01-01_01:49:44 | 0 |
| 2015-01-01_01:49:45 | 0 |
| 2015-01-01_01:49:46 | 0 |
| 2015-01-01_01:49:47 | 0 |
| 2015-01-01_01:49:48 | 0 |
| 2015-01-01_01:49:49 | 1 |
| 2015-01-01_01:49:50 | 9 |
| 2015-01-01_01:49:51 | 16 |
| 2015-01-01_01:49:52 | 20 |
| 2015-01-01_01:49:53 | 23 |
| 2015-01-01_01:49:54 | 27 |
| 2015-01-01_01:49:55 | 29 |
| 2015-01-01_01:49:56 | 34 |
| 2015-01-01_01:49:57 | 39 |
| 2015-01-01_01:49:58 | 42 |
| 2015-01-01_01:49:59 | 51 |
| 2015-01-01_01:50:00 | 60 |
| 2015-01-01_01:50:01 | 68 |
| 2015-01-01_01:50:02 | 71 |
| 2015-01-01_01:50:03 | 77 |
| 2015-01-01_01:50:04 | 82 |
| 2015-01-01_01:50:05 | 87 |
| 2015-01-01_01:50:06 | 89 |
| 2015-01-01_01:50:07 | 88 |
| 2015-01-01_01:50:08 | 89 |
| 2015-01-01_01:50:09 | 90 |
| 2015-01-01_01:50:10 | 91 |
| 2015-01-01_01:50:11 | 90 |
| 2015-01-01_01:50:12 | 89 |
| 2015-01-01_01:50:13 | 91 |
| 2015-01-01_01:50:14 | 92 |
| 2015-01-01_01:50:15 | 92 |
| 2015-01-01_01:50:16 | 91 |
| 2015-01-01_01:50:17 | 91 |
| 2015-01-01_01:50:18 | 90 |
| 2015-01-01_01:50:19 | 89 |
| 2015-01-01_01:50:20 | 90 |
| 2015-01-01_01:50:21 | 91 |
| 2015-01-01_01:50:22 | 94 |
| 2015-01-01_01:50:23 | 94 |
| 2015-01-01_01:50:24 | 92 |
| 2015-01-01_01:50:25 | 91 |
| 2015-01-01_01:50:26 | 90 |
| 2015-01-01_01:50:27 | 91 |
| 2015-01-01_01:50:28 | 91 |
| 2015-01-01_01:50:29 | 91 |
| 2015-01-01_01:50:30 | 90 |
| 2015-01-01_01:50:31 | 90 |
| 2015-01-01_01:50:32 | 88 |
| 2015-01-01_01:50:33 | 87 |
| 2015-01-01_01:50:34 | 85 |
| 2015-01-01_01:50:35 | 84 |
| 2015-01-01_01:50:36 | 82 |
| 2015-01-01_01:50:37 | 81 |
| 2015-01-01_01:50:38 | 80 |
| 2015-01-01_01:50:39 | 80 |
| 2015-01-01_01:50:40 | 81 |
| 2015-01-01_01:50:41 | 78 |
| 2015-01-01_01:50:42 | 77 |
| 2015-01-01_01:50:43 | 76 |
| 2015-01-01_01:50:44 | 76 |
| 2015-01-01_01:50:45 | 74 |
| 2015-01-01_01:50:46 | 73 |
| 2015-01-01_01:50:47 | 70 |
| 2015-01-01_01:50:48 | 70 |
| 2015-01-01_01:50:49 | 69 |
| 2015-01-01_01:50:50 | 67 |
| 2015-01-01_01:50:51 | 63 |
| 2015-01-01_01:50:52 | 59 |
| 2015-01-01_01:50:53 | 56 |
| 2015-01-01_01:50:54 | 51 |
| 2015-01-01_01:50:55 | 46 |
| 2015-01-01_01:50:56 | 40 |
| 2015-01-01_01:50:57 | 37 |
| 2015-01-01_01:50:58 | 35 |
| 2015-01-01_01:50:59 | 36 |
| 2015-01-01_01:51:00 | 40 |
| 2015-01-01_01:51:01 | 43 |
| 2015-01-01_01:51:02 | 45 |
| 2015-01-01_01:51:03 | 47 |
| 2015-01-01_01:51:04 | 47 |
| 2015-01-01_01:51:05 | 47 |
| 2015-01-01_01:51:06 | 42 |
| 2015-01-01_01:51:07 | 32 |
| 2015-01-01_01:51:08 | 24 |
| 2015-01-01_01:51:09 | 17 |
| 2015-01-01_01:51:10 | 13 |
| 2015-01-01_01:51:11 | 10 |
| 2015-01-01_01:51:12 | 7 |
| 2015-01-01_01:51:13 | 4 |
| 2015-01-01_01:51:14 | 4 |
| 2015-01-01_01:51:15 | 4 |
| 2015-01-01_01:51:16 | 8 |
| 2015-01-01_01:51:17 | 16 |
| 2015-01-01_01:51:18 | 20 |
| 2015-01-01_01:51:19 | 23 |
| 2015-01-01_01:51:20 | 30 |
| 2015-01-01_01:51:21 | 35 |
| 2015-01-01_01:51:22 | 36 |
| 2015-01-01_01:51:23 | 39 |
| 2015-01-01_01:51:24 | 44 |
| 2015-01-01_01:51:25 | 49 |
| 2015-01-01_01:51:26 | 53 |
| 2015-01-01_01:51:27 | 54 |
| 2015-01-01_01:51:28 | 58 |
| 2015-01-01_01:51:29 | 62 |
| 2015-01-01_01:51:30 | 63 |
| 2015-01-01_01:51:31 | 65 |
| 2015-01-01_01:51:32 | 63 |
| 2015-01-01_01:51:33 | 62 |
| 2015-01-01_01:51:34 | 61 |
| 2015-01-01_01:51:35 | 59 |
| 2015-01-01_01:51:36 | 59 |
| 2015-01-01_01:51:37 | 61 |
| 2015-01-01_01:51:38 | 62 |
| 2015-01-01_01:51:39 | 63 |
| 2015-01-01_01:51:40 | 64 |
| 2015-01-01_01:51:41 | 64 |
| 2015-01-01_01:51:42 | 66 |
| 2015-01-01_01:51:43 | 64 |
| 2015-01-01_01:51:44 | 65 |
| 2015-01-01_01:51:45 | 68 |
| 2015-01-01_01:51:46 | 73 |
| 2015-01-01_01:51:47 | 74 |
| 2015-01-01_01:51:48 | 73 |
| 2015-01-01_01:51:49 | 71 |
| 2015-01-01_01:51:50 | 67 |
| 2015-01-01_01:51:51 | 61 |
| 2015-01-01_01:51:52 | 54 |
| 2015-01-01_01:51:53 | 48 |
| 2015-01-01_01:51:54 | 43 |
| 2015-01-01_01:51:55 | 43 |
| 2015-01-01_01:51:56 | 39 |
| 2015-01-01_01:51:57 | 33 |
| 2015-01-01_01:51:58 | 27 |
| 2015-01-01_01:51:59 | 21 |
| 2015-01-01_01:52:00 | 17 |
| 2015-01-01_01:52:01 | 14 |
| 2015-01-01_01:52:02 | 6 |
| 2015-01-01_01:52:03 | 3 |
| 2015-01-01_01:52:04 | 0 |
| 2015-01-01_01:52:05 | 0 |
| 2015-01-01_01:52:06 | 6 |
| 2015-01-01_01:52:07 | 8 |
| 2015-01-01_01:52:08 | 7 |
| 2015-01-01_01:52:09 | 3 |
| 2015-01-01_01:52:10 | 0 |
| 2015-01-01_01:52:11 | 0 |
| 2015-01-01_01:52:12 | 0 |
| 2015-01-01_01:52:13 | 0 |
| 2015-01-01_01:52:14 | 0 |
| 2015-01-01_01:52:15 | 0 |
| 2015-01-01_01:52:16 | 0 |
| 2015-01-01_01:52:17 | 0 |
| 2015-01-01_01:52:18 | 0 |
| 2015-01-01_01:52:19 | 0 |
| 2015-01-01_01:52:20 | 0 |
| 2015-01-01_01:52:21 | 0 |
| 2015-01-01_01:52:22 | 0 |
| 2015-01-01_01:52:23 | 0 |
| 2015-01-01_01:52:24 | 0 |
| 2015-01-01_01:52:25 | 0 |
| 2015-01-01_01:52:26 | 0 |
| 2015-01-01_01:52:27 | 0 |
| 2015-01-01_01:52:28 | 0 |
| 2015-01-01_01:52:29 | 0 |
| 2015-01-01_01:52:30 | 0 |
| 2015-01-01_01:52:31 | 0 |
| 2015-01-01_01:52:32 | 2 |
| 2015-01-01_01:52:33 | 9 |
| 2015-01-01_01:52:34 | 15 |
| 2015-01-01_01:52:35 | 21 |
| 2015-01-01_01:52:36 | 23 |
| 2015-01-01_01:52:37 | 27 |
| 2015-01-01_01:52:38 | 33 |
| 2015-01-01_01:52:39 | 34 |
| 2015-01-01_01:52:40 | 35 |
| 2015-01-01_01:52:41 | 38 |
| 2015-01-01_01:52:42 | 39 |
| 2015-01-01_01:52:43 | 41 |
| 2015-01-01_01:52:44 | 42 |
| 2015-01-01_01:52:45 | 44 |
| 2015-01-01_01:52:46 | 43 |
| 2015-01-01_01:52:47 | 42 |
| 2015-01-01_01:52:48 | 42 |
| 2015-01-01_01:52:49 | 44 |
| 2015-01-01_01:52:50 | 45 |
| 2015-01-01_01:52:51 | 44 |
| 2015-01-01_01:52:52 | 43 |
| 2015-01-01_01:52:53 | 38 |
| 2015-01-01_01:52:54 | 35 |
| 2015-01-01_01:52:55 | 34 |
| 2015-01-01_01:52:56 | 31 |
| 2015-01-01_01:52:57 | 24 |
| 2015-01-01_01:52:58 | 20 |
| 2015-01-01_01:52:59 | 12 |
| 2015-01-01_01:53:00 | 10 |
| 2015-01-01_01:53:01 | 12 |
| 2015-01-01_01:53:02 | 15 |
| 2015-01-01_01:53:03 | 18 |
| 2015-01-01_01:53:04 | 17 |
| 2015-01-01_01:53:05 | 18 |
| 2015-01-01_01:53:06 | 21 |
| 2015-01-01_01:53:07 | 25 |
| 2015-01-01_01:53:08 | 25 |
| 2015-01-01_01:53:09 | 25 |
| 2015-01-01_01:53:10 | 29 |
| 2015-01-01_01:53:11 | 33 |
| 2015-01-01_01:53:12 | 35 |
| 2015-01-01_01:53:13 | 40 |
| 2015-01-01_01:53:14 | 43 |
| 2015-01-01_01:53:15 | 47 |
| 2015-01-01_01:53:16 | 50 |
| 2015-01-01_01:53:17 | 54 |
| 2015-01-01_01:53:18 | 58 |
| 2015-01-01_01:53:19 | 57 |
| 2015-01-01_01:53:20 | 58 |
| 2015-01-01_01:53:21 | 57 |
| 2015-01-01_01:53:22 | 54 |
| 2015-01-01_01:53:23 | 49 |
| 2015-01-01_01:53:24 | 42 |
| 2015-01-01_01:53:25 | 35 |
| 2015-01-01_01:53:26 | 26 |
| 2015-01-01_01:53:27 | 19 |
| 2015-01-01_01:53:28 | 15 |
| 2015-01-01_01:53:29 | 13 |
| 2015-01-01_01:53:30 | 14 |
| 2015-01-01_01:53:31 | 16 |
| 2015-01-01_01:53:32 | 13 |
| 2015-01-01_01:53:33 | 10 |
| 2015-01-01_01:53:34 | 10 |
| 2015-01-01_01:53:35 | 9 |
| 2015-01-01_01:53:36 | 9 |
| 2015-01-01_01:53:37 | 5 |
| 2015-01-01_01:53:38 | 1 |
| 2015-01-01_01:53:39 | 2 |
| 2015-01-01_01:53:40 | 7 |
| 2015-01-01_01:53:41 | 5 |
| 2015-01-01_01:53:42 | 4 |
| 2015-01-01_01:53:43 | 3 |
| 2015-01-01_01:53:44 | 2 |
| 2015-01-01_01:53:45 | 0 |
| 2015-01-01_01:53:46 | 0 |
| 2015-01-01_01:53:47 | 2 |
| 2015-01-01_01:53:48 | 0 |
| 2015-01-01_01:53:49 | 2 |
| 2015-01-01_01:53:50 | 4 |
| 2015-01-01_01:53:51 | 4 |
| 2015-01-01_01:53:52 | 3 |
| 2015-01-01_01:53:53 | 4 |
| 2015-01-01_01:53:54 | 1 |
| 2015-01-01_01:53:55 | 0 |
| 2015-01-01_01:53:56 | 0 |
| 2015-01-01_01:53:57 | 0 |
| 2015-01-01_01:53:58 | 0 |
| 2015-01-01_01:53:59 | 0 |
| 2015-01-01_01:54:00 | 0 |
| 2015-01-01_01:54:01 | 0 |
| 2015-01-01_01:54:02 | 0 |
| 2015-01-01_01:54:03 | 0 |
| 2015-01-01_01:54:04 | 0 |
| 2015-01-01_01:54:05 | 0 |
| 2015-01-01_01:54:06 | 0 |
| 2015-01-01_01:54:07 | 0 |
| 2015-01-01_01:54:08 | 0 |
| 2015-01-01_01:54:09 | 0 |
| 2015-01-01_01:54:10 | 0 |
| 2015-01-01_01:54:11 | 0 |
| 2015-01-01_01:54:12 | 0 |
| 2015-01-01_01:54:13 | 0 |
| 2015-01-01_01:54:14 | 0 |
| 2015-01-01_01:54:15 | 0 |
| 2015-01-01_01:54:16 | 0 |
| 2015-01-01_01:54:17 | 0 |
| 2015-01-01_01:54:18 | 0 |
| 2015-01-01_01:54:19 | 0 |
| 2015-01-01_01:54:20 | 0 |
| 2015-01-01_01:54:21 | 0 |
| 2015-01-01_01:54:22 | 0 |
| 2015-01-01_01:54:23 | 0 |
| 2015-01-01_01:54:24 | 0 |
| 2015-01-01_01:54:25 | 0 |
| 2015-01-01_01:54:26 | 0 |
| 2015-01-01_01:54:27 | 0 |
| 2015-01-01_01:54:28 | 0 |
| 2015-01-01_01:54:29 | 0 |
| 2015-01-01_01:54:30 | 0 |
| 2015-01-01_01:54:31 | 0 |
| 2015-01-01_01:54:32 | 0 |
| 2015-01-01_01:54:33 | 0 |
| 2015-01-01_01:54:34 | 0 |
| 2015-01-01_01:54:35 | 0 |
| 2015-01-01_01:54:36 | 0 |
| 2015-01-01_01:54:37 | 0 |